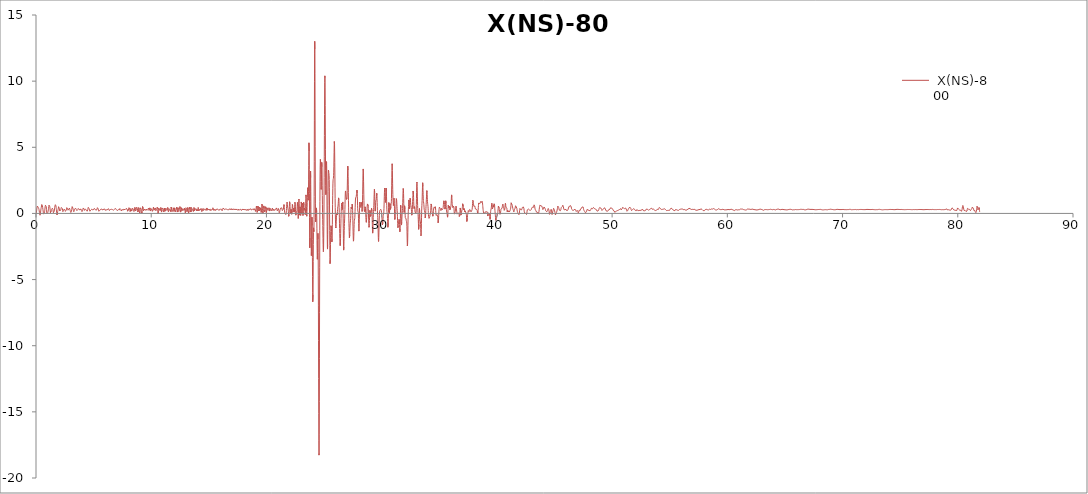
| Category |  X(NS)-800 |
|---|---|
| 0.0 | 0 |
| 0.01 | -0.018 |
| 0.02 | -0.003 |
| 0.03 | 0.041 |
| 0.04 | 0.106 |
| 0.05 | 0.182 |
| 0.06 | 0.262 |
| 0.07 | 0.337 |
| 0.08 | 0.404 |
| 0.09 | 0.46 |
| 0.1 | 0.504 |
| 0.11 | 0.535 |
| 0.12 | 0.554 |
| 0.13 | 0.56 |
| 0.14 | 0.555 |
| 0.15 | 0.54 |
| 0.16 | 0.519 |
| 0.17 | 0.494 |
| 0.18 | 0.468 |
| 0.19 | 0.446 |
| 0.2 | 0.429 |
| 0.21 | 0.415 |
| 0.22 | 0.403 |
| 0.23 | 0.389 |
| 0.24 | 0.369 |
| 0.25 | 0.339 |
| 0.26 | 0.299 |
| 0.27 | 0.248 |
| 0.28 | 0.19 |
| 0.29 | 0.128 |
| 0.3 | 0.064 |
| 0.31 | 0.005 |
| 0.32 | -0.049 |
| 0.33 | -0.092 |
| 0.34 | -0.123 |
| 0.35 | -0.136 |
| 0.36 | -0.129 |
| 0.37 | -0.1 |
| 0.38 | -0.048 |
| 0.39 | 0.022 |
| 0.4 | 0.104 |
| 0.41 | 0.187 |
| 0.42 | 0.265 |
| 0.43 | 0.33 |
| 0.44 | 0.383 |
| 0.45 | 0.427 |
| 0.46 | 0.468 |
| 0.47 | 0.513 |
| 0.48 | 0.564 |
| 0.49 | 0.619 |
| 0.5 | 0.673 |
| 0.51 | 0.714 |
| 0.52 | 0.734 |
| 0.53 | 0.728 |
| 0.54 | 0.695 |
| 0.55 | 0.641 |
| 0.56 | 0.575 |
| 0.57 | 0.506 |
| 0.58 | 0.44 |
| 0.59 | 0.377 |
| 0.6 | 0.315 |
| 0.61 | 0.25 |
| 0.62 | 0.183 |
| 0.63 | 0.113 |
| 0.64 | 0.046 |
| 0.65 | -0.011 |
| 0.66 | -0.052 |
| 0.67 | -0.074 |
| 0.68 | -0.079 |
| 0.69 | -0.07 |
| 0.7 | -0.051 |
| 0.71 | -0.027 |
| 0.72 | 0.004 |
| 0.73 | 0.043 |
| 0.74 | 0.094 |
| 0.75 | 0.159 |
| 0.76 | 0.236 |
| 0.77 | 0.318 |
| 0.78 | 0.4 |
| 0.79 | 0.474 |
| 0.8 | 0.534 |
| 0.81 | 0.582 |
| 0.82 | 0.617 |
| 0.83 | 0.645 |
| 0.84 | 0.664 |
| 0.85 | 0.674 |
| 0.86 | 0.668 |
| 0.87 | 0.641 |
| 0.88 | 0.587 |
| 0.89 | 0.508 |
| 0.9 | 0.408 |
| 0.91 | 0.299 |
| 0.92 | 0.191 |
| 0.93 | 0.097 |
| 0.94 | 0.024 |
| 0.95 | -0.025 |
| 0.96 | -0.052 |
| 0.97 | -0.061 |
| 0.98 | -0.056 |
| 0.99 | -0.041 |
| 1.0 | -0.019 |
| 1.01 | 0.01 |
| 1.02 | 0.045 |
| 1.03 | 0.084 |
| 1.04 | 0.127 |
| 1.05 | 0.172 |
| 1.06 | 0.22 |
| 1.07 | 0.271 |
| 1.08 | 0.326 |
| 1.09 | 0.386 |
| 1.1 | 0.45 |
| 1.11 | 0.514 |
| 1.12 | 0.575 |
| 1.13 | 0.628 |
| 1.14 | 0.666 |
| 1.15 | 0.687 |
| 1.16 | 0.689 |
| 1.17 | 0.671 |
| 1.18 | 0.633 |
| 1.19 | 0.578 |
| 1.2 | 0.505 |
| 1.21 | 0.419 |
| 1.22 | 0.322 |
| 1.23 | 0.222 |
| 1.24 | 0.129 |
| 1.25 | 0.052 |
| 1.26 | 0.001 |
| 1.27 | -0.018 |
| 1.28 | -0.003 |
| 1.29 | 0.042 |
| 1.3 | 0.106 |
| 1.31 | 0.178 |
| 1.32 | 0.243 |
| 1.33 | 0.293 |
| 1.34 | 0.323 |
| 1.35 | 0.334 |
| 1.36 | 0.331 |
| 1.37 | 0.323 |
| 1.38 | 0.319 |
| 1.39 | 0.324 |
| 1.4 | 0.341 |
| 1.41 | 0.365 |
| 1.42 | 0.392 |
| 1.43 | 0.412 |
| 1.44 | 0.417 |
| 1.45 | 0.402 |
| 1.46 | 0.367 |
| 1.47 | 0.313 |
| 1.48 | 0.246 |
| 1.49 | 0.176 |
| 1.5 | 0.109 |
| 1.51 | 0.053 |
| 1.52 | 0.013 |
| 1.53 | -0.009 |
| 1.54 | -0.013 |
| 1.55 | 0 |
| 1.56 | 0.029 |
| 1.57 | 0.072 |
| 1.58 | 0.126 |
| 1.59 | 0.188 |
| 1.6 | 0.257 |
| 1.61 | 0.329 |
| 1.62 | 0.4 |
| 1.63 | 0.467 |
| 1.64 | 0.527 |
| 1.65 | 0.577 |
| 1.66 | 0.616 |
| 1.67 | 0.644 |
| 1.68 | 0.66 |
| 1.69 | 0.665 |
| 1.7 | 0.659 |
| 1.71 | 0.642 |
| 1.72 | 0.614 |
| 1.73 | 0.574 |
| 1.74 | 0.522 |
| 1.75 | 0.456 |
| 1.76 | 0.378 |
| 1.77 | 0.288 |
| 1.78 | 0.19 |
| 1.79 | 0.092 |
| 1.8 | 0.003 |
| 1.81 | -0.068 |
| 1.82 | -0.113 |
| 1.83 | -0.125 |
| 1.84 | -0.106 |
| 1.85 | -0.061 |
| 1.86 | 0.002 |
| 1.87 | 0.07 |
| 1.88 | 0.134 |
| 1.89 | 0.188 |
| 1.9 | 0.232 |
| 1.91 | 0.27 |
| 1.92 | 0.308 |
| 1.93 | 0.352 |
| 1.94 | 0.403 |
| 1.95 | 0.458 |
| 1.96 | 0.51 |
| 1.97 | 0.548 |
| 1.98 | 0.564 |
| 1.99 | 0.553 |
| 2.0 | 0.515 |
| 2.01 | 0.456 |
| 2.02 | 0.388 |
| 2.03 | 0.32 |
| 2.04 | 0.261 |
| 2.05 | 0.215 |
| 2.06 | 0.18 |
| 2.07 | 0.155 |
| 2.08 | 0.136 |
| 2.09 | 0.122 |
| 2.1 | 0.114 |
| 2.11 | 0.116 |
| 2.12 | 0.132 |
| 2.13 | 0.163 |
| 2.14 | 0.209 |
| 2.15 | 0.264 |
| 2.16 | 0.322 |
| 2.17 | 0.374 |
| 2.18 | 0.414 |
| 2.19 | 0.439 |
| 2.2 | 0.45 |
| 2.21 | 0.452 |
| 2.22 | 0.45 |
| 2.23 | 0.448 |
| 2.24 | 0.448 |
| 2.25 | 0.447 |
| 2.26 | 0.442 |
| 2.27 | 0.428 |
| 2.28 | 0.399 |
| 2.29 | 0.356 |
| 2.3 | 0.301 |
| 2.31 | 0.24 |
| 2.32 | 0.181 |
| 2.33 | 0.134 |
| 2.34 | 0.104 |
| 2.35 | 0.094 |
| 2.36 | 0.105 |
| 2.37 | 0.131 |
| 2.38 | 0.165 |
| 2.39 | 0.202 |
| 2.4 | 0.235 |
| 2.41 | 0.262 |
| 2.42 | 0.285 |
| 2.43 | 0.304 |
| 2.44 | 0.322 |
| 2.45 | 0.339 |
| 2.46 | 0.355 |
| 2.47 | 0.364 |
| 2.48 | 0.363 |
| 2.49 | 0.348 |
| 2.5 | 0.318 |
| 2.51 | 0.278 |
| 2.52 | 0.235 |
| 2.53 | 0.195 |
| 2.54 | 0.167 |
| 2.55 | 0.154 |
| 2.56 | 0.156 |
| 2.57 | 0.169 |
| 2.58 | 0.187 |
| 2.59 | 0.206 |
| 2.6 | 0.223 |
| 2.61 | 0.238 |
| 2.62 | 0.254 |
| 2.63 | 0.275 |
| 2.64 | 0.305 |
| 2.65 | 0.345 |
| 2.66 | 0.391 |
| 2.67 | 0.438 |
| 2.68 | 0.478 |
| 2.69 | 0.504 |
| 2.7 | 0.511 |
| 2.71 | 0.497 |
| 2.72 | 0.465 |
| 2.73 | 0.421 |
| 2.74 | 0.371 |
| 2.75 | 0.324 |
| 2.76 | 0.285 |
| 2.77 | 0.258 |
| 2.78 | 0.243 |
| 2.79 | 0.239 |
| 2.8 | 0.242 |
| 2.81 | 0.25 |
| 2.82 | 0.26 |
| 2.83 | 0.272 |
| 2.84 | 0.287 |
| 2.85 | 0.306 |
| 2.86 | 0.329 |
| 2.87 | 0.355 |
| 2.88 | 0.381 |
| 2.89 | 0.4 |
| 2.9 | 0.408 |
| 2.91 | 0.402 |
| 2.92 | 0.382 |
| 2.93 | 0.35 |
| 2.94 | 0.312 |
| 2.95 | 0.272 |
| 2.96 | 0.236 |
| 2.97 | 0.204 |
| 2.98 | 0.176 |
| 2.99 | 0.149 |
| 3.0 | 0.122 |
| 3.01 | 0.096 |
| 3.02 | 0.073 |
| 3.03 | 0.057 |
| 3.04 | 0.052 |
| 3.05 | 0.061 |
| 3.06 | 0.086 |
| 3.07 | 0.124 |
| 3.08 | 0.173 |
| 3.09 | 0.23 |
| 3.1 | 0.291 |
| 3.11 | 0.354 |
| 3.12 | 0.415 |
| 3.13 | 0.471 |
| 3.14 | 0.516 |
| 3.15 | 0.544 |
| 3.16 | 0.552 |
| 3.17 | 0.537 |
| 3.18 | 0.503 |
| 3.19 | 0.457 |
| 3.2 | 0.407 |
| 3.21 | 0.361 |
| 3.22 | 0.321 |
| 3.23 | 0.289 |
| 3.24 | 0.26 |
| 3.25 | 0.229 |
| 3.26 | 0.196 |
| 3.27 | 0.16 |
| 3.28 | 0.129 |
| 3.29 | 0.111 |
| 3.3 | 0.112 |
| 3.31 | 0.135 |
| 3.32 | 0.177 |
| 3.33 | 0.228 |
| 3.34 | 0.278 |
| 3.35 | 0.316 |
| 3.36 | 0.338 |
| 3.37 | 0.345 |
| 3.38 | 0.343 |
| 3.39 | 0.341 |
| 3.4 | 0.345 |
| 3.41 | 0.358 |
| 3.42 | 0.378 |
| 3.43 | 0.398 |
| 3.44 | 0.411 |
| 3.45 | 0.413 |
| 3.46 | 0.402 |
| 3.47 | 0.38 |
| 3.48 | 0.352 |
| 3.49 | 0.324 |
| 3.5 | 0.299 |
| 3.51 | 0.277 |
| 3.52 | 0.259 |
| 3.53 | 0.242 |
| 3.54 | 0.226 |
| 3.55 | 0.211 |
| 3.56 | 0.199 |
| 3.57 | 0.191 |
| 3.58 | 0.191 |
| 3.59 | 0.199 |
| 3.6 | 0.215 |
| 3.61 | 0.236 |
| 3.62 | 0.262 |
| 3.63 | 0.289 |
| 3.64 | 0.316 |
| 3.65 | 0.342 |
| 3.66 | 0.362 |
| 3.67 | 0.375 |
| 3.68 | 0.379 |
| 3.69 | 0.374 |
| 3.7 | 0.36 |
| 3.71 | 0.342 |
| 3.72 | 0.323 |
| 3.73 | 0.307 |
| 3.74 | 0.297 |
| 3.75 | 0.293 |
| 3.76 | 0.291 |
| 3.77 | 0.288 |
| 3.78 | 0.283 |
| 3.79 | 0.273 |
| 3.8 | 0.262 |
| 3.81 | 0.252 |
| 3.82 | 0.25 |
| 3.83 | 0.258 |
| 3.84 | 0.274 |
| 3.85 | 0.298 |
| 3.86 | 0.323 |
| 3.87 | 0.345 |
| 3.88 | 0.358 |
| 3.89 | 0.363 |
| 3.9 | 0.359 |
| 3.91 | 0.35 |
| 3.92 | 0.337 |
| 3.93 | 0.321 |
| 3.94 | 0.302 |
| 3.95 | 0.278 |
| 3.96 | 0.247 |
| 3.97 | 0.211 |
| 3.98 | 0.173 |
| 3.99 | 0.138 |
| 4.0 | 0.112 |
| 4.01 | 0.099 |
| 4.02 | 0.103 |
| 4.03 | 0.122 |
| 4.04 | 0.154 |
| 4.05 | 0.196 |
| 4.06 | 0.241 |
| 4.07 | 0.288 |
| 4.08 | 0.333 |
| 4.09 | 0.375 |
| 4.1 | 0.412 |
| 4.11 | 0.443 |
| 4.12 | 0.464 |
| 4.13 | 0.475 |
| 4.14 | 0.472 |
| 4.15 | 0.456 |
| 4.16 | 0.43 |
| 4.17 | 0.396 |
| 4.18 | 0.359 |
| 4.19 | 0.321 |
| 4.2 | 0.285 |
| 4.21 | 0.254 |
| 4.22 | 0.229 |
| 4.23 | 0.212 |
| 4.24 | 0.204 |
| 4.25 | 0.207 |
| 4.26 | 0.222 |
| 4.27 | 0.245 |
| 4.28 | 0.273 |
| 4.29 | 0.302 |
| 4.3 | 0.325 |
| 4.31 | 0.339 |
| 4.32 | 0.341 |
| 4.33 | 0.334 |
| 4.34 | 0.32 |
| 4.35 | 0.304 |
| 4.36 | 0.289 |
| 4.37 | 0.275 |
| 4.38 | 0.263 |
| 4.39 | 0.251 |
| 4.4 | 0.235 |
| 4.41 | 0.217 |
| 4.42 | 0.196 |
| 4.43 | 0.178 |
| 4.44 | 0.167 |
| 4.45 | 0.166 |
| 4.46 | 0.178 |
| 4.47 | 0.205 |
| 4.48 | 0.242 |
| 4.49 | 0.285 |
| 4.5 | 0.331 |
| 4.51 | 0.374 |
| 4.52 | 0.411 |
| 4.53 | 0.439 |
| 4.54 | 0.459 |
| 4.55 | 0.468 |
| 4.56 | 0.468 |
| 4.57 | 0.459 |
| 4.58 | 0.442 |
| 4.59 | 0.418 |
| 4.6 | 0.389 |
| 4.61 | 0.356 |
| 4.62 | 0.32 |
| 4.63 | 0.285 |
| 4.64 | 0.252 |
| 4.65 | 0.222 |
| 4.66 | 0.197 |
| 4.67 | 0.178 |
| 4.68 | 0.166 |
| 4.69 | 0.161 |
| 4.7 | 0.165 |
| 4.71 | 0.175 |
| 4.72 | 0.191 |
| 4.73 | 0.21 |
| 4.74 | 0.23 |
| 4.75 | 0.248 |
| 4.76 | 0.265 |
| 4.77 | 0.279 |
| 4.78 | 0.291 |
| 4.79 | 0.3 |
| 4.8 | 0.307 |
| 4.81 | 0.312 |
| 4.82 | 0.316 |
| 4.83 | 0.319 |
| 4.84 | 0.32 |
| 4.85 | 0.319 |
| 4.86 | 0.318 |
| 4.87 | 0.315 |
| 4.88 | 0.312 |
| 4.89 | 0.308 |
| 4.9 | 0.302 |
| 4.91 | 0.294 |
| 4.92 | 0.282 |
| 4.93 | 0.268 |
| 4.94 | 0.253 |
| 4.95 | 0.237 |
| 4.96 | 0.224 |
| 4.97 | 0.217 |
| 4.98 | 0.218 |
| 4.99 | 0.227 |
| 5.0 | 0.246 |
| 5.01 | 0.271 |
| 5.02 | 0.3 |
| 5.03 | 0.33 |
| 5.04 | 0.356 |
| 5.05 | 0.376 |
| 5.06 | 0.389 |
| 5.07 | 0.396 |
| 5.08 | 0.395 |
| 5.09 | 0.388 |
| 5.1 | 0.377 |
| 5.11 | 0.362 |
| 5.12 | 0.344 |
| 5.13 | 0.324 |
| 5.14 | 0.304 |
| 5.15 | 0.284 |
| 5.16 | 0.267 |
| 5.17 | 0.254 |
| 5.18 | 0.245 |
| 5.19 | 0.24 |
| 5.2 | 0.238 |
| 5.21 | 0.238 |
| 5.22 | 0.238 |
| 5.23 | 0.237 |
| 5.24 | 0.237 |
| 5.25 | 0.239 |
| 5.26 | 0.246 |
| 5.27 | 0.258 |
| 5.28 | 0.279 |
| 5.29 | 0.307 |
| 5.3 | 0.341 |
| 5.31 | 0.376 |
| 5.32 | 0.409 |
| 5.33 | 0.435 |
| 5.34 | 0.45 |
| 5.35 | 0.453 |
| 5.36 | 0.442 |
| 5.37 | 0.421 |
| 5.38 | 0.391 |
| 5.39 | 0.356 |
| 5.4 | 0.319 |
| 5.41 | 0.284 |
| 5.42 | 0.251 |
| 5.43 | 0.223 |
| 5.44 | 0.198 |
| 5.45 | 0.179 |
| 5.46 | 0.164 |
| 5.47 | 0.154 |
| 5.48 | 0.15 |
| 5.49 | 0.153 |
| 5.5 | 0.163 |
| 5.51 | 0.178 |
| 5.52 | 0.198 |
| 5.53 | 0.22 |
| 5.54 | 0.242 |
| 5.55 | 0.26 |
| 5.56 | 0.274 |
| 5.57 | 0.284 |
| 5.58 | 0.29 |
| 5.59 | 0.293 |
| 5.6 | 0.296 |
| 5.61 | 0.3 |
| 5.62 | 0.306 |
| 5.63 | 0.313 |
| 5.64 | 0.321 |
| 5.65 | 0.327 |
| 5.66 | 0.332 |
| 5.67 | 0.333 |
| 5.68 | 0.331 |
| 5.69 | 0.328 |
| 5.7 | 0.325 |
| 5.71 | 0.324 |
| 5.72 | 0.325 |
| 5.73 | 0.329 |
| 5.74 | 0.333 |
| 5.75 | 0.335 |
| 5.76 | 0.333 |
| 5.77 | 0.324 |
| 5.78 | 0.309 |
| 5.79 | 0.29 |
| 5.8 | 0.27 |
| 5.81 | 0.253 |
| 5.82 | 0.244 |
| 5.83 | 0.244 |
| 5.84 | 0.252 |
| 5.85 | 0.269 |
| 5.86 | 0.29 |
| 5.87 | 0.311 |
| 5.88 | 0.332 |
| 5.89 | 0.35 |
| 5.9 | 0.364 |
| 5.91 | 0.376 |
| 5.92 | 0.383 |
| 5.93 | 0.385 |
| 5.94 | 0.382 |
| 5.95 | 0.372 |
| 5.96 | 0.353 |
| 5.97 | 0.328 |
| 5.98 | 0.299 |
| 5.99 | 0.268 |
| 6.0 | 0.241 |
| 6.01 | 0.221 |
| 6.02 | 0.21 |
| 6.03 | 0.207 |
| 6.04 | 0.213 |
| 6.05 | 0.223 |
| 6.06 | 0.236 |
| 6.07 | 0.248 |
| 6.08 | 0.258 |
| 6.09 | 0.267 |
| 6.1 | 0.273 |
| 6.11 | 0.278 |
| 6.12 | 0.282 |
| 6.13 | 0.284 |
| 6.14 | 0.285 |
| 6.15 | 0.283 |
| 6.16 | 0.279 |
| 6.17 | 0.274 |
| 6.18 | 0.269 |
| 6.19 | 0.266 |
| 6.2 | 0.268 |
| 6.21 | 0.276 |
| 6.22 | 0.289 |
| 6.23 | 0.308 |
| 6.24 | 0.329 |
| 6.25 | 0.351 |
| 6.26 | 0.37 |
| 6.27 | 0.385 |
| 6.28 | 0.394 |
| 6.29 | 0.397 |
| 6.3 | 0.393 |
| 6.31 | 0.383 |
| 6.32 | 0.367 |
| 6.33 | 0.344 |
| 6.34 | 0.317 |
| 6.35 | 0.285 |
| 6.36 | 0.251 |
| 6.37 | 0.218 |
| 6.38 | 0.191 |
| 6.39 | 0.172 |
| 6.4 | 0.165 |
| 6.41 | 0.17 |
| 6.42 | 0.187 |
| 6.43 | 0.213 |
| 6.44 | 0.243 |
| 6.45 | 0.273 |
| 6.46 | 0.298 |
| 6.47 | 0.316 |
| 6.48 | 0.325 |
| 6.49 | 0.327 |
| 6.5 | 0.322 |
| 6.51 | 0.316 |
| 6.52 | 0.309 |
| 6.53 | 0.306 |
| 6.54 | 0.307 |
| 6.55 | 0.311 |
| 6.56 | 0.318 |
| 6.57 | 0.325 |
| 6.58 | 0.33 |
| 6.59 | 0.332 |
| 6.6 | 0.33 |
| 6.61 | 0.323 |
| 6.62 | 0.314 |
| 6.63 | 0.302 |
| 6.64 | 0.29 |
| 6.65 | 0.278 |
| 6.66 | 0.267 |
| 6.67 | 0.258 |
| 6.68 | 0.252 |
| 6.69 | 0.248 |
| 6.7 | 0.246 |
| 6.71 | 0.246 |
| 6.72 | 0.247 |
| 6.73 | 0.249 |
| 6.74 | 0.251 |
| 6.75 | 0.252 |
| 6.76 | 0.254 |
| 6.77 | 0.257 |
| 6.78 | 0.263 |
| 6.79 | 0.272 |
| 6.8 | 0.287 |
| 6.81 | 0.304 |
| 6.82 | 0.324 |
| 6.83 | 0.342 |
| 6.84 | 0.358 |
| 6.85 | 0.369 |
| 6.86 | 0.375 |
| 6.87 | 0.378 |
| 6.88 | 0.377 |
| 6.89 | 0.376 |
| 6.9 | 0.374 |
| 6.91 | 0.371 |
| 6.92 | 0.365 |
| 6.93 | 0.356 |
| 6.94 | 0.343 |
| 6.95 | 0.327 |
| 6.96 | 0.31 |
| 6.97 | 0.294 |
| 6.98 | 0.281 |
| 6.99 | 0.272 |
| 7.0 | 0.265 |
| 7.01 | 0.258 |
| 7.02 | 0.25 |
| 7.03 | 0.239 |
| 7.04 | 0.225 |
| 7.05 | 0.213 |
| 7.06 | 0.204 |
| 7.07 | 0.202 |
| 7.08 | 0.209 |
| 7.09 | 0.224 |
| 7.1 | 0.243 |
| 7.11 | 0.263 |
| 7.12 | 0.278 |
| 7.13 | 0.288 |
| 7.14 | 0.291 |
| 7.15 | 0.288 |
| 7.16 | 0.282 |
| 7.17 | 0.276 |
| 7.18 | 0.271 |
| 7.19 | 0.268 |
| 7.2 | 0.265 |
| 7.21 | 0.264 |
| 7.22 | 0.264 |
| 7.23 | 0.266 |
| 7.24 | 0.274 |
| 7.25 | 0.289 |
| 7.26 | 0.311 |
| 7.27 | 0.34 |
| 7.28 | 0.371 |
| 7.29 | 0.4 |
| 7.3 | 0.422 |
| 7.31 | 0.433 |
| 7.32 | 0.432 |
| 7.33 | 0.418 |
| 7.34 | 0.394 |
| 7.35 | 0.363 |
| 7.36 | 0.327 |
| 7.37 | 0.29 |
| 7.38 | 0.252 |
| 7.39 | 0.216 |
| 7.4 | 0.185 |
| 7.41 | 0.161 |
| 7.42 | 0.147 |
| 7.43 | 0.146 |
| 7.44 | 0.159 |
| 7.45 | 0.183 |
| 7.46 | 0.216 |
| 7.47 | 0.254 |
| 7.48 | 0.29 |
| 7.49 | 0.321 |
| 7.5 | 0.342 |
| 7.51 | 0.351 |
| 7.52 | 0.348 |
| 7.53 | 0.335 |
| 7.54 | 0.314 |
| 7.55 | 0.289 |
| 7.56 | 0.266 |
| 7.57 | 0.248 |
| 7.58 | 0.239 |
| 7.59 | 0.241 |
| 7.6 | 0.254 |
| 7.61 | 0.275 |
| 7.62 | 0.302 |
| 7.63 | 0.329 |
| 7.64 | 0.352 |
| 7.65 | 0.369 |
| 7.66 | 0.378 |
| 7.67 | 0.378 |
| 7.68 | 0.371 |
| 7.69 | 0.356 |
| 7.7 | 0.334 |
| 7.71 | 0.305 |
| 7.72 | 0.273 |
| 7.73 | 0.241 |
| 7.74 | 0.215 |
| 7.75 | 0.199 |
| 7.76 | 0.2 |
| 7.77 | 0.217 |
| 7.78 | 0.25 |
| 7.79 | 0.292 |
| 7.8 | 0.333 |
| 7.81 | 0.367 |
| 7.82 | 0.388 |
| 7.83 | 0.394 |
| 7.84 | 0.388 |
| 7.85 | 0.376 |
| 7.86 | 0.364 |
| 7.87 | 0.357 |
| 7.88 | 0.353 |
| 7.89 | 0.351 |
| 7.9 | 0.344 |
| 7.91 | 0.328 |
| 7.92 | 0.299 |
| 7.93 | 0.258 |
| 7.94 | 0.21 |
| 7.95 | 0.163 |
| 7.96 | 0.125 |
| 7.97 | 0.101 |
| 7.98 | 0.097 |
| 7.99 | 0.112 |
| 8.0 | 0.145 |
| 8.01 | 0.189 |
| 8.02 | 0.239 |
| 8.03 | 0.291 |
| 8.04 | 0.339 |
| 8.05 | 0.381 |
| 8.06 | 0.414 |
| 8.07 | 0.437 |
| 8.08 | 0.45 |
| 8.09 | 0.451 |
| 8.1 | 0.44 |
| 8.11 | 0.417 |
| 8.12 | 0.381 |
| 8.13 | 0.334 |
| 8.14 | 0.28 |
| 8.15 | 0.225 |
| 8.16 | 0.178 |
| 8.17 | 0.147 |
| 8.18 | 0.139 |
| 8.19 | 0.158 |
| 8.2 | 0.202 |
| 8.21 | 0.261 |
| 8.22 | 0.326 |
| 8.23 | 0.381 |
| 8.24 | 0.415 |
| 8.25 | 0.421 |
| 8.26 | 0.398 |
| 8.27 | 0.351 |
| 8.28 | 0.29 |
| 8.29 | 0.228 |
| 8.3 | 0.178 |
| 8.31 | 0.146 |
| 8.32 | 0.139 |
| 8.33 | 0.156 |
| 8.34 | 0.193 |
| 8.35 | 0.242 |
| 8.36 | 0.297 |
| 8.37 | 0.349 |
| 8.38 | 0.393 |
| 8.39 | 0.424 |
| 8.4 | 0.44 |
| 8.41 | 0.439 |
| 8.42 | 0.423 |
| 8.43 | 0.394 |
| 8.44 | 0.356 |
| 8.45 | 0.312 |
| 8.46 | 0.266 |
| 8.47 | 0.223 |
| 8.48 | 0.186 |
| 8.49 | 0.158 |
| 8.5 | 0.143 |
| 8.51 | 0.144 |
| 8.52 | 0.162 |
| 8.53 | 0.198 |
| 8.54 | 0.249 |
| 8.55 | 0.309 |
| 8.56 | 0.37 |
| 8.57 | 0.421 |
| 8.58 | 0.454 |
| 8.59 | 0.46 |
| 8.6 | 0.437 |
| 8.61 | 0.389 |
| 8.62 | 0.322 |
| 8.63 | 0.248 |
| 8.64001 | 0.182 |
| 8.65 | 0.134 |
| 8.66 | 0.111 |
| 8.67 | 0.118 |
| 8.68001 | 0.151 |
| 8.69 | 0.204 |
| 8.7 | 0.267 |
| 8.71 | 0.332 |
| 8.72001 | 0.391 |
| 8.73 | 0.439 |
| 8.74 | 0.473 |
| 8.75 | 0.492 |
| 8.76 | 0.498 |
| 8.77 | 0.488 |
| 8.78 | 0.464 |
| 8.79 | 0.424 |
| 8.8 | 0.37 |
| 8.81001 | 0.304 |
| 8.82 | 0.233 |
| 8.83 | 0.164 |
| 8.84 | 0.11 |
| 8.85001 | 0.08 |
| 8.86 | 0.082 |
| 8.87 | 0.119 |
| 8.88 | 0.186 |
| 8.89001 | 0.272 |
| 8.9 | 0.362 |
| 8.91 | 0.439 |
| 8.92 | 0.488 |
| 8.93001 | 0.499 |
| 8.94 | 0.469 |
| 8.95 | 0.404 |
| 8.96 | 0.316 |
| 8.97001 | 0.221 |
| 8.98001 | 0.135 |
| 8.99 | 0.071 |
| 9.0 | 0.039 |
| 9.01 | 0.041 |
| 9.02001 | 0.075 |
| 9.03 | 0.134 |
| 9.04 | 0.209 |
| 9.05 | 0.288 |
| 9.06001 | 0.364 |
| 9.07 | 0.427 |
| 9.08 | 0.472 |
| 9.09 | 0.496 |
| 9.10001 | 0.496 |
| 9.11 | 0.474 |
| 9.12 | 0.431 |
| 9.13 | 0.37 |
| 9.14001 | 0.294 |
| 9.15001 | 0.213 |
| 9.16 | 0.133 |
| 9.17 | 0.067 |
| 9.18001 | 0.026 |
| 9.19001 | 0.017 |
| 9.2 | 0.047 |
| 9.21 | 0.115 |
| 9.22001 | 0.212 |
| 9.23001 | 0.324 |
| 9.24 | 0.433 |
| 9.25 | 0.52 |
| 9.26 | 0.57 |
| 9.27001 | 0.576 |
| 9.28 | 0.538 |
| 9.29 | 0.469 |
| 9.3 | 0.383 |
| 9.31001 | 0.299 |
| 9.32001 | 0.234 |
| 9.33 | 0.199 |
| 9.34 | 0.196 |
| 9.35001 | 0.219 |
| 9.36001 | 0.258 |
| 9.37 | 0.3 |
| 9.38 | 0.333 |
| 9.39001 | 0.35 |
| 9.40001 | 0.35 |
| 9.41 | 0.335 |
| 9.42 | 0.313 |
| 9.43001 | 0.293 |
| 9.44001 | 0.28 |
| 9.45001 | 0.277 |
| 9.46 | 0.282 |
| 9.47001 | 0.288 |
| 9.48001 | 0.29 |
| 9.49001 | 0.283 |
| 9.5 | 0.265 |
| 9.51 | 0.242 |
| 9.52001 | 0.222 |
| 9.53001 | 0.211 |
| 9.54 | 0.218 |
| 9.55 | 0.243 |
| 9.56001 | 0.282 |
| 9.57001 | 0.326 |
| 9.58 | 0.363 |
| 9.59 | 0.384 |
| 9.60001 | 0.383 |
| 9.61001 | 0.361 |
| 9.62001 | 0.324 |
| 9.63 | 0.28 |
| 9.64001 | 0.239 |
| 9.65001 | 0.208 |
| 9.66001 | 0.191 |
| 9.67 | 0.186 |
| 9.68001 | 0.191 |
| 9.69001 | 0.205 |
| 9.70001 | 0.225 |
| 9.71 | 0.253 |
| 9.72001 | 0.286 |
| 9.73001 | 0.324 |
| 9.74001 | 0.361 |
| 9.75 | 0.391 |
| 9.76 | 0.405 |
| 9.77001 | 0.399 |
| 9.78001 | 0.37 |
| 9.79001 | 0.324 |
| 9.8 | 0.271 |
| 9.81001 | 0.224 |
| 9.82001 | 0.196 |
| 9.83001 | 0.194 |
| 9.84 | 0.222 |
| 9.85001 | 0.271 |
| 9.86001 | 0.331 |
| 9.87001 | 0.385 |
| 9.88 | 0.42 |
| 9.89001 | 0.427 |
| 9.90001 | 0.404 |
| 9.91001 | 0.355 |
| 9.92001 | 0.293 |
| 9.93001 | 0.23 |
| 9.94001 | 0.18 |
| 9.95001 | 0.152 |
| 9.96001 | 0.15 |
| 9.97001 | 0.172 |
| 9.98001 | 0.213 |
| 9.99001 | 0.264 |
| 10.00001 | 0.315 |
| 10.01 | 0.36 |
| 10.02001 | 0.393 |
| 10.03001 | 0.41 |
| 10.04001 | 0.409 |
| 10.05 | 0.392 |
| 10.06001 | 0.358 |
| 10.07001 | 0.312 |
| 10.08001 | 0.258 |
| 10.09001 | 0.204 |
| 10.10001 | 0.157 |
| 10.11001 | 0.127 |
| 10.12001 | 0.12 |
| 10.13001 | 0.139 |
| 10.14001 | 0.184 |
| 10.15001 | 0.247 |
| 10.16001 | 0.318 |
| 10.17001 | 0.384 |
| 10.18001 | 0.435 |
| 10.19001 | 0.462 |
| 10.20001 | 0.464 |
| 10.21001 | 0.44 |
| 10.22001 | 0.399 |
| 10.23001 | 0.347 |
| 10.24001 | 0.292 |
| 10.25001 | 0.243 |
| 10.26001 | 0.206 |
| 10.27001 | 0.183 |
| 10.28001 | 0.179 |
| 10.29001 | 0.195 |
| 10.30001 | 0.229 |
| 10.31001 | 0.277 |
| 10.32001 | 0.331 |
| 10.33001 | 0.38 |
| 10.34001 | 0.414 |
| 10.35001 | 0.423 |
| 10.36001 | 0.404 |
| 10.37001 | 0.361 |
| 10.38001 | 0.303 |
| 10.39001 | 0.245 |
| 10.40001 | 0.2 |
| 10.41001 | 0.177 |
| 10.42001 | 0.178 |
| 10.43001 | 0.2 |
| 10.44001 | 0.233 |
| 10.45001 | 0.266 |
| 10.46001 | 0.294 |
| 10.47001 | 0.317 |
| 10.48001 | 0.339 |
| 10.49001 | 0.366 |
| 10.50001 | 0.403 |
| 10.51001 | 0.444 |
| 10.52001 | 0.48 |
| 10.53001 | 0.493 |
| 10.54001 | 0.469 |
| 10.55001 | 0.401 |
| 10.56001 | 0.294 |
| 10.57001 | 0.167 |
| 10.58001 | 0.049 |
| 10.59001 | -0.03 |
| 10.60001 | -0.049 |
| 10.61001 | -0.005 |
| 10.62001 | 0.092 |
| 10.63001 | 0.214 |
| 10.64001 | 0.33 |
| 10.65001 | 0.414 |
| 10.66001 | 0.451 |
| 10.67001 | 0.445 |
| 10.68001 | 0.41 |
| 10.69001 | 0.37 |
| 10.70001 | 0.341 |
| 10.71001 | 0.332 |
| 10.72001 | 0.339 |
| 10.73001 | 0.347 |
| 10.74001 | 0.341 |
| 10.75001 | 0.311 |
| 10.76001 | 0.259 |
| 10.77001 | 0.2 |
| 10.78001 | 0.154 |
| 10.79001 | 0.143 |
| 10.80001 | 0.178 |
| 10.81001 | 0.255 |
| 10.82001 | 0.354 |
| 10.83001 | 0.446 |
| 10.84001 | 0.501 |
| 10.85001 | 0.499 |
| 10.86001 | 0.438 |
| 10.87001 | 0.332 |
| 10.88001 | 0.209 |
| 10.89001 | 0.102 |
| 10.90001 | 0.039 |
| 10.91001 | 0.032 |
| 10.92001 | 0.078 |
| 10.93001 | 0.159 |
| 10.94001 | 0.25 |
| 10.95001 | 0.33 |
| 10.96001 | 0.385 |
| 10.97001 | 0.413 |
| 10.98001 | 0.423 |
| 10.99001 | 0.428 |
| 11.00001 | 0.438 |
| 11.01001 | 0.455 |
| 11.02001 | 0.471 |
| 11.03001 | 0.474 |
| 11.04001 | 0.45 |
| 11.05001 | 0.392 |
| 11.06001 | 0.306 |
| 11.07001 | 0.208 |
| 11.08001 | 0.124 |
| 11.09001 | 0.077 |
| 11.10001 | 0.082 |
| 11.11001 | 0.138 |
| 11.12001 | 0.23 |
| 11.13001 | 0.33 |
| 11.14001 | 0.407 |
| 11.15001 | 0.439 |
| 11.16001 | 0.416 |
| 11.17001 | 0.346 |
| 11.18001 | 0.252 |
| 11.19001 | 0.161 |
| 11.20001 | 0.102 |
| 11.21001 | 0.09 |
| 11.22001 | 0.126 |
| 11.23001 | 0.197 |
| 11.24001 | 0.281 |
| 11.25001 | 0.355 |
| 11.26001 | 0.403 |
| 11.27001 | 0.42 |
| 11.28001 | 0.41 |
| 11.29001 | 0.388 |
| 11.30001 | 0.364 |
| 11.31001 | 0.349 |
| 11.32001 | 0.342 |
| 11.33001 | 0.336 |
| 11.34001 | 0.324 |
| 11.35001 | 0.298 |
| 11.36001 | 0.26 |
| 11.37001 | 0.218 |
| 11.38001 | 0.189 |
| 11.39001 | 0.187 |
| 11.40001 | 0.221 |
| 11.41001 | 0.286 |
| 11.42001 | 0.369 |
| 11.43001 | 0.445 |
| 11.44001 | 0.49 |
| 11.45001 | 0.487 |
| 11.46001 | 0.432 |
| 11.47001 | 0.337 |
| 11.48001 | 0.227 |
| 11.49001 | 0.13 |
| 11.50001 | 0.069 |
| 11.51001 | 0.058 |
| 11.52001 | 0.093 |
| 11.53001 | 0.159 |
| 11.54001 | 0.234 |
| 11.55001 | 0.299 |
| 11.56001 | 0.343 |
| 11.57001 | 0.363 |
| 11.58001 | 0.367 |
| 11.59001 | 0.367 |
| 11.60001 | 0.368 |
| 11.61001 | 0.373 |
| 11.62001 | 0.374 |
| 11.63001 | 0.361 |
| 11.64001 | 0.327 |
| 11.65001 | 0.271 |
| 11.66001 | 0.204 |
| 11.67001 | 0.147 |
| 11.68001 | 0.118 |
| 11.69001 | 0.135 |
| 11.70001 | 0.198 |
| 11.71001 | 0.295 |
| 11.72001 | 0.4 |
| 11.73001 | 0.483 |
| 11.74001 | 0.519 |
| 11.75001 | 0.498 |
| 11.76001 | 0.428 |
| 11.77001 | 0.331 |
| 11.78001 | 0.235 |
| 11.79001 | 0.166 |
| 11.80001 | 0.139 |
| 11.81001 | 0.151 |
| 11.82001 | 0.188 |
| 11.83001 | 0.229 |
| 11.84001 | 0.258 |
| 11.85001 | 0.267 |
| 11.86001 | 0.263 |
| 11.87001 | 0.26 |
| 11.88001 | 0.273 |
| 11.89001 | 0.31 |
| 11.90001 | 0.366 |
| 11.91001 | 0.426 |
| 11.92001 | 0.465 |
| 11.93001 | 0.464 |
| 11.94001 | 0.417 |
| 11.95001 | 0.332 |
| 11.96001 | 0.234 |
| 11.97001 | 0.154 |
| 11.98001 | 0.121 |
| 11.99001 | 0.146 |
| 12.00001 | 0.223 |
| 12.01001 | 0.326 |
| 12.02001 | 0.422 |
| 12.03001 | 0.479 |
| 12.04001 | 0.48 |
| 12.05001 | 0.426 |
| 12.06001 | 0.336 |
| 12.07001 | 0.239 |
| 12.08001 | 0.164 |
| 12.09001 | 0.13 |
| 12.10001 | 0.137 |
| 12.11001 | 0.174 |
| 12.12001 | 0.221 |
| 12.13001 | 0.26 |
| 12.14001 | 0.28 |
| 12.15001 | 0.286 |
| 12.16001 | 0.289 |
| 12.17001 | 0.304 |
| 12.18001 | 0.338 |
| 12.19001 | 0.388 |
| 12.20001 | 0.438 |
| 12.21001 | 0.467 |
| 12.22001 | 0.458 |
| 12.23001 | 0.401 |
| 12.24001 | 0.306 |
| 12.25001 | 0.197 |
| 12.26001 | 0.105 |
| 12.27001 | 0.057 |
| 12.28001 | 0.069 |
| 12.29001 | 0.138 |
| 12.30001 | 0.242 |
| 12.31001 | 0.351 |
| 12.32001 | 0.433 |
| 12.33001 | 0.467 |
| 12.34001 | 0.446 |
| 12.35001 | 0.383 |
| 12.36001 | 0.299 |
| 12.37001 | 0.218 |
| 12.38001 | 0.16 |
| 12.39001 | 0.133 |
| 12.40001 | 0.135 |
| 12.41001 | 0.157 |
| 12.42001 | 0.188 |
| 12.43001 | 0.224 |
| 12.44001 | 0.262 |
| 12.45001 | 0.306 |
| 12.46001 | 0.359 |
| 12.47001 | 0.418 |
| 12.48001 | 0.475 |
| 12.49001 | 0.515 |
| 12.50001 | 0.521 |
| 12.51001 | 0.485 |
| 12.52001 | 0.406 |
| 12.53001 | 0.298 |
| 12.54001 | 0.188 |
| 12.55001 | 0.1 |
| 12.56001 | 0.059 |
| 12.57001 | 0.075 |
| 12.58001 | 0.14 |
| 12.59001 | 0.234 |
| 12.60001 | 0.331 |
| 12.61001 | 0.401 |
| 12.62001 | 0.429 |
| 12.63001 | 0.411 |
| 12.64001 | 0.358 |
| 12.65001 | 0.29 |
| 12.66001 | 0.227 |
| 12.67001 | 0.188 |
| 12.68001 | 0.179 |
| 12.69001 | 0.197 |
| 12.70001 | 0.232 |
| 12.71001 | 0.272 |
| 12.72001 | 0.308 |
| 12.73001 | 0.338 |
| 12.74001 | 0.361 |
| 12.75001 | 0.38 |
| 12.76001 | 0.397 |
| 12.77001 | 0.409 |
| 12.78001 | 0.408 |
| 12.79001 | 0.39 |
| 12.80001 | 0.35 |
| 12.81001 | 0.293 |
| 12.82001 | 0.231 |
| 12.83001 | 0.181 |
| 12.84001 | 0.161 |
| 12.85001 | 0.18 |
| 12.86001 | 0.236 |
| 12.87001 | 0.316 |
| 12.88001 | 0.397 |
| 12.89001 | 0.452 |
| 12.90001 | 0.462 |
| 12.91001 | 0.421 |
| 12.92001 | 0.337 |
| 12.93001 | 0.232 |
| 12.94001 | 0.133 |
| 12.95001 | 0.067 |
| 12.96001 | 0.049 |
| 12.97001 | 0.082 |
| 12.98001 | 0.156 |
| 12.99001 | 0.252 |
| 13.00001 | 0.35 |
| 13.01001 | 0.431 |
| 13.02001 | 0.484 |
| 13.03001 | 0.506 |
| 13.04001 | 0.499 |
| 13.05001 | 0.466 |
| 13.06001 | 0.413 |
| 13.07001 | 0.345 |
| 13.08001 | 0.269 |
| 13.09001 | 0.194 |
| 13.10001 | 0.134 |
| 13.11001 | 0.102 |
| 13.12001 | 0.109 |
| 13.13001 | 0.16 |
| 13.14001 | 0.245 |
| 13.15001 | 0.348 |
| 13.16001 | 0.44 |
| 13.17001 | 0.497 |
| 13.18001 | 0.5 |
| 13.19001 | 0.446 |
| 13.20001 | 0.346 |
| 13.21001 | 0.227 |
| 13.22001 | 0.118 |
| 13.23001 | 0.047 |
| 13.24001 | 0.028 |
| 13.25001 | 0.061 |
| 13.26001 | 0.133 |
| 13.27001 | 0.226 |
| 13.28001 | 0.319 |
| 13.29001 | 0.396 |
| 13.30001 | 0.448 |
| 13.31001 | 0.474 |
| 13.32001 | 0.474 |
| 13.33001 | 0.45 |
| 13.34001 | 0.404 |
| 13.35001 | 0.338 |
| 13.36001 | 0.26 |
| 13.37001 | 0.184 |
| 13.38001 | 0.127 |
| 13.39001 | 0.106 |
| 13.40001 | 0.132 |
| 13.41001 | 0.202 |
| 13.42001 | 0.298 |
| 13.43001 | 0.394 |
| 13.44001 | 0.46 |
| 13.45001 | 0.472 |
| 13.46001 | 0.428 |
| 13.47001 | 0.339 |
| 13.48001 | 0.234 |
| 13.49001 | 0.145 |
| 13.50001 | 0.098 |
| 13.51001 | 0.103 |
| 13.52001 | 0.152 |
| 13.53001 | 0.224 |
| 13.54001 | 0.294 |
| 13.55001 | 0.346 |
| 13.56001 | 0.373 |
| 13.57001 | 0.382 |
| 13.58001 | 0.383 |
| 13.59001 | 0.388 |
| 13.60001 | 0.396 |
| 13.61001 | 0.401 |
| 13.62001 | 0.387 |
| 13.63001 | 0.347 |
| 13.64001 | 0.283 |
| 13.65001 | 0.21 |
| 13.66001 | 0.153 |
| 13.67001 | 0.137 |
| 13.68001 | 0.174 |
| 13.69001 | 0.256 |
| 13.70001 | 0.358 |
| 13.71001 | 0.443 |
| 13.72001 | 0.481 |
| 13.73001 | 0.458 |
| 13.74001 | 0.383 |
| 13.75001 | 0.286 |
| 13.76001 | 0.203 |
| 13.77001 | 0.163 |
| 13.78001 | 0.176 |
| 13.79001 | 0.23 |
| 13.80001 | 0.295 |
| 13.81001 | 0.342 |
| 13.82001 | 0.351 |
| 13.83001 | 0.322 |
| 13.84001 | 0.274 |
| 13.85001 | 0.235 |
| 13.86001 | 0.227 |
| 13.87001 | 0.256 |
| 13.88001 | 0.312 |
| 13.89001 | 0.367 |
| 13.90001 | 0.395 |
| 13.91001 | 0.383 |
| 13.92001 | 0.333 |
| 13.93001 | 0.267 |
| 13.94001 | 0.213 |
| 13.95001 | 0.191 |
| 13.96001 | 0.209 |
| 13.97001 | 0.251 |
| 13.98001 | 0.295 |
| 13.99001 | 0.316 |
| 14.00001 | 0.304 |
| 14.01001 | 0.265 |
| 14.02001 | 0.222 |
| 14.03001 | 0.2 |
| 14.04001 | 0.217 |
| 14.05001 | 0.273 |
| 14.06001 | 0.348 |
| 14.07001 | 0.413 |
| 14.08001 | 0.442 |
| 14.09001 | 0.423 |
| 14.10001 | 0.362 |
| 14.11001 | 0.285 |
| 14.12001 | 0.22 |
| 14.13001 | 0.189 |
| 14.14001 | 0.2 |
| 14.15001 | 0.242 |
| 14.16001 | 0.293 |
| 14.17001 | 0.332 |
| 14.18001 | 0.346 |
| 14.19001 | 0.334 |
| 14.20001 | 0.308 |
| 14.21001 | 0.281 |
| 14.22001 | 0.264 |
| 14.23001 | 0.259 |
| 14.24001 | 0.259 |
| 14.25001 | 0.257 |
| 14.26001 | 0.248 |
| 14.27001 | 0.236 |
| 14.28001 | 0.23 |
| 14.29001 | 0.241 |
| 14.30001 | 0.274 |
| 14.31001 | 0.324 |
| 14.32001 | 0.376 |
| 14.33001 | 0.409 |
| 14.34001 | 0.408 |
| 14.35001 | 0.368 |
| 14.36001 | 0.3 |
| 14.37001 | 0.226 |
| 14.38001 | 0.169 |
| 14.39001 | 0.149 |
| 14.40001 | 0.171 |
| 14.41001 | 0.227 |
| 14.42001 | 0.297 |
| 14.43001 | 0.36 |
| 14.44001 | 0.399 |
| 14.45001 | 0.404 |
| 14.46001 | 0.378 |
| 14.47001 | 0.331 |
| 14.48001 | 0.277 |
| 14.49001 | 0.229 |
| 14.50001 | 0.197 |
| 14.51001 | 0.187 |
| 14.52001 | 0.199 |
| 14.53001 | 0.229 |
| 14.54001 | 0.273 |
| 14.55001 | 0.322 |
| 14.56001 | 0.367 |
| 14.57001 | 0.399 |
| 14.58001 | 0.413 |
| 14.59001 | 0.407 |
| 14.60001 | 0.386 |
| 14.61001 | 0.355 |
| 14.62001 | 0.324 |
| 14.63001 | 0.298 |
| 14.64001 | 0.281 |
| 14.65001 | 0.272 |
| 14.66001 | 0.27 |
| 14.67001 | 0.274 |
| 14.68001 | 0.282 |
| 14.69001 | 0.293 |
| 14.70001 | 0.308 |
| 14.71001 | 0.321 |
| 14.72001 | 0.327 |
| 14.73001 | 0.32 |
| 14.74001 | 0.297 |
| 14.75001 | 0.26 |
| 14.76001 | 0.219 |
| 14.77001 | 0.188 |
| 14.78001 | 0.182 |
| 14.79001 | 0.206 |
| 14.80001 | 0.258 |
| 14.81001 | 0.323 |
| 14.82001 | 0.38 |
| 14.83001 | 0.412 |
| 14.84001 | 0.408 |
| 14.85001 | 0.373 |
| 14.86001 | 0.32 |
| 14.87001 | 0.271 |
| 14.88001 | 0.242 |
| 14.89001 | 0.242 |
| 14.90001 | 0.265 |
| 14.91001 | 0.3 |
| 14.92001 | 0.33 |
| 14.93001 | 0.345 |
| 14.94001 | 0.34 |
| 14.95001 | 0.322 |
| 14.96001 | 0.3 |
| 14.97001 | 0.284 |
| 14.98001 | 0.277 |
| 14.99001 | 0.277 |
| 15.00001 | 0.278 |
| 15.01001 | 0.276 |
| 15.02001 | 0.269 |
| 15.03001 | 0.262 |
| 15.04001 | 0.261 |
| 15.05001 | 0.271 |
| 15.06001 | 0.292 |
| 15.07001 | 0.314 |
| 15.08001 | 0.328 |
| 15.09001 | 0.324 |
| 15.10001 | 0.297 |
| 15.11001 | 0.255 |
| 15.12001 | 0.211 |
| 15.13001 | 0.183 |
| 15.14001 | 0.181 |
| 15.15001 | 0.21 |
| 15.16001 | 0.26 |
| 15.17001 | 0.318 |
| 15.18001 | 0.364 |
| 15.19001 | 0.387 |
| 15.20001 | 0.383 |
| 15.21001 | 0.358 |
| 15.22001 | 0.322 |
| 15.23001 | 0.288 |
| 15.24001 | 0.262 |
| 15.25001 | 0.248 |
| 15.26001 | 0.241 |
| 15.27001 | 0.237 |
| 15.28001 | 0.234 |
| 15.29001 | 0.234 |
| 15.30001 | 0.241 |
| 15.31001 | 0.262 |
| 15.32001 | 0.298 |
| 15.33001 | 0.345 |
| 15.34001 | 0.392 |
| 15.35001 | 0.427 |
| 15.36001 | 0.44 |
| 15.37001 | 0.425 |
| 15.38001 | 0.386 |
| 15.39001 | 0.334 |
| 15.40001 | 0.282 |
| 15.41001 | 0.24 |
| 15.42001 | 0.214 |
| 15.43001 | 0.205 |
| 15.44001 | 0.205 |
| 15.45001 | 0.208 |
| 15.46001 | 0.209 |
| 15.47001 | 0.209 |
| 15.48001 | 0.211 |
| 15.49001 | 0.223 |
| 15.50001 | 0.248 |
| 15.51001 | 0.285 |
| 15.52001 | 0.327 |
| 15.53001 | 0.362 |
| 15.54001 | 0.38 |
| 15.55001 | 0.373 |
| 15.56001 | 0.343 |
| 15.57001 | 0.298 |
| 15.58001 | 0.252 |
| 15.59001 | 0.22 |
| 15.60001 | 0.21 |
| 15.61001 | 0.224 |
| 15.62001 | 0.256 |
| 15.63001 | 0.295 |
| 15.64001 | 0.33 |
| 15.65001 | 0.351 |
| 15.66001 | 0.356 |
| 15.67001 | 0.348 |
| 15.68001 | 0.336 |
| 15.69001 | 0.326 |
| 15.70001 | 0.323 |
| 15.71001 | 0.326 |
| 15.72001 | 0.331 |
| 15.73001 | 0.332 |
| 15.74001 | 0.326 |
| 15.75001 | 0.313 |
| 15.76001 | 0.296 |
| 15.77001 | 0.28 |
| 15.78001 | 0.272 |
| 15.79001 | 0.275 |
| 15.80001 | 0.288 |
| 15.81001 | 0.304 |
| 15.82001 | 0.318 |
| 15.83001 | 0.32 |
| 15.84001 | 0.31 |
| 15.85001 | 0.288 |
| 15.86001 | 0.261 |
| 15.87001 | 0.238 |
| 15.88001 | 0.224 |
| 15.89001 | 0.226 |
| 15.90001 | 0.242 |
| 15.91001 | 0.265 |
| 15.92001 | 0.289 |
| 15.93001 | 0.304 |
| 15.94001 | 0.308 |
| 15.95001 | 0.3 |
| 15.96001 | 0.288 |
| 15.97001 | 0.277 |
| 15.98001 | 0.274 |
| 15.99001 | 0.281 |
| 16.00001 | 0.296 |
| 16.01001 | 0.311 |
| 16.02001 | 0.318 |
| 16.03001 | 0.313 |
| 16.04001 | 0.296 |
| 16.05001 | 0.272 |
| 16.06001 | 0.251 |
| 16.07001 | 0.243 |
| 16.08001 | 0.25 |
| 16.09001 | 0.27 |
| 16.10001 | 0.294 |
| 16.11001 | 0.31 |
| 16.12001 | 0.307 |
| 16.13001 | 0.282 |
| 16.14001 | 0.243 |
| 16.15001 | 0.202 |
| 16.16001 | 0.175 |
| 16.17001 | 0.173 |
| 16.18001 | 0.2 |
| 16.19001 | 0.249 |
| 16.20001 | 0.306 |
| 16.21001 | 0.354 |
| 16.22001 | 0.382 |
| 16.23001 | 0.386 |
| 16.24001 | 0.371 |
| 16.25001 | 0.348 |
| 16.26001 | 0.329 |
| 16.27001 | 0.322 |
| 16.28001 | 0.329 |
| 16.29001 | 0.344 |
| 16.30001 | 0.359 |
| 16.31001 | 0.366 |
| 16.32001 | 0.361 |
| 16.33001 | 0.345 |
| 16.34001 | 0.323 |
| 16.35001 | 0.302 |
| 16.36001 | 0.287 |
| 16.37001 | 0.279 |
| 16.38001 | 0.278 |
| 16.39001 | 0.28 |
| 16.40001 | 0.284 |
| 16.41001 | 0.288 |
| 16.42001 | 0.295 |
| 16.43001 | 0.304 |
| 16.44001 | 0.316 |
| 16.45001 | 0.33 |
| 16.46001 | 0.341 |
| 16.47001 | 0.346 |
| 16.48001 | 0.343 |
| 16.49001 | 0.333 |
| 16.50001 | 0.32 |
| 16.51001 | 0.309 |
| 16.52001 | 0.305 |
| 16.53001 | 0.309 |
| 16.54001 | 0.319 |
| 16.55001 | 0.33 |
| 16.56001 | 0.338 |
| 16.57001 | 0.336 |
| 16.58001 | 0.325 |
| 16.59001 | 0.308 |
| 16.60001 | 0.29 |
| 16.61001 | 0.278 |
| 16.62001 | 0.275 |
| 16.63001 | 0.282 |
| 16.64001 | 0.297 |
| 16.65001 | 0.314 |
| 16.66001 | 0.327 |
| 16.67001 | 0.332 |
| 16.68001 | 0.327 |
| 16.69001 | 0.315 |
| 16.70001 | 0.298 |
| 16.71001 | 0.282 |
| 16.72001 | 0.271 |
| 16.73001 | 0.268 |
| 16.74001 | 0.273 |
| 16.75001 | 0.286 |
| 16.76001 | 0.304 |
| 16.77001 | 0.324 |
| 16.78001 | 0.342 |
| 16.79001 | 0.355 |
| 16.80001 | 0.362 |
| 16.81001 | 0.359 |
| 16.82001 | 0.346 |
| 16.83001 | 0.326 |
| 16.84001 | 0.3 |
| 16.85001 | 0.271 |
| 16.86001 | 0.245 |
| 16.87001 | 0.227 |
| 16.88001 | 0.219 |
| 16.89001 | 0.225 |
| 16.90001 | 0.242 |
| 16.91001 | 0.27 |
| 16.92001 | 0.303 |
| 16.93001 | 0.337 |
| 16.94001 | 0.366 |
| 16.95001 | 0.386 |
| 16.96001 | 0.394 |
| 16.97001 | 0.387 |
| 16.98001 | 0.366 |
| 16.99001 | 0.334 |
| 17.00001 | 0.296 |
| 17.01001 | 0.257 |
| 17.02001 | 0.226 |
| 17.03001 | 0.208 |
| 17.04001 | 0.208 |
| 17.05001 | 0.225 |
| 17.06001 | 0.255 |
| 17.07001 | 0.29 |
| 17.08001 | 0.323 |
| 17.09001 | 0.346 |
| 17.10001 | 0.355 |
| 17.11001 | 0.352 |
| 17.12001 | 0.339 |
| 17.13001 | 0.323 |
| 17.14001 | 0.308 |
| 17.15001 | 0.298 |
| 17.16001 | 0.293 |
| 17.17001 | 0.291 |
| 17.18001 | 0.289 |
| 17.19001 | 0.286 |
| 17.20001 | 0.283 |
| 17.21001 | 0.28 |
| 17.22001 | 0.28 |
| 17.23001 | 0.284 |
| 17.24001 | 0.291 |
| 17.25001 | 0.301 |
| 17.26001 | 0.311 |
| 17.27001 | 0.319 |
| 17.28001 | 0.324 |
| 17.29001 | 0.326 |
| 17.30001 | 0.327 |
| 17.31001 | 0.326 |
| 17.32001 | 0.324 |
| 17.33001 | 0.32 |
| 17.34001 | 0.312 |
| 17.35001 | 0.301 |
| 17.36001 | 0.289 |
| 17.37001 | 0.276 |
| 17.38001 | 0.266 |
| 17.39001 | 0.26 |
| 17.40001 | 0.261 |
| 17.41001 | 0.266 |
| 17.42001 | 0.276 |
| 17.43001 | 0.289 |
| 17.44001 | 0.302 |
| 17.45001 | 0.316 |
| 17.46001 | 0.329 |
| 17.47001 | 0.34 |
| 17.48001 | 0.344 |
| 17.49001 | 0.341 |
| 17.50001 | 0.326 |
| 17.51001 | 0.3 |
| 17.52001 | 0.266 |
| 17.53001 | 0.232 |
| 17.54001 | 0.206 |
| 17.55001 | 0.197 |
| 17.56001 | 0.21 |
| 17.57001 | 0.241 |
| 17.58001 | 0.285 |
| 17.59001 | 0.329 |
| 17.60001 | 0.363 |
| 17.61001 | 0.377 |
| 17.62001 | 0.37 |
| 17.63001 | 0.345 |
| 17.64001 | 0.313 |
| 17.65001 | 0.282 |
| 17.66001 | 0.261 |
| 17.67001 | 0.252 |
| 17.68001 | 0.254 |
| 17.69001 | 0.262 |
| 17.70001 | 0.269 |
| 17.71001 | 0.273 |
| 17.72001 | 0.275 |
| 17.73001 | 0.277 |
| 17.74001 | 0.284 |
| 17.75001 | 0.298 |
| 17.76001 | 0.318 |
| 17.77001 | 0.337 |
| 17.78001 | 0.349 |
| 17.79001 | 0.346 |
| 17.80001 | 0.325 |
| 17.81001 | 0.292 |
| 17.82001 | 0.254 |
| 17.83001 | 0.223 |
| 17.84001 | 0.21 |
| 17.85001 | 0.217 |
| 17.86001 | 0.242 |
| 17.87001 | 0.277 |
| 17.88001 | 0.308 |
| 17.89001 | 0.326 |
| 17.90001 | 0.326 |
| 17.91001 | 0.31 |
| 17.92001 | 0.287 |
| 17.93001 | 0.268 |
| 17.94001 | 0.259 |
| 17.95001 | 0.264 |
| 17.96001 | 0.279 |
| 17.97001 | 0.296 |
| 17.98001 | 0.308 |
| 17.99001 | 0.309 |
| 18.00001 | 0.3 |
| 18.01001 | 0.287 |
| 18.02001 | 0.276 |
| 18.03001 | 0.273 |
| 18.04001 | 0.278 |
| 18.05001 | 0.29 |
| 18.06001 | 0.3 |
| 18.07001 | 0.302 |
| 18.08001 | 0.294 |
| 18.09001 | 0.276 |
| 18.10001 | 0.254 |
| 18.11001 | 0.236 |
| 18.12001 | 0.228 |
| 18.13001 | 0.234 |
| 18.14001 | 0.251 |
| 18.15001 | 0.275 |
| 18.16001 | 0.3 |
| 18.17001 | 0.319 |
| 18.18001 | 0.33 |
| 18.19001 | 0.333 |
| 18.20001 | 0.33 |
| 18.21001 | 0.323 |
| 18.22001 | 0.315 |
| 18.23001 | 0.307 |
| 18.24001 | 0.297 |
| 18.25001 | 0.285 |
| 18.26001 | 0.271 |
| 18.27001 | 0.253 |
| 18.28001 | 0.236 |
| 18.29001 | 0.223 |
| 18.30001 | 0.218 |
| 18.31001 | 0.224 |
| 18.32001 | 0.244 |
| 18.33001 | 0.276 |
| 18.34001 | 0.313 |
| 18.35001 | 0.347 |
| 18.36001 | 0.37 |
| 18.37001 | 0.374 |
| 18.38001 | 0.358 |
| 18.39001 | 0.325 |
| 18.40001 | 0.284 |
| 18.41001 | 0.246 |
| 18.42001 | 0.223 |
| 18.43001 | 0.22 |
| 18.44001 | 0.236 |
| 18.45001 | 0.265 |
| 18.46001 | 0.297 |
| 18.47001 | 0.322 |
| 18.48001 | 0.333 |
| 18.49001 | 0.33 |
| 18.50001 | 0.319 |
| 18.51001 | 0.306 |
| 18.52001 | 0.296 |
| 18.53001 | 0.294 |
| 18.54001 | 0.296 |
| 18.55001 | 0.298 |
| 18.56001 | 0.295 |
| 18.57001 | 0.286 |
| 18.58001 | 0.272 |
| 18.59001 | 0.26 |
| 18.60001 | 0.256 |
| 18.61001 | 0.265 |
| 18.62001 | 0.285 |
| 18.63001 | 0.313 |
| 18.64001 | 0.338 |
| 18.65001 | 0.352 |
| 18.66001 | 0.351 |
| 18.67001 | 0.334 |
| 18.68001 | 0.307 |
| 18.69001 | 0.277 |
| 18.70001 | 0.255 |
| 18.71001 | 0.245 |
| 18.72001 | 0.251 |
| 18.73001 | 0.268 |
| 18.74001 | 0.291 |
| 18.75001 | 0.312 |
| 18.76001 | 0.325 |
| 18.77001 | 0.327 |
| 18.78001 | 0.32 |
| 18.79001 | 0.309 |
| 18.80001 | 0.3 |
| 18.81001 | 0.296 |
| 18.82001 | 0.301 |
| 18.83001 | 0.315 |
| 18.84001 | 0.332 |
| 18.85001 | 0.348 |
| 18.86001 | 0.356 |
| 18.87001 | 0.353 |
| 18.88001 | 0.338 |
| 18.89001 | 0.315 |
| 18.90001 | 0.288 |
| 18.91001 | 0.264 |
| 18.92001 | 0.25 |
| 18.93001 | 0.248 |
| 18.94001 | 0.26 |
| 18.95001 | 0.286 |
| 18.96001 | 0.32 |
| 18.97001 | 0.355 |
| 18.98001 | 0.384 |
| 18.99001 | 0.398 |
| 19.00001 | 0.393 |
| 19.01001 | 0.366 |
| 19.02001 | 0.319 |
| 19.03001 | 0.261 |
| 19.04001 | 0.204 |
| 19.05001 | 0.16 |
| 19.06001 | 0.141 |
| 19.07001 | 0.154 |
| 19.08001 | 0.2 |
| 19.09001 | 0.272 |
| 19.10001 | 0.358 |
| 19.11001 | 0.444 |
| 19.12001 | 0.514 |
| 19.13001 | 0.554 |
| 19.14001 | 0.554 |
| 19.15001 | 0.509 |
| 19.16001 | 0.424 |
| 19.17001 | 0.31 |
| 19.18001 | 0.186 |
| 19.19001 | 0.079 |
| 19.20001 | 0.014 |
| 19.21001 | 0.011 |
| 19.22001 | 0.075 |
| 19.23001 | 0.195 |
| 19.24001 | 0.341 |
| 19.25001 | 0.475 |
| 19.26001 | 0.561 |
| 19.27001 | 0.575 |
| 19.28001 | 0.518 |
| 19.29001 | 0.412 |
| 19.30001 | 0.294 |
| 19.31001 | 0.206 |
| 19.32001 | 0.175 |
| 19.33001 | 0.208 |
| 19.34001 | 0.288 |
| 19.35001 | 0.383 |
| 19.36001 | 0.455 |
| 19.37001 | 0.48 |
| 19.38001 | 0.448 |
| 19.39001 | 0.374 |
| 19.40001 | 0.282 |
| 19.41001 | 0.2 |
| 19.42001 | 0.152 |
| 19.43001 | 0.147 |
| 19.44001 | 0.181 |
| 19.45001 | 0.242 |
| 19.46001 | 0.312 |
| 19.47001 | 0.376 |
| 19.48001 | 0.423 |
| 19.49001 | 0.44 |
| 19.50001 | 0.422 |
| 19.51001 | 0.366 |
| 19.52001 | 0.278 |
| 19.53001 | 0.173 |
| 19.54001 | 0.076 |
| 19.55001 | 0.015 |
| 19.56001 | 0.017 |
| 19.57001 | 0.093 |
| 19.58001 | 0.234 |
| 19.59001 | 0.412 |
| 19.60001 | 0.582 |
| 19.61001 | 0.702 |
| 19.62001 | 0.74 |
| 19.63001 | 0.689 |
| 19.64001 | 0.564 |
| 19.65001 | 0.399 |
| 19.66001 | 0.233 |
| 19.67001 | 0.097 |
| 19.68001 | 0.009 |
| 19.69001 | -0.026 |
| 19.70001 | -0.018 |
| 19.71001 | 0.024 |
| 19.72001 | 0.091 |
| 19.73001 | 0.178 |
| 19.74001 | 0.28 |
| 19.75001 | 0.389 |
| 19.76001 | 0.492 |
| 19.77001 | 0.569 |
| 19.78001 | 0.604 |
| 19.79001 | 0.585 |
| 19.80001 | 0.516 |
| 19.81001 | 0.411 |
| 19.82001 | 0.293 |
| 19.83001 | 0.187 |
| 19.84001 | 0.11 |
| 19.85001 | 0.072 |
| 19.86001 | 0.071 |
| 19.87001 | 0.1 |
| 19.88001 | 0.152 |
| 19.89001 | 0.22 |
| 19.90001 | 0.299 |
| 19.91001 | 0.382 |
| 19.92001 | 0.456 |
| 19.93001 | 0.505 |
| 19.94001 | 0.513 |
| 19.95001 | 0.468 |
| 19.96001 | 0.376 |
| 19.97001 | 0.257 |
| 19.98001 | 0.141 |
| 19.99001 | 0.063 |
| 20.00001 | 0.047 |
| 20.01001 | 0.099 |
| 20.02001 | 0.201 |
| 20.03001 | 0.323 |
| 20.04001 | 0.427 |
| 20.05001 | 0.485 |
| 20.06001 | 0.487 |
| 20.07001 | 0.442 |
| 20.08001 | 0.372 |
| 20.09001 | 0.303 |
| 20.10001 | 0.254 |
| 20.11001 | 0.232 |
| 20.12001 | 0.23 |
| 20.13001 | 0.235 |
| 20.14001 | 0.233 |
| 20.15001 | 0.222 |
| 20.16001 | 0.208 |
| 20.17001 | 0.203 |
| 20.18001 | 0.218 |
| 20.19001 | 0.258 |
| 20.20001 | 0.317 |
| 20.21001 | 0.378 |
| 20.22001 | 0.423 |
| 20.23001 | 0.436 |
| 20.24001 | 0.412 |
| 20.25001 | 0.356 |
| 20.26001 | 0.286 |
| 20.27001 | 0.222 |
| 20.28001 | 0.18 |
| 20.29001 | 0.17 |
| 20.30001 | 0.191 |
| 20.31001 | 0.233 |
| 20.32001 | 0.283 |
| 20.33001 | 0.327 |
| 20.34001 | 0.357 |
| 20.35001 | 0.369 |
| 20.36001 | 0.366 |
| 20.37001 | 0.352 |
| 20.38001 | 0.334 |
| 20.39001 | 0.313 |
| 20.40001 | 0.293 |
| 20.41001 | 0.271 |
| 20.42001 | 0.249 |
| 20.43001 | 0.226 |
| 20.44001 | 0.207 |
| 20.45001 | 0.196 |
| 20.46001 | 0.199 |
| 20.47001 | 0.22 |
| 20.48001 | 0.259 |
| 20.49001 | 0.31 |
| 20.50001 | 0.363 |
| 20.51001 | 0.407 |
| 20.52001 | 0.429 |
| 20.53001 | 0.422 |
| 20.54001 | 0.387 |
| 20.55001 | 0.33 |
| 20.56001 | 0.264 |
| 20.57001 | 0.206 |
| 20.58001 | 0.167 |
| 20.59001 | 0.157 |
| 20.60001 | 0.175 |
| 20.61001 | 0.216 |
| 20.62001 | 0.268 |
| 20.63001 | 0.32 |
| 20.64001 | 0.359 |
| 20.65001 | 0.38 |
| 20.66001 | 0.38 |
| 20.67001 | 0.361 |
| 20.68001 | 0.329 |
| 20.69001 | 0.29 |
| 20.70001 | 0.252 |
| 20.71001 | 0.224 |
| 20.72001 | 0.211 |
| 20.73001 | 0.217 |
| 20.74001 | 0.241 |
| 20.75001 | 0.278 |
| 20.76001 | 0.32 |
| 20.77001 | 0.354 |
| 20.78001 | 0.372 |
| 20.79001 | 0.371 |
| 20.80001 | 0.352 |
| 20.81001 | 0.325 |
| 20.82001 | 0.301 |
| 20.83001 | 0.292 |
| 20.84001 | 0.304 |
| 20.85001 | 0.336 |
| 20.86001 | 0.378 |
| 20.87001 | 0.415 |
| 20.88001 | 0.435 |
| 20.89001 | 0.428 |
| 20.90001 | 0.395 |
| 20.91001 | 0.342 |
| 20.92001 | 0.283 |
| 20.93001 | 0.232 |
| 20.94001 | 0.198 |
| 20.95001 | 0.185 |
| 20.96001 | 0.192 |
| 20.97001 | 0.213 |
| 20.98001 | 0.241 |
| 20.99001 | 0.27 |
| 21.00001 | 0.3 |
| 21.01001 | 0.328 |
| 21.02001 | 0.356 |
| 21.03001 | 0.378 |
| 21.04001 | 0.391 |
| 21.05001 | 0.386 |
| 21.06001 | 0.358 |
| 21.07001 | 0.306 |
| 21.08001 | 0.236 |
| 21.09001 | 0.16 |
| 21.10001 | 0.093 |
| 21.11001 | 0.048 |
| 21.12001 | 0.032 |
| 21.13001 | 0.046 |
| 21.14001 | 0.083 |
| 21.15001 | 0.133 |
| 21.16001 | 0.184 |
| 21.17001 | 0.228 |
| 21.18001 | 0.262 |
| 21.19001 | 0.29 |
| 21.20001 | 0.314 |
| 21.21001 | 0.338 |
| 21.22001 | 0.363 |
| 21.23001 | 0.386 |
| 21.24001 | 0.404 |
| 21.25001 | 0.413 |
| 21.26001 | 0.414 |
| 21.27001 | 0.412 |
| 21.28001 | 0.41 |
| 21.29001 | 0.413 |
| 21.30001 | 0.422 |
| 21.31001 | 0.43 |
| 21.32001 | 0.433 |
| 21.33001 | 0.421 |
| 21.34001 | 0.391 |
| 21.35001 | 0.347 |
| 21.36001 | 0.295 |
| 21.37001 | 0.248 |
| 21.38001 | 0.214 |
| 21.39001 | 0.199 |
| 21.40001 | 0.201 |
| 21.41001 | 0.213 |
| 21.42001 | 0.226 |
| 21.43001 | 0.235 |
| 21.44001 | 0.242 |
| 21.45001 | 0.253 |
| 21.46001 | 0.279 |
| 21.47001 | 0.327 |
| 21.48001 | 0.4 |
| 21.49001 | 0.489 |
| 21.50001 | 0.576 |
| 21.51001 | 0.642 |
| 21.52001 | 0.666 |
| 21.53001 | 0.638 |
| 21.54001 | 0.559 |
| 21.55001 | 0.444 |
| 21.56001 | 0.313 |
| 21.57001 | 0.189 |
| 21.58001 | 0.091 |
| 21.59001 | 0.028 |
| 21.60001 | 0 |
| 21.61001 | -0.003 |
| 21.62001 | 0.005 |
| 21.63001 | 0.012 |
| 21.64001 | 0.007 |
| 21.65001 | -0.011 |
| 21.66001 | -0.04 |
| 21.67001 | -0.069 |
| 21.68001 | -0.088 |
| 21.69001 | -0.085 |
| 21.70001 | -0.053 |
| 21.71001 | 0.011 |
| 21.72001 | 0.108 |
| 21.73001 | 0.231 |
| 21.74001 | 0.371 |
| 21.75001 | 0.515 |
| 21.76001 | 0.649 |
| 21.77001 | 0.756 |
| 21.78001 | 0.825 |
| 21.79001 | 0.848 |
| 21.80001 | 0.822 |
| 21.81001 | 0.756 |
| 21.82001 | 0.664 |
| 21.83001 | 0.566 |
| 21.84001 | 0.478 |
| 21.85001 | 0.41 |
| 21.86001 | 0.366 |
| 21.87001 | 0.332 |
| 21.88001 | 0.294 |
| 21.89001 | 0.234 |
| 21.90001 | 0.141 |
| 21.91001 | 0.021 |
| 21.92001 | -0.109 |
| 21.93001 | -0.218 |
| 21.94001 | -0.274 |
| 21.95001 | -0.251 |
| 21.96001 | -0.139 |
| 21.97001 | 0.051 |
| 21.98001 | 0.291 |
| 21.99001 | 0.537 |
| 22.00001 | 0.747 |
| 22.01001 | 0.882 |
| 22.02001 | 0.92 |
| 22.03001 | 0.86 |
| 22.04001 | 0.715 |
| 22.05001 | 0.519 |
| 22.06001 | 0.309 |
| 22.07001 | 0.126 |
| 22.08001 | 0.003 |
| 22.09001 | -0.041 |
| 22.10001 | -0.005 |
| 22.11001 | 0.09 |
| 22.12001 | 0.212 |
| 22.13001 | 0.32 |
| 22.14001 | 0.378 |
| 22.15001 | 0.365 |
| 22.16001 | 0.282 |
| 22.17001 | 0.155 |
| 22.18001 | 0.024 |
| 22.19001 | -0.065 |
| 22.20001 | -0.078 |
| 22.21001 | 0 |
| 22.22001 | 0.156 |
| 22.23001 | 0.353 |
| 22.24001 | 0.543 |
| 22.25001 | 0.677 |
| 22.26001 | 0.724 |
| 22.27001 | 0.675 |
| 22.28001 | 0.55 |
| 22.29001 | 0.387 |
| 22.30001 | 0.231 |
| 22.31001 | 0.125 |
| 22.32001 | 0.091 |
| 22.33001 | 0.129 |
| 22.34001 | 0.218 |
| 22.35001 | 0.321 |
| 22.36001 | 0.398 |
| 22.37001 | 0.421 |
| 22.38001 | 0.379 |
| 22.39001 | 0.288 |
| 22.40001 | 0.18 |
| 22.41001 | 0.098 |
| 22.42001 | 0.08 |
| 22.43001 | 0.147 |
| 22.44001 | 0.293 |
| 22.45001 | 0.49 |
| 22.46001 | 0.69 |
| 22.47001 | 0.845 |
| 22.48001 | 0.914 |
| 22.49001 | 0.879 |
| 22.50001 | 0.748 |
| 22.51001 | 0.549 |
| 22.52001 | 0.325 |
| 22.53001 | 0.117 |
| 22.54001 | -0.041 |
| 22.55001 | -0.131 |
| 22.56001 | -0.155 |
| 22.57001 | -0.126 |
| 22.58001 | -0.067 |
| 22.59001 | -0.003 |
| 22.60001 | 0.047 |
| 22.61001 | 0.075 |
| 22.62001 | 0.087 |
| 22.63001 | 0.099 |
| 22.64001 | 0.135 |
| 22.65001 | 0.215 |
| 22.66001 | 0.347 |
| 22.67001 | 0.518 |
| 22.68001 | 0.696 |
| 22.69001 | 0.832 |
| 22.70001 | 0.876 |
| 22.71001 | 0.793 |
| 22.72001 | 0.584 |
| 22.73001 | 0.285 |
| 22.74001 | -0.031 |
| 22.75001 | -0.277 |
| 22.76001 | -0.378 |
| 22.77001 | -0.293 |
| 22.78001 | -0.035 |
| 22.79001 | 0.33 |
| 22.80001 | 0.704 |
| 22.81001 | 0.982 |
| 22.82001 | 1.087 |
| 22.83001 | 0.994 |
| 22.84001 | 0.736 |
| 22.85001 | 0.396 |
| 22.86001 | 0.078 |
| 22.87001 | -0.127 |
| 22.88001 | -0.169 |
| 22.89001 | -0.057 |
| 22.90001 | 0.151 |
| 22.91001 | 0.364 |
| 22.92001 | 0.496 |
| 22.93001 | 0.494 |
| 22.94001 | 0.361 |
| 22.95001 | 0.15 |
| 22.96001 | -0.051 |
| 22.97001 | -0.153 |
| 22.98001 | -0.102 |
| 22.99001 | 0.1 |
| 23.00001 | 0.394 |
| 23.01001 | 0.682 |
| 23.02001 | 0.867 |
| 23.03001 | 0.884 |
| 23.04001 | 0.73 |
| 23.05001 | 0.464 |
| 23.06001 | 0.185 |
| 23.07001 | -0.003 |
| 23.08001 | -0.032 |
| 23.09001 | 0.104 |
| 23.10001 | 0.348 |
| 23.11001 | 0.604 |
| 23.12001 | 0.768 |
| 23.13001 | 0.774 |
| 23.14001 | 0.615 |
| 23.15001 | 0.343 |
| 23.16001 | 0.052 |
| 23.17001 | -0.159 |
| 23.18001 | -0.219 |
| 23.19001 | -0.111 |
| 23.20001 | 0.128 |
| 23.21001 | 0.422 |
| 23.22001 | 0.685 |
| 23.23001 | 0.846 |
| 23.24001 | 0.873 |
| 23.25001 | 0.779 |
| 23.26001 | 0.612 |
| 23.27001 | 0.434 |
| 23.28001 | 0.304 |
| 23.29001 | 0.253 |
| 23.30001 | 0.279 |
| 23.31001 | 0.349 |
| 23.32001 | 0.411 |
| 23.33001 | 0.416 |
| 23.34001 | 0.34 |
| 23.35001 | 0.193 |
| 23.36001 | 0.025 |
| 23.37001 | -0.093 |
| 23.38001 | -0.091 |
| 23.39001 | 0.071 |
| 23.40001 | 0.381 |
| 23.41001 | 0.775 |
| 23.42001 | 1.15 |
| 23.43001 | 1.399 |
| 23.44001 | 1.446 |
| 23.45001 | 1.275 |
| 23.46001 | 0.93 |
| 23.47001 | 0.509 |
| 23.48001 | 0.124 |
| 23.49001 | -0.133 |
| 23.50001 | -0.211 |
| 23.51001 | -0.109 |
| 23.52001 | 0.134 |
| 23.53001 | 0.467 |
| 23.54001 | 0.838 |
| 23.55001 | 1.207 |
| 23.56001 | 1.54 |
| 23.57001 | 1.8 |
| 23.58001 | 1.943 |
| 23.59001 | 1.934 |
| 23.60001 | 1.762 |
| 23.61001 | 1.47 |
| 23.62001 | 1.166 |
| 23.63001 | 1.002 |
| 23.64001 | 1.132 |
| 23.65001 | 1.649 |
| 23.66001 | 2.534 |
| 23.67001 | 3.63 |
| 23.68001 | 4.669 |
| 23.69001 | 5.339 |
| 23.70001 | 5.384 |
| 23.71001 | 4.683 |
| 23.72001 | 3.31 |
| 23.73001 | 1.52 |
| 23.74001 | -0.311 |
| 23.75001 | -1.788 |
| 23.76001 | -2.601 |
| 23.77001 | -2.605 |
| 23.78001 | -1.853 |
| 23.79001 | -0.573 |
| 23.80001 | 0.898 |
| 23.81001 | 2.198 |
| 23.82001 | 3.025 |
| 23.83001 | 3.204 |
| 23.84001 | 2.708 |
| 23.85001 | 1.663 |
| 23.86001 | 0.299 |
| 23.87001 | -1.101 |
| 23.88001 | -2.265 |
| 23.89001 | -2.994 |
| 23.90001 | -3.192 |
| 23.91001 | -2.889 |
| 23.92001 | -2.223 |
| 23.93001 | -1.408 |
| 23.94001 | -0.687 |
| 23.95001 | -0.279 |
| 23.96001 | -0.34 |
| 23.97001 | -0.926 |
| 23.98001 | -1.981 |
| 23.99001 | -3.342 |
| 24.00001 | -4.763 |
| 24.01001 | -5.962 |
| 24.02001 | -6.681 |
| 24.03001 | -6.752 |
| 24.04001 | -6.15 |
| 24.05001 | -5.019 |
| 24.06001 | -3.638 |
| 24.07001 | -2.352 |
| 24.08001 | -1.457 |
| 24.09001 | -1.092 |
| 24.10001 | -1.167 |
| 24.11001 | -1.376 |
| 24.12001 | -1.282 |
| 24.13001 | -0.472 |
| 24.14001 | 1.281 |
| 24.15001 | 3.902 |
| 24.16001 | 6.998 |
| 24.17001 | 9.956 |
| 24.18001 | 12.12 |
| 24.19001 | 13.01 |
| 24.20001 | 12.42 |
| 24.21001 | 10.56 |
| 24.22001 | 7.897 |
| 24.23001 | 5.033 |
| 24.24001 | 2.524 |
| 24.25001 | 0.718 |
| 24.26001 | -0.294 |
| 24.27001 | -0.645 |
| 24.28001 | -0.583 |
| 24.29001 | -0.354 |
| 24.30001 | -0.119 |
| 24.31001 | 0.065 |
| 24.32001 | 0.211 |
| 24.33001 | 0.336 |
| 24.34001 | 0.417 |
| 24.35001 | 0.376 |
| 24.36001 | 0.12 |
| 24.37001 | -0.404 |
| 24.38001 | -1.163 |
| 24.39001 | -2.03 |
| 24.40001 | -2.814 |
| 24.41001 | -3.33 |
| 24.42001 | -3.463 |
| 24.43001 | -3.207 |
| 24.44001 | -2.677 |
| 24.45001 | -2.067 |
| 24.46001 | -1.606 |
| 24.47001 | -1.506 |
| 24.48001 | -1.929 |
| 24.49001 | -2.973 |
| 24.50001 | -4.661 |
| 24.51001 | -6.929 |
| 24.52001 | -9.621 |
| 24.53001 | -12.47 |
| 24.54001 | -15.13 |
| 24.55001 | -17.18 |
| 24.56001 | -18.27 |
| 24.57001 | -18.14 |
| 24.58001 | -16.74 |
| 24.59001 | -14.23 |
| 24.60001 | -10.99 |
| 24.61001 | -7.466 |
| 24.62001 | -4.115 |
| 24.63001 | -1.273 |
| 24.64001 | 0.895 |
| 24.65001 | 2.39 |
| 24.66001 | 3.325 |
| 24.67001 | 3.849 |
| 24.68001 | 4.083 |
| 24.69001 | 4.089 |
| 24.70001 | 3.887 |
| 24.71001 | 3.496 |
| 24.72001 | 2.971 |
| 24.73001 | 2.421 |
| 24.74001 | 1.993 |
| 24.75001 | 1.817 |
| 24.76001 | 1.961 |
| 24.77001 | 2.389 |
| 24.78001 | 2.973 |
| 24.79001 | 3.524 |
| 24.80001 | 3.861 |
| 24.81001 | 3.868 |
| 24.82001 | 3.524 |
| 24.83001 | 2.902 |
| 24.84001 | 2.134 |
| 24.85001 | 1.354 |
| 24.86001 | 0.654 |
| 24.87001 | 0.065 |
| 24.88001 | -0.44 |
| 24.89001 | -0.913 |
| 24.90001 | -1.396 |
| 24.91001 | -1.891 |
| 24.92001 | -2.356 |
| 24.93001 | -2.715 |
| 24.94001 | -2.887 |
| 24.95001 | -2.811 |
| 24.96001 | -2.461 |
| 24.97001 | -1.845 |
| 24.98001 | -0.99 |
| 24.99001 | 0.071 |
| 25.00001 | 1.317 |
| 25.01001 | 2.729 |
| 25.02001 | 4.277 |
| 25.03001 | 5.897 |
| 25.04001 | 7.482 |
| 25.05001 | 8.877 |
| 25.06001 | 9.903 |
| 25.07001 | 10.4 |
| 25.08001 | 10.26 |
| 25.09001 | 9.486 |
| 25.10001 | 8.175 |
| 25.11001 | 6.529 |
| 25.12001 | 4.808 |
| 25.13001 | 3.272 |
| 25.14001 | 2.133 |
| 25.15001 | 1.511 |
| 25.16001 | 1.416 |
| 25.17001 | 1.756 |
| 25.18001 | 2.37 |
| 25.19001 | 3.056 |
| 25.20001 | 3.624 |
| 25.21001 | 3.917 |
| 25.22001 | 3.839 |
| 25.23001 | 3.361 |
| 25.24001 | 2.522 |
| 25.25001 | 1.417 |
| 25.26001 | 0.191 |
| 25.27001 | -0.99 |
| 25.28001 | -1.953 |
| 25.29001 | -2.553 |
| 25.30001 | -2.695 |
| 25.31001 | -2.358 |
| 25.32001 | -1.603 |
| 25.33001 | -0.563 |
| 25.34001 | 0.583 |
| 25.35001 | 1.651 |
| 25.36001 | 2.494 |
| 25.37001 | 3.033 |
| 25.38001 | 3.274 |
| 25.39001 | 3.292 |
| 25.40001 | 3.197 |
| 25.41001 | 3.091 |
| 25.42001 | 3.024 |
| 25.43001 | 2.974 |
| 25.44001 | 2.857 |
| 25.45001 | 2.557 |
| 25.46001 | 1.978 |
| 25.47001 | 1.09 |
| 25.48001 | -0.047 |
| 25.49001 | -1.288 |
| 25.50001 | -2.441 |
| 25.51001 | -3.319 |
| 25.52001 | -3.798 |
| 25.53001 | -3.846 |
| 25.54001 | -3.53 |
| 25.55001 | -2.983 |
| 25.56001 | -2.361 |
| 25.57001 | -1.795 |
| 25.58001 | -1.363 |
| 25.59001 | -1.082 |
| 25.60001 | -0.931 |
| 25.61001 | -0.874 |
| 25.62001 | -0.889 |
| 25.63001 | -0.974 |
| 25.64001 | -1.138 |
| 25.65001 | -1.382 |
| 25.66001 | -1.678 |
| 25.67001 | -1.964 |
| 25.68001 | -2.154 |
| 25.69001 | -2.163 |
| 25.70001 | -1.939 |
| 25.71001 | -1.476 |
| 25.72001 | -0.825 |
| 25.73001 | -0.074 |
| 25.74001 | 0.677 |
| 25.75001 | 1.341 |
| 25.76001 | 1.865 |
| 25.77001 | 2.232 |
| 25.78001 | 2.455 |
| 25.79001 | 2.568 |
| 25.80001 | 2.616 |
| 25.81001 | 2.645 |
| 25.82001 | 2.707 |
| 25.83001 | 2.852 |
| 25.84001 | 3.118 |
| 25.85001 | 3.521 |
| 25.86001 | 4.037 |
| 25.87001 | 4.6 |
| 25.88001 | 5.105 |
| 25.89001 | 5.437 |
| 25.90001 | 5.494 |
| 25.91001 | 5.227 |
| 25.92001 | 4.649 |
| 25.93001 | 3.836 |
| 25.94001 | 2.903 |
| 25.95001 | 1.971 |
| 25.96001 | 1.135 |
| 25.97001 | 0.447 |
| 25.98001 | -0.087 |
| 25.99001 | -0.488 |
| 26.00001 | -0.783 |
| 26.01001 | -0.987 |
| 26.02001 | -1.101 |
| 26.03001 | -1.113 |
| 26.04001 | -1.017 |
| 26.05001 | -0.829 |
| 26.06001 | -0.586 |
| 26.07001 | -0.34 |
| 26.08001 | -0.146 |
| 26.09001 | -0.036 |
| 26.10001 | -0.013 |
| 26.11001 | -0.05 |
| 26.12001 | -0.101 |
| 26.13001 | -0.122 |
| 26.14001 | -0.084 |
| 26.15001 | 0.012 |
| 26.16001 | 0.144 |
| 26.17001 | 0.28 |
| 26.18001 | 0.391 |
| 26.19001 | 0.466 |
| 26.20001 | 0.514 |
| 26.21001 | 0.56 |
| 26.22001 | 0.631 |
| 26.23001 | 0.742 |
| 26.24001 | 0.889 |
| 26.25001 | 1.046 |
| 26.26001 | 1.174 |
| 26.27001 | 1.232 |
| 26.28001 | 1.19 |
| 26.29001 | 1.037 |
| 26.30001 | 0.783 |
| 26.31001 | 0.45 |
| 26.32001 | 0.069 |
| 26.33001 | -0.335 |
| 26.34001 | -0.743 |
| 26.35001 | -1.143 |
| 26.36001 | -1.524 |
| 26.37001 | -1.871 |
| 26.38001 | -2.158 |
| 26.39001 | -2.356 |
| 26.40001 | -2.436 |
| 26.41002 | -2.378 |
| 26.42001 | -2.184 |
| 26.43001 | -1.88 |
| 26.44001 | -1.505 |
| 26.45001 | -1.11 |
| 26.46001 | -0.733 |
| 26.47001 | -0.4 |
| 26.48001 | -0.113 |
| 26.49002 | 0.134 |
| 26.50001 | 0.353 |
| 26.51001 | 0.543 |
| 26.52001 | 0.689 |
| 26.53001 | 0.768 |
| 26.54001 | 0.761 |
| 26.55001 | 0.669 |
| 26.56001 | 0.521 |
| 26.57001 | 0.374 |
| 26.58002 | 0.292 |
| 26.59001 | 0.321 |
| 26.60001 | 0.465 |
| 26.61001 | 0.678 |
| 26.62001 | 0.867 |
| 26.63001 | 0.92 |
| 26.64001 | 0.745 |
| 26.65001 | 0.307 |
| 26.66002 | -0.355 |
| 26.67001 | -1.136 |
| 26.68001 | -1.888 |
| 26.69001 | -2.467 |
| 26.70001 | -2.774 |
| 26.71001 | -2.783 |
| 26.72001 | -2.54 |
| 26.73001 | -2.141 |
| 26.74002 | -1.699 |
| 26.75002 | -1.304 |
| 26.76001 | -0.998 |
| 26.77001 | -0.77 |
| 26.78001 | -0.573 |
| 26.79001 | -0.35 |
| 26.80001 | -0.063 |
| 26.81001 | 0.295 |
| 26.82001 | 0.693 |
| 26.83002 | 1.079 |
| 26.84001 | 1.396 |
| 26.85001 | 1.606 |
| 26.86001 | 1.698 |
| 26.87001 | 1.686 |
| 26.88001 | 1.607 |
| 26.89001 | 1.497 |
| 26.90001 | 1.39 |
| 26.91002 | 1.299 |
| 26.92002 | 1.228 |
| 26.93001 | 1.169 |
| 26.94001 | 1.114 |
| 26.95001 | 1.061 |
| 26.96001 | 1.018 |
| 26.97001 | 1.004 |
| 26.98001 | 1.045 |
| 26.99002 | 1.168 |
| 27.00002 | 1.394 |
| 27.01001 | 1.725 |
| 27.02001 | 2.145 |
| 27.03001 | 2.61 |
| 27.04001 | 3.054 |
| 27.05001 | 3.401 |
| 27.06001 | 3.578 |
| 27.07001 | 3.538 |
| 27.08002 | 3.27 |
| 27.09002 | 2.807 |
| 27.10001 | 2.213 |
| 27.11001 | 1.571 |
| 27.12001 | 0.957 |
| 27.13001 | 0.418 |
| 27.14001 | -0.032 |
| 27.15001 | -0.411 |
| 27.16002 | -0.75 |
| 27.17002 | -1.073 |
| 27.18001 | -1.381 |
| 27.19001 | -1.649 |
| 27.20001 | -1.833 |
| 27.21001 | -1.897 |
| 27.22001 | -1.823 |
| 27.23001 | -1.631 |
| 27.24002 | -1.37 |
| 27.25002 | -1.102 |
| 27.26002 | -0.883 |
| 27.27001 | -0.737 |
| 27.28001 | -0.655 |
| 27.29001 | -0.596 |
| 27.30001 | -0.512 |
| 27.31001 | -0.368 |
| 27.32001 | -0.162 |
| 27.33002 | 0.079 |
| 27.34002 | 0.304 |
| 27.35001 | 0.462 |
| 27.36001 | 0.526 |
| 27.37001 | 0.501 |
| 27.38001 | 0.422 |
| 27.39001 | 0.344 |
| 27.40001 | 0.315 |
| 27.41002 | 0.357 |
| 27.42002 | 0.464 |
| 27.43002 | 0.598 |
| 27.44001 | 0.707 |
| 27.45001 | 0.743 |
| 27.46001 | 0.672 |
| 27.47001 | 0.487 |
| 27.48001 | 0.202 |
| 27.49002 | -0.157 |
| 27.50002 | -0.556 |
| 27.51002 | -0.964 |
| 27.52002 | -1.351 |
| 27.53001 | -1.689 |
| 27.54001 | -1.947 |
| 27.55001 | -2.096 |
| 27.56001 | -2.114 |
| 27.57001 | -1.997 |
| 27.58002 | -1.763 |
| 27.59002 | -1.453 |
| 27.60002 | -1.124 |
| 27.61001 | -0.834 |
| 27.62001 | -0.625 |
| 27.63001 | -0.508 |
| 27.64001 | -0.465 |
| 27.65001 | -0.45 |
| 27.66002 | -0.411 |
| 27.67002 | -0.305 |
| 27.68002 | -0.116 |
| 27.69002 | 0.144 |
| 27.70001 | 0.437 |
| 27.71001 | 0.715 |
| 27.72001 | 0.94 |
| 27.73001 | 1.09 |
| 27.74002 | 1.168 |
| 27.75002 | 1.195 |
| 27.76002 | 1.198 |
| 27.77002 | 1.202 |
| 27.78001 | 1.224 |
| 27.79001 | 1.268 |
| 27.80001 | 1.331 |
| 27.81001 | 1.41 |
| 27.82001 | 1.501 |
| 27.83002 | 1.599 |
| 27.84002 | 1.691 |
| 27.85002 | 1.757 |
| 27.86002 | 1.768 |
| 27.87001 | 1.696 |
| 27.88001 | 1.523 |
| 27.89001 | 1.259 |
| 27.90001 | 0.938 |
| 27.91002 | 0.616 |
| 27.92002 | 0.352 |
| 27.93002 | 0.187 |
| 27.94002 | 0.124 |
| 27.95001 | 0.127 |
| 27.96001 | 0.131 |
| 27.97001 | 0.067 |
| 27.98001 | -0.112 |
| 27.99002 | -0.406 |
| 28.00002 | -0.766 |
| 28.01002 | -1.107 |
| 28.02002 | -1.336 |
| 28.03002 | -1.383 |
| 28.04001 | -1.223 |
| 28.05001 | -0.884 |
| 28.06001 | -0.438 |
| 28.07001 | 0.025 |
| 28.08002 | 0.425 |
| 28.09002 | 0.709 |
| 28.10002 | 0.86 |
| 28.11002 | 0.893 |
| 28.12001 | 0.842 |
| 28.13001 | 0.746 |
| 28.14001 | 0.635 |
| 28.15001 | 0.533 |
| 28.16002 | 0.455 |
| 28.17002 | 0.411 |
| 28.18002 | 0.409 |
| 28.19002 | 0.451 |
| 28.20002 | 0.534 |
| 28.21001 | 0.643 |
| 28.22001 | 0.753 |
| 28.23001 | 0.834 |
| 28.24002 | 0.862 |
| 28.25002 | 0.821 |
| 28.26002 | 0.713 |
| 28.27002 | 0.558 |
| 28.28002 | 0.386 |
| 28.29001 | 0.236 |
| 28.30001 | 0.148 |
| 28.31001 | 0.157 |
| 28.32001 | 0.288 |
| 28.33002 | 0.554 |
| 28.34002 | 0.95 |
| 28.35002 | 1.449 |
| 28.36002 | 2.001 |
| 28.37002 | 2.54 |
| 28.38001 | 2.989 |
| 28.39001 | 3.279 |
| 28.40001 | 3.362 |
| 28.41002 | 3.228 |
| 28.42002 | 2.901 |
| 28.43002 | 2.439 |
| 28.44002 | 1.917 |
| 28.45002 | 1.406 |
| 28.46001 | 0.963 |
| 28.47001 | 0.619 |
| 28.48001 | 0.379 |
| 28.49002 | 0.233 |
| 28.50002 | 0.162 |
| 28.51002 | 0.148 |
| 28.52002 | 0.177 |
| 28.53002 | 0.238 |
| 28.54002 | 0.318 |
| 28.55001 | 0.4 |
| 28.56001 | 0.467 |
| 28.57001 | 0.497 |
| 28.58002 | 0.474 |
| 28.59002 | 0.394 |
| 28.60002 | 0.259 |
| 28.61002 | 0.086 |
| 28.62002 | -0.107 |
| 28.63001 | -0.298 |
| 28.64001 | -0.465 |
| 28.65001 | -0.592 |
| 28.66002 | -0.664 |
| 28.67002 | -0.671 |
| 28.68002 | -0.608 |
| 28.69002 | -0.478 |
| 28.70002 | -0.294 |
| 28.71002 | -0.08 |
| 28.72001 | 0.14 |
| 28.73001 | 0.337 |
| 28.74002 | 0.494 |
| 28.75002 | 0.604 |
| 28.76002 | 0.674 |
| 28.77002 | 0.717 |
| 28.78002 | 0.747 |
| 28.79002 | 0.77 |
| 28.80001 | 0.78 |
| 28.81001 | 0.762 |
| 28.82001 | 0.696 |
| 28.83002 | 0.565 |
| 28.84002 | 0.364 |
| 28.85002 | 0.103 |
| 28.86002 | -0.193 |
| 28.87002 | -0.49 |
| 28.88002 | -0.752 |
| 28.89001 | -0.945 |
| 28.90001 | -1.047 |
| 28.91002 | -1.048 |
| 28.92002 | -0.95 |
| 28.93002 | -0.77 |
| 28.94002 | -0.534 |
| 28.95002 | -0.278 |
| 28.96002 | -0.042 |
| 28.97002 | 0.138 |
| 28.98001 | 0.235 |
| 28.99002 | 0.241 |
| 29.00002 | 0.165 |
| 29.01002 | 0.036 |
| 29.02002 | -0.107 |
| 29.03002 | -0.227 |
| 29.04002 | -0.296 |
| 29.05002 | -0.3 |
| 29.06001 | -0.246 |
| 29.07001 | -0.149 |
| 29.08002 | -0.029 |
| 29.09002 | 0.096 |
| 29.10002 | 0.215 |
| 29.11002 | 0.319 |
| 29.12002 | 0.402 |
| 29.13002 | 0.448 |
| 29.14002 | 0.436 |
| 29.15001 | 0.345 |
| 29.16002 | 0.159 |
| 29.17002 | -0.121 |
| 29.18002 | -0.47 |
| 29.19002 | -0.84 |
| 29.20002 | -1.171 |
| 29.21002 | -1.402 |
| 29.22002 | -1.49 |
| 29.23001 | -1.422 |
| 29.24002 | -1.218 |
| 29.25002 | -0.924 |
| 29.26002 | -0.6 |
| 29.27002 | -0.299 |
| 29.28002 | -0.053 |
| 29.29002 | 0.134 |
| 29.30002 | 0.283 |
| 29.31002 | 0.434 |
| 29.32001 | 0.622 |
| 29.33002 | 0.865 |
| 29.34002 | 1.154 |
| 29.35002 | 1.45 |
| 29.36002 | 1.694 |
| 29.37002 | 1.823 |
| 29.38002 | 1.796 |
| 29.39002 | 1.604 |
| 29.40001 | 1.28 |
| 29.41002 | 0.894 |
| 29.42002 | 0.532 |
| 29.43002 | 0.275 |
| 29.44002 | 0.171 |
| 29.45002 | 0.225 |
| 29.46002 | 0.397 |
| 29.47002 | 0.62 |
| 29.48002 | 0.824 |
| 29.49002 | 0.959 |
| 29.50002 | 1.014 |
| 29.51002 | 1.012 |
| 29.52002 | 1.003 |
| 29.53002 | 1.035 |
| 29.54002 | 1.13 |
| 29.55002 | 1.277 |
| 29.56002 | 1.431 |
| 29.57001 | 1.53 |
| 29.58002 | 1.522 |
| 29.59002 | 1.386 |
| 29.60002 | 1.138 |
| 29.61002 | 0.826 |
| 29.62002 | 0.509 |
| 29.63002 | 0.238 |
| 29.64002 | 0.029 |
| 29.65002 | -0.134 |
| 29.66002 | -0.295 |
| 29.67002 | -0.499 |
| 29.68002 | -0.774 |
| 29.69002 | -1.115 |
| 29.70002 | -1.482 |
| 29.71002 | -1.811 |
| 29.72002 | -2.039 |
| 29.73002 | -2.117 |
| 29.74002 | -2.031 |
| 29.75002 | -1.801 |
| 29.76002 | -1.472 |
| 29.77002 | -1.1 |
| 29.78002 | -0.739 |
| 29.79002 | -0.424 |
| 29.80002 | -0.176 |
| 29.81002 | 0.003 |
| 29.82002 | 0.121 |
| 29.83002 | 0.19 |
| 29.84002 | 0.222 |
| 29.85002 | 0.228 |
| 29.86002 | 0.221 |
| 29.87002 | 0.211 |
| 29.88002 | 0.208 |
| 29.89002 | 0.218 |
| 29.90002 | 0.242 |
| 29.91002 | 0.276 |
| 29.92002 | 0.312 |
| 29.93002 | 0.337 |
| 29.94002 | 0.343 |
| 29.95002 | 0.326 |
| 29.96002 | 0.284 |
| 29.97002 | 0.223 |
| 29.98002 | 0.148 |
| 29.99002 | 0.061 |
| 30.00002 | -0.038 |
| 30.01002 | -0.152 |
| 30.02002 | -0.285 |
| 30.03002 | -0.436 |
| 30.04002 | -0.597 |
| 30.05002 | -0.751 |
| 30.06002 | -0.876 |
| 30.07002 | -0.948 |
| 30.08002 | -0.95 |
| 30.09002 | -0.878 |
| 30.10002 | -0.744 |
| 30.11002 | -0.572 |
| 30.12002 | -0.396 |
| 30.13002 | -0.246 |
| 30.14002 | -0.141 |
| 30.15002 | -0.083 |
| 30.16002 | -0.053 |
| 30.17002 | -0.023 |
| 30.18002 | 0.043 |
| 30.19002 | 0.171 |
| 30.20002 | 0.374 |
| 30.21002 | 0.644 |
| 30.22002 | 0.957 |
| 30.23002 | 1.28 |
| 30.24002 | 1.571 |
| 30.25002 | 1.793 |
| 30.26002 | 1.918 |
| 30.27002 | 1.93 |
| 30.28002 | 1.829 |
| 30.29002 | 1.634 |
| 30.30002 | 1.384 |
| 30.31002 | 1.129 |
| 30.32002 | 0.93 |
| 30.33002 | 0.835 |
| 30.34002 | 0.875 |
| 30.35002 | 1.045 |
| 30.36002 | 1.306 |
| 30.37002 | 1.589 |
| 30.38002 | 1.816 |
| 30.39002 | 1.918 |
| 30.40002 | 1.857 |
| 30.41002 | 1.638 |
| 30.42002 | 1.306 |
| 30.43002 | 0.93 |
| 30.44002 | 0.583 |
| 30.45002 | 0.318 |
| 30.46002 | 0.151 |
| 30.47002 | 0.064 |
| 30.48002 | 0.012 |
| 30.49002 | -0.058 |
| 30.50002 | -0.185 |
| 30.51002 | -0.381 |
| 30.52002 | -0.625 |
| 30.53002 | -0.868 |
| 30.54002 | -1.046 |
| 30.55002 | -1.102 |
| 30.56002 | -0.999 |
| 30.57002 | -0.739 |
| 30.58002 | -0.361 |
| 30.59002 | 0.065 |
| 30.60002 | 0.452 |
| 30.61002 | 0.722 |
| 30.62002 | 0.824 |
| 30.63002 | 0.753 |
| 30.64002 | 0.553 |
| 30.65002 | 0.302 |
| 30.66002 | 0.089 |
| 30.67002 | -0.011 |
| 30.68002 | 0.033 |
| 30.69002 | 0.201 |
| 30.70002 | 0.429 |
| 30.71002 | 0.634 |
| 30.72002 | 0.747 |
| 30.73002 | 0.735 |
| 30.74002 | 0.615 |
| 30.75002 | 0.446 |
| 30.76002 | 0.297 |
| 30.77002 | 0.226 |
| 30.78002 | 0.251 |
| 30.79002 | 0.35 |
| 30.80002 | 0.477 |
| 30.81002 | 0.588 |
| 30.82002 | 0.669 |
| 30.83002 | 0.746 |
| 30.84002 | 0.88 |
| 30.85002 | 1.135 |
| 30.86002 | 1.545 |
| 30.87002 | 2.092 |
| 30.88002 | 2.7 |
| 30.89002 | 3.251 |
| 30.90002 | 3.629 |
| 30.91002 | 3.754 |
| 30.92002 | 3.608 |
| 30.93002 | 3.243 |
| 30.94002 | 2.751 |
| 30.95002 | 2.24 |
| 30.96002 | 1.788 |
| 30.97002 | 1.434 |
| 30.98002 | 1.173 |
| 30.99002 | 0.976 |
| 31.00002 | 0.816 |
| 31.01002 | 0.684 |
| 31.02002 | 0.599 |
| 31.03002 | 0.587 |
| 31.04002 | 0.666 |
| 31.05002 | 0.822 |
| 31.06002 | 1.007 |
| 31.07002 | 1.149 |
| 31.08002 | 1.176 |
| 31.09002 | 1.049 |
| 31.10002 | 0.773 |
| 31.11002 | 0.403 |
| 31.12002 | 0.024 |
| 31.13002 | -0.282 |
| 31.14002 | -0.457 |
| 31.15002 | -0.493 |
| 31.16002 | -0.421 |
| 31.17002 | -0.297 |
| 31.18002 | -0.177 |
| 31.19002 | -0.089 |
| 31.20002 | -0.031 |
| 31.21002 | 0.027 |
| 31.22002 | 0.122 |
| 31.23002 | 0.281 |
| 31.24002 | 0.499 |
| 31.25002 | 0.744 |
| 31.26002 | 0.967 |
| 31.27002 | 1.119 |
| 31.28002 | 1.174 |
| 31.29002 | 1.131 |
| 31.30002 | 1.013 |
| 31.31002 | 0.857 |
| 31.32002 | 0.693 |
| 31.33002 | 0.535 |
| 31.34002 | 0.377 |
| 31.35002 | 0.201 |
| 31.36002 | -0.009 |
| 31.37002 | -0.256 |
| 31.38002 | -0.522 |
| 31.39002 | -0.771 |
| 31.40002 | -0.966 |
| 31.41002 | -1.078 |
| 31.42002 | -1.099 |
| 31.43002 | -1.042 |
| 31.44002 | -0.939 |
| 31.45002 | -0.823 |
| 31.46002 | -0.719 |
| 31.47002 | -0.639 |
| 31.48002 | -0.578 |
| 31.49002 | -0.527 |
| 31.50002 | -0.482 |
| 31.51002 | -0.449 |
| 31.52002 | -0.449 |
| 31.53002 | -0.507 |
| 31.54002 | -0.637 |
| 31.55002 | -0.834 |
| 31.56002 | -1.065 |
| 31.57002 | -1.272 |
| 31.58002 | -1.39 |
| 31.59002 | -1.364 |
| 31.60002 | -1.168 |
| 31.61002 | -0.82 |
| 31.62002 | -0.38 |
| 31.63002 | 0.066 |
| 31.64002 | 0.424 |
| 31.65002 | 0.62 |
| 31.66002 | 0.617 |
| 31.67002 | 0.428 |
| 31.68002 | 0.109 |
| 31.69002 | -0.256 |
| 31.70002 | -0.582 |
| 31.71002 | -0.801 |
| 31.72002 | -0.879 |
| 31.73002 | -0.822 |
| 31.74002 | -0.667 |
| 31.75002 | -0.467 |
| 31.76002 | -0.27 |
| 31.77002 | -0.11 |
| 31.78002 | 0.01 |
| 31.79002 | 0.106 |
| 31.80002 | 0.211 |
| 31.81002 | 0.359 |
| 31.82002 | 0.57 |
| 31.83002 | 0.844 |
| 31.84002 | 1.158 |
| 31.85002 | 1.47 |
| 31.86002 | 1.729 |
| 31.87002 | 1.884 |
| 31.88002 | 1.902 |
| 31.89002 | 1.77 |
| 31.90002 | 1.503 |
| 31.91002 | 1.145 |
| 31.92002 | 0.759 |
| 31.93002 | 0.415 |
| 31.94002 | 0.175 |
| 31.95002 | 0.074 |
| 31.96002 | 0.114 |
| 31.97002 | 0.257 |
| 31.98002 | 0.437 |
| 31.99002 | 0.579 |
| 32.00002 | 0.623 |
| 32.01002 | 0.542 |
| 32.02002 | 0.35 |
| 32.03002 | 0.1 |
| 32.04002 | -0.14 |
| 32.05002 | -0.312 |
| 32.06002 | -0.385 |
| 32.07002 | -0.371 |
| 32.08002 | -0.31 |
| 32.09002 | -0.258 |
| 32.10002 | -0.256 |
| 32.11002 | -0.317 |
| 32.12002 | -0.419 |
| 32.13002 | -0.521 |
| 32.14002 | -0.586 |
| 32.15002 | -0.6 |
| 32.16002 | -0.591 |
| 32.17002 | -0.612 |
| 32.18002 | -0.726 |
| 32.19002 | -0.972 |
| 32.20002 | -1.345 |
| 32.21002 | -1.782 |
| 32.22002 | -2.186 |
| 32.23002 | -2.45 |
| 32.24002 | -2.498 |
| 32.25002 | -2.31 |
| 32.26002 | -1.926 |
| 32.27002 | -1.431 |
| 32.28002 | -0.923 |
| 32.29002 | -0.478 |
| 32.30002 | -0.133 |
| 32.31002 | 0.122 |
| 32.32002 | 0.324 |
| 32.33002 | 0.513 |
| 32.34002 | 0.705 |
| 32.35002 | 0.886 |
| 32.36002 | 1.018 |
| 32.37002 | 1.058 |
| 32.38002 | 0.988 |
| 32.39002 | 0.823 |
| 32.40002 | 0.616 |
| 32.41002 | 0.439 |
| 32.42002 | 0.357 |
| 32.43002 | 0.403 |
| 32.44002 | 0.565 |
| 32.45002 | 0.79 |
| 32.46002 | 1.008 |
| 32.47002 | 1.152 |
| 32.48002 | 1.187 |
| 32.49002 | 1.117 |
| 32.50002 | 0.978 |
| 32.51002 | 0.823 |
| 32.52002 | 0.697 |
| 32.53002 | 0.622 |
| 32.54002 | 0.59 |
| 32.55002 | 0.572 |
| 32.56002 | 0.532 |
| 32.57002 | 0.446 |
| 32.58002 | 0.309 |
| 32.59002 | 0.144 |
| 32.60002 | -0.016 |
| 32.61002 | -0.131 |
| 32.62002 | -0.176 |
| 32.63002 | -0.144 |
| 32.64002 | -0.043 |
| 32.65002 | 0.108 |
| 32.66002 | 0.289 |
| 32.67002 | 0.486 |
| 32.68002 | 0.696 |
| 32.69002 | 0.917 |
| 32.70002 | 1.147 |
| 32.71002 | 1.372 |
| 32.72002 | 1.567 |
| 32.73002 | 1.696 |
| 32.74002 | 1.729 |
| 32.75002 | 1.647 |
| 32.76002 | 1.457 |
| 32.77002 | 1.189 |
| 32.78002 | 0.896 |
| 32.79002 | 0.636 |
| 32.80002 | 0.453 |
| 32.81002 | 0.371 |
| 32.82002 | 0.378 |
| 32.83002 | 0.44 |
| 32.84002 | 0.508 |
| 32.85002 | 0.538 |
| 32.86002 | 0.507 |
| 32.87002 | 0.417 |
| 32.88002 | 0.296 |
| 32.89002 | 0.181 |
| 32.90002 | 0.104 |
| 32.91002 | 0.079 |
| 32.92002 | 0.095 |
| 32.93002 | 0.125 |
| 32.94002 | 0.137 |
| 32.95002 | 0.113 |
| 32.96002 | 0.059 |
| 32.97002 | 0.006 |
| 32.98002 | 0.005 |
| 32.99002 | 0.103 |
| 33.00002 | 0.33 |
| 33.01002 | 0.684 |
| 33.02002 | 1.126 |
| 33.03002 | 1.587 |
| 33.04002 | 1.991 |
| 33.05002 | 2.266 |
| 33.06002 | 2.369 |
| 33.07002 | 2.289 |
| 33.08002 | 2.05 |
| 33.09002 | 1.702 |
| 33.10002 | 1.309 |
| 33.11002 | 0.93 |
| 33.12002 | 0.61 |
| 33.13002 | 0.367 |
| 33.14002 | 0.194 |
| 33.15002 | 0.061 |
| 33.16002 | -0.076 |
| 33.17002 | -0.251 |
| 33.18002 | -0.482 |
| 33.19002 | -0.752 |
| 33.20002 | -1.014 |
| 33.21002 | -1.204 |
| 33.22002 | -1.258 |
| 33.23002 | -1.139 |
| 33.24002 | -0.856 |
| 33.25002 | -0.47 |
| 33.26002 | -0.072 |
| 33.27002 | 0.234 |
| 33.28002 | 0.377 |
| 33.29002 | 0.334 |
| 33.30002 | 0.141 |
| 33.31002 | -0.119 |
| 33.32002 | -0.356 |
| 33.33002 | -0.504 |
| 33.34002 | -0.55 |
| 33.35002 | -0.535 |
| 33.36002 | -0.534 |
| 33.37002 | -0.621 |
| 33.38002 | -0.829 |
| 33.39002 | -1.134 |
| 33.40002 | -1.456 |
| 33.41002 | -1.691 |
| 33.42002 | -1.747 |
| 33.43002 | -1.585 |
| 33.44002 | -1.229 |
| 33.45002 | -0.762 |
| 33.46002 | -0.284 |
| 33.47002 | 0.118 |
| 33.48002 | 0.408 |
| 33.49002 | 0.607 |
| 33.50002 | 0.775 |
| 33.51002 | 0.978 |
| 33.52002 | 1.255 |
| 33.53002 | 1.593 |
| 33.54002 | 1.935 |
| 33.55002 | 2.201 |
| 33.56002 | 2.319 |
| 33.57002 | 2.26 |
| 33.58002 | 2.044 |
| 33.59002 | 1.736 |
| 33.60002 | 1.417 |
| 33.61002 | 1.155 |
| 33.62002 | 0.982 |
| 33.63002 | 0.887 |
| 33.64002 | 0.833 |
| 33.65002 | 0.775 |
| 33.66002 | 0.684 |
| 33.67002 | 0.559 |
| 33.68002 | 0.424 |
| 33.69002 | 0.311 |
| 33.70002 | 0.245 |
| 33.71002 | 0.226 |
| 33.72002 | 0.231 |
| 33.73002 | 0.223 |
| 33.74002 | 0.171 |
| 33.75002 | 0.062 |
| 33.76002 | -0.087 |
| 33.77002 | -0.238 |
| 33.78002 | -0.345 |
| 33.79002 | -0.374 |
| 33.80002 | -0.312 |
| 33.81002 | -0.173 |
| 33.82002 | 0.01 |
| 33.83002 | 0.202 |
| 33.84002 | 0.379 |
| 33.85002 | 0.536 |
| 33.86002 | 0.686 |
| 33.87002 | 0.85 |
| 33.88002 | 1.041 |
| 33.89002 | 1.253 |
| 33.90002 | 1.463 |
| 33.91002 | 1.632 |
| 33.92002 | 1.724 |
| 33.93002 | 1.716 |
| 33.94002 | 1.612 |
| 33.95002 | 1.436 |
| 33.96002 | 1.232 |
| 33.97002 | 1.039 |
| 33.98002 | 0.885 |
| 33.99002 | 0.775 |
| 34.00002 | 0.696 |
| 34.01002 | 0.621 |
| 34.02002 | 0.524 |
| 34.03002 | 0.394 |
| 34.04002 | 0.234 |
| 34.05002 | 0.063 |
| 34.06002 | -0.094 |
| 34.07002 | -0.218 |
| 34.08002 | -0.3 |
| 34.09002 | -0.345 |
| 34.10002 | -0.366 |
| 34.11002 | -0.377 |
| 34.12002 | -0.387 |
| 34.13002 | -0.395 |
| 34.14002 | -0.392 |
| 34.15002 | -0.37 |
| 34.16002 | -0.323 |
| 34.17002 | -0.256 |
| 34.18002 | -0.182 |
| 34.19002 | -0.118 |
| 34.20002 | -0.077 |
| 34.21002 | -0.059 |
| 34.22002 | -0.053 |
| 34.23002 | -0.038 |
| 34.24002 | 0.009 |
| 34.25002 | 0.104 |
| 34.26002 | 0.245 |
| 34.27002 | 0.414 |
| 34.28002 | 0.583 |
| 34.29002 | 0.716 |
| 34.30002 | 0.787 |
| 34.31002 | 0.784 |
| 34.32002 | 0.712 |
| 34.33002 | 0.593 |
| 34.34002 | 0.455 |
| 34.35002 | 0.325 |
| 34.36002 | 0.221 |
| 34.37002 | 0.146 |
| 34.38002 | 0.095 |
| 34.39002 | 0.053 |
| 34.40002 | 0.007 |
| 34.41002 | -0.05 |
| 34.42002 | -0.113 |
| 34.43002 | -0.171 |
| 34.44002 | -0.208 |
| 34.45002 | -0.209 |
| 34.46002 | -0.168 |
| 34.47002 | -0.089 |
| 34.48002 | 0.017 |
| 34.49002 | 0.134 |
| 34.50002 | 0.244 |
| 34.51002 | 0.337 |
| 34.52002 | 0.408 |
| 34.53002 | 0.457 |
| 34.54002 | 0.488 |
| 34.55002 | 0.503 |
| 34.56002 | 0.505 |
| 34.57002 | 0.494 |
| 34.58002 | 0.471 |
| 34.59002 | 0.443 |
| 34.60002 | 0.418 |
| 34.61002 | 0.407 |
| 34.62002 | 0.416 |
| 34.63002 | 0.444 |
| 34.64002 | 0.48 |
| 34.65002 | 0.506 |
| 34.66002 | 0.5 |
| 34.67002 | 0.449 |
| 34.68002 | 0.348 |
| 34.69002 | 0.212 |
| 34.70002 | 0.065 |
| 34.71002 | -0.065 |
| 34.72002 | -0.156 |
| 34.73002 | -0.198 |
| 34.74002 | -0.197 |
| 34.75002 | -0.171 |
| 34.76002 | -0.14 |
| 34.77002 | -0.118 |
| 34.78002 | -0.11 |
| 34.79002 | -0.108 |
| 34.80002 | -0.102 |
| 34.81002 | -0.084 |
| 34.82002 | -0.056 |
| 34.83002 | -0.033 |
| 34.84002 | -0.035 |
| 34.85002 | -0.081 |
| 34.86002 | -0.18 |
| 34.87002 | -0.322 |
| 34.88002 | -0.481 |
| 34.89002 | -0.622 |
| 34.90002 | -0.712 |
| 34.91002 | -0.726 |
| 34.92002 | -0.66 |
| 34.93002 | -0.526 |
| 34.94002 | -0.349 |
| 34.95002 | -0.157 |
| 34.96002 | 0.023 |
| 34.97002 | 0.176 |
| 34.98002 | 0.295 |
| 34.99002 | 0.381 |
| 35.00002 | 0.438 |
| 35.01002 | 0.472 |
| 35.02002 | 0.487 |
| 35.03002 | 0.486 |
| 35.04002 | 0.473 |
| 35.05002 | 0.452 |
| 35.06002 | 0.428 |
| 35.07002 | 0.404 |
| 35.08002 | 0.379 |
| 35.09002 | 0.353 |
| 35.10002 | 0.324 |
| 35.11002 | 0.291 |
| 35.12002 | 0.256 |
| 35.13002 | 0.228 |
| 35.14002 | 0.213 |
| 35.15002 | 0.22 |
| 35.16002 | 0.25 |
| 35.17002 | 0.296 |
| 35.18002 | 0.346 |
| 35.19002 | 0.387 |
| 35.20002 | 0.404 |
| 35.21002 | 0.395 |
| 35.22002 | 0.361 |
| 35.23002 | 0.314 |
| 35.24002 | 0.268 |
| 35.25002 | 0.235 |
| 35.26002 | 0.219 |
| 35.27002 | 0.22 |
| 35.28002 | 0.23 |
| 35.29002 | 0.245 |
| 35.30002 | 0.262 |
| 35.31002 | 0.285 |
| 35.32002 | 0.322 |
| 35.33002 | 0.381 |
| 35.34002 | 0.464 |
| 35.35002 | 0.569 |
| 35.36002 | 0.683 |
| 35.37002 | 0.79 |
| 35.38002 | 0.876 |
| 35.39002 | 0.931 |
| 35.40002 | 0.953 |
| 35.41002 | 0.949 |
| 35.42002 | 0.925 |
| 35.43002 | 0.886 |
| 35.44002 | 0.831 |
| 35.45002 | 0.756 |
| 35.46002 | 0.66 |
| 35.47002 | 0.546 |
| 35.48002 | 0.427 |
| 35.49002 | 0.327 |
| 35.50002 | 0.273 |
| 35.51002 | 0.285 |
| 35.52002 | 0.37 |
| 35.53002 | 0.515 |
| 35.54002 | 0.688 |
| 35.55002 | 0.849 |
| 35.56002 | 0.956 |
| 35.57002 | 0.982 |
| 35.58002 | 0.92 |
| 35.59002 | 0.787 |
| 35.60002 | 0.613 |
| 35.61002 | 0.436 |
| 35.62002 | 0.289 |
| 35.63002 | 0.188 |
| 35.64002 | 0.133 |
| 35.65002 | 0.107 |
| 35.66002 | 0.086 |
| 35.67002 | 0.049 |
| 35.68002 | -0.017 |
| 35.69002 | -0.107 |
| 35.70002 | -0.2 |
| 35.71002 | -0.269 |
| 35.72002 | -0.283 |
| 35.73002 | -0.223 |
| 35.74002 | -0.088 |
| 35.75002 | 0.102 |
| 35.76002 | 0.311 |
| 35.77002 | 0.495 |
| 35.78002 | 0.616 |
| 35.79002 | 0.654 |
| 35.80002 | 0.614 |
| 35.81002 | 0.525 |
| 35.82002 | 0.427 |
| 35.83002 | 0.362 |
| 35.84002 | 0.353 |
| 35.85002 | 0.402 |
| 35.86002 | 0.483 |
| 35.87002 | 0.559 |
| 35.88002 | 0.594 |
| 35.89002 | 0.567 |
| 35.90002 | 0.484 |
| 35.91002 | 0.372 |
| 35.92002 | 0.269 |
| 35.93002 | 0.21 |
| 35.94002 | 0.21 |
| 35.95002 | 0.262 |
| 35.96002 | 0.341 |
| 35.97002 | 0.415 |
| 35.98002 | 0.462 |
| 35.99002 | 0.482 |
| 36.00002 | 0.494 |
| 36.01002 | 0.53 |
| 36.02002 | 0.618 |
| 36.03002 | 0.768 |
| 36.04002 | 0.963 |
| 36.05002 | 1.165 |
| 36.06002 | 1.324 |
| 36.07002 | 1.401 |
| 36.08002 | 1.378 |
| 36.09002 | 1.266 |
| 36.10002 | 1.099 |
| 36.11002 | 0.92 |
| 36.12002 | 0.766 |
| 36.13002 | 0.657 |
| 36.14002 | 0.591 |
| 36.15002 | 0.551 |
| 36.16002 | 0.518 |
| 36.17002 | 0.478 |
| 36.18002 | 0.433 |
| 36.19002 | 0.397 |
| 36.20002 | 0.389 |
| 36.21002 | 0.418 |
| 36.22002 | 0.481 |
| 36.23002 | 0.557 |
| 36.24002 | 0.617 |
| 36.25002 | 0.631 |
| 36.26002 | 0.582 |
| 36.27002 | 0.473 |
| 36.28002 | 0.325 |
| 36.29002 | 0.171 |
| 36.30002 | 0.045 |
| 36.31002 | -0.03 |
| 36.32002 | -0.05 |
| 36.33002 | -0.024 |
| 36.34002 | 0.025 |
| 36.35002 | 0.073 |
| 36.36002 | 0.108 |
| 36.37002 | 0.125 |
| 36.38002 | 0.134 |
| 36.39002 | 0.152 |
| 36.40002 | 0.19 |
| 36.41002 | 0.254 |
| 36.42002 | 0.338 |
| 36.43002 | 0.426 |
| 36.44002 | 0.5 |
| 36.45002 | 0.542 |
| 36.46002 | 0.544 |
| 36.47002 | 0.506 |
| 36.48002 | 0.438 |
| 36.49002 | 0.353 |
| 36.50002 | 0.264 |
| 36.51002 | 0.181 |
| 36.52002 | 0.108 |
| 36.53002 | 0.044 |
| 36.54002 | -0.01 |
| 36.55002 | -0.053 |
| 36.56002 | -0.081 |
| 36.57002 | -0.091 |
| 36.58002 | -0.079 |
| 36.59002 | -0.049 |
| 36.60002 | -0.007 |
| 36.61002 | 0.036 |
| 36.62002 | 0.07 |
| 36.63002 | 0.087 |
| 36.64002 | 0.086 |
| 36.65002 | 0.073 |
| 36.66002 | 0.054 |
| 36.67002 | 0.039 |
| 36.68002 | 0.029 |
| 36.69002 | 0.021 |
| 36.70002 | 0.006 |
| 36.71002 | -0.027 |
| 36.72002 | -0.082 |
| 36.73002 | -0.156 |
| 36.74002 | -0.232 |
| 36.75002 | -0.288 |
| 36.76002 | -0.3 |
| 36.77002 | -0.252 |
| 36.78002 | -0.143 |
| 36.79002 | 0.011 |
| 36.80002 | 0.179 |
| 36.81002 | 0.323 |
| 36.82002 | 0.412 |
| 36.83002 | 0.425 |
| 36.84002 | 0.363 |
| 36.85002 | 0.243 |
| 36.86002 | 0.099 |
| 36.87002 | -0.033 |
| 36.88002 | -0.125 |
| 36.89002 | -0.16 |
| 36.90002 | -0.14 |
| 36.91002 | -0.079 |
| 36.92002 | 0.001 |
| 36.93002 | 0.079 |
| 36.94002 | 0.142 |
| 36.95002 | 0.184 |
| 36.96002 | 0.212 |
| 36.97002 | 0.24 |
| 36.98002 | 0.28 |
| 36.99002 | 0.342 |
| 37.00002 | 0.428 |
| 37.01002 | 0.532 |
| 37.02002 | 0.638 |
| 37.03002 | 0.729 |
| 37.04002 | 0.787 |
| 37.05002 | 0.798 |
| 37.06002 | 0.759 |
| 37.07002 | 0.676 |
| 37.08002 | 0.564 |
| 37.09002 | 0.448 |
| 37.10002 | 0.349 |
| 37.11002 | 0.288 |
| 37.12002 | 0.271 |
| 37.13002 | 0.292 |
| 37.14002 | 0.332 |
| 37.15002 | 0.368 |
| 37.16002 | 0.378 |
| 37.17002 | 0.352 |
| 37.18002 | 0.293 |
| 37.19002 | 0.218 |
| 37.20002 | 0.152 |
| 37.21002 | 0.114 |
| 37.22002 | 0.116 |
| 37.23002 | 0.15 |
| 37.24002 | 0.198 |
| 37.25002 | 0.237 |
| 37.26002 | 0.246 |
| 37.27002 | 0.221 |
| 37.28002 | 0.168 |
| 37.29002 | 0.107 |
| 37.30002 | 0.059 |
| 37.31002 | 0.034 |
| 37.32002 | 0.029 |
| 37.33002 | 0.026 |
| 37.34002 | -0.001 |
| 37.35002 | -0.07 |
| 37.36002 | -0.187 |
| 37.37002 | -0.338 |
| 37.38002 | -0.491 |
| 37.39002 | -0.61 |
| 37.40002 | -0.666 |
| 37.41002 | -0.646 |
| 37.42002 | -0.559 |
| 37.43002 | -0.432 |
| 37.44002 | -0.295 |
| 37.45002 | -0.178 |
| 37.46002 | -0.092 |
| 37.47002 | -0.035 |
| 37.48002 | 0.006 |
| 37.49002 | 0.048 |
| 37.50002 | 0.101 |
| 37.51002 | 0.162 |
| 37.52002 | 0.22 |
| 37.53002 | 0.26 |
| 37.54002 | 0.269 |
| 37.55002 | 0.247 |
| 37.56002 | 0.204 |
| 37.57002 | 0.16 |
| 37.58002 | 0.131 |
| 37.59002 | 0.132 |
| 37.60002 | 0.162 |
| 37.61002 | 0.212 |
| 37.62002 | 0.263 |
| 37.63002 | 0.3 |
| 37.64002 | 0.314 |
| 37.65002 | 0.306 |
| 37.66002 | 0.285 |
| 37.67002 | 0.263 |
| 37.68002 | 0.25 |
| 37.69002 | 0.247 |
| 37.70002 | 0.25 |
| 37.71002 | 0.249 |
| 37.72002 | 0.235 |
| 37.73002 | 0.205 |
| 37.74002 | 0.163 |
| 37.75002 | 0.119 |
| 37.76002 | 0.088 |
| 37.77002 | 0.077 |
| 37.78002 | 0.091 |
| 37.79002 | 0.124 |
| 37.80002 | 0.163 |
| 37.81002 | 0.199 |
| 37.82002 | 0.225 |
| 37.83002 | 0.243 |
| 37.84002 | 0.265 |
| 37.85002 | 0.304 |
| 37.86002 | 0.374 |
| 37.87002 | 0.479 |
| 37.88002 | 0.613 |
| 37.89002 | 0.758 |
| 37.90002 | 0.89 |
| 37.91002 | 0.989 |
| 37.92002 | 1.038 |
| 37.93002 | 1.034 |
| 37.94002 | 0.985 |
| 37.95002 | 0.906 |
| 37.96002 | 0.815 |
| 37.97002 | 0.726 |
| 37.98002 | 0.649 |
| 37.99002 | 0.586 |
| 38.00002 | 0.54 |
| 38.01002 | 0.507 |
| 38.02002 | 0.489 |
| 38.03002 | 0.486 |
| 38.04002 | 0.498 |
| 38.05002 | 0.521 |
| 38.06002 | 0.548 |
| 38.07002 | 0.568 |
| 38.08002 | 0.57 |
| 38.09002 | 0.548 |
| 38.10002 | 0.504 |
| 38.11002 | 0.446 |
| 38.12002 | 0.388 |
| 38.13002 | 0.344 |
| 38.14002 | 0.323 |
| 38.15002 | 0.327 |
| 38.16002 | 0.348 |
| 38.17002 | 0.372 |
| 38.18002 | 0.388 |
| 38.19002 | 0.387 |
| 38.20002 | 0.369 |
| 38.21002 | 0.342 |
| 38.22002 | 0.316 |
| 38.23002 | 0.3 |
| 38.24002 | 0.298 |
| 38.25002 | 0.305 |
| 38.26002 | 0.313 |
| 38.27002 | 0.308 |
| 38.28002 | 0.284 |
| 38.29002 | 0.237 |
| 38.30002 | 0.174 |
| 38.31002 | 0.106 |
| 38.32002 | 0.048 |
| 38.33002 | 0.013 |
| 38.34002 | 0.012 |
| 38.35002 | 0.046 |
| 38.36002 | 0.116 |
| 38.37002 | 0.215 |
| 38.38002 | 0.334 |
| 38.39002 | 0.463 |
| 38.40002 | 0.59 |
| 38.41002 | 0.704 |
| 38.42002 | 0.792 |
| 38.43002 | 0.848 |
| 38.44002 | 0.866 |
| 38.45002 | 0.851 |
| 38.46002 | 0.811 |
| 38.47002 | 0.759 |
| 38.48002 | 0.708 |
| 38.49002 | 0.672 |
| 38.50002 | 0.656 |
| 38.51002 | 0.661 |
| 38.52002 | 0.683 |
| 38.53002 | 0.715 |
| 38.54002 | 0.751 |
| 38.55002 | 0.789 |
| 38.56002 | 0.825 |
| 38.57002 | 0.861 |
| 38.58002 | 0.896 |
| 38.59002 | 0.927 |
| 38.60002 | 0.949 |
| 38.61002 | 0.958 |
| 38.62002 | 0.95 |
| 38.63002 | 0.928 |
| 38.64002 | 0.896 |
| 38.65002 | 0.864 |
| 38.66002 | 0.841 |
| 38.67002 | 0.834 |
| 38.68002 | 0.846 |
| 38.69002 | 0.872 |
| 38.70002 | 0.903 |
| 38.71002 | 0.927 |
| 38.72002 | 0.933 |
| 38.73002 | 0.914 |
| 38.74002 | 0.867 |
| 38.75002 | 0.795 |
| 38.76002 | 0.705 |
| 38.77002 | 0.606 |
| 38.78002 | 0.505 |
| 38.79002 | 0.407 |
| 38.80002 | 0.316 |
| 38.81002 | 0.236 |
| 38.82002 | 0.166 |
| 38.83002 | 0.109 |
| 38.84002 | 0.065 |
| 38.85002 | 0.035 |
| 38.86002 | 0.018 |
| 38.87002 | 0.011 |
| 38.88002 | 0.011 |
| 38.89002 | 0.011 |
| 38.90002 | 0.008 |
| 38.91002 | 0.001 |
| 38.92002 | -0.008 |
| 38.93002 | -0.014 |
| 38.94002 | -0.013 |
| 38.95002 | 0.001 |
| 38.96002 | 0.029 |
| 38.97002 | 0.067 |
| 38.98002 | 0.108 |
| 38.99002 | 0.145 |
| 39.00002 | 0.169 |
| 39.01002 | 0.177 |
| 39.02002 | 0.171 |
| 39.03002 | 0.155 |
| 39.04002 | 0.138 |
| 39.05002 | 0.126 |
| 39.06002 | 0.122 |
| 39.07002 | 0.126 |
| 39.08002 | 0.136 |
| 39.09002 | 0.148 |
| 39.10002 | 0.158 |
| 39.11002 | 0.167 |
| 39.12002 | 0.173 |
| 39.13002 | 0.176 |
| 39.14002 | 0.172 |
| 39.15002 | 0.156 |
| 39.16002 | 0.122 |
| 39.17002 | 0.068 |
| 39.18002 | -0.003 |
| 39.19002 | -0.082 |
| 39.20002 | -0.151 |
| 39.21002 | -0.197 |
| 39.22002 | -0.206 |
| 39.23002 | -0.18 |
| 39.24002 | -0.125 |
| 39.25002 | -0.06 |
| 39.26002 | -0.002 |
| 39.27002 | 0.036 |
| 39.28002 | 0.052 |
| 39.29002 | 0.052 |
| 39.30002 | 0.048 |
| 39.31002 | 0.053 |
| 39.32002 | 0.069 |
| 39.33002 | 0.087 |
| 39.34002 | 0.091 |
| 39.35002 | 0.062 |
| 39.36002 | -0.01 |
| 39.37002 | -0.12 |
| 39.38002 | -0.249 |
| 39.39002 | -0.367 |
| 39.40002 | -0.44 |
| 39.41002 | -0.448 |
| 39.42002 | -0.384 |
| 39.43002 | -0.262 |
| 39.44002 | -0.11 |
| 39.45002 | 0.04 |
| 39.46002 | 0.161 |
| 39.47002 | 0.241 |
| 39.48002 | 0.285 |
| 39.49002 | 0.309 |
| 39.50002 | 0.337 |
| 39.51002 | 0.386 |
| 39.52002 | 0.463 |
| 39.53002 | 0.56 |
| 39.54002 | 0.659 |
| 39.55002 | 0.734 |
| 39.56002 | 0.765 |
| 39.57002 | 0.739 |
| 39.58002 | 0.662 |
| 39.59002 | 0.551 |
| 39.60002 | 0.434 |
| 39.61002 | 0.34 |
| 39.62002 | 0.291 |
| 39.63002 | 0.298 |
| 39.64002 | 0.353 |
| 39.65002 | 0.436 |
| 39.66002 | 0.52 |
| 39.67002 | 0.579 |
| 39.68002 | 0.598 |
| 39.69002 | 0.579 |
| 39.70002 | 0.536 |
| 39.71002 | 0.495 |
| 39.72002 | 0.479 |
| 39.73002 | 0.503 |
| 39.74002 | 0.565 |
| 39.75002 | 0.649 |
| 39.76002 | 0.727 |
| 39.77002 | 0.773 |
| 39.78002 | 0.767 |
| 39.79002 | 0.707 |
| 39.80002 | 0.603 |
| 39.81002 | 0.477 |
| 39.82002 | 0.348 |
| 39.83002 | 0.231 |
| 39.84002 | 0.127 |
| 39.85002 | 0.03 |
| 39.86002 | -0.072 |
| 39.87002 | -0.186 |
| 39.88002 | -0.308 |
| 39.89002 | -0.426 |
| 39.90002 | -0.52 |
| 39.91002 | -0.571 |
| 39.92002 | -0.569 |
| 39.93002 | -0.518 |
| 39.94002 | -0.434 |
| 39.95002 | -0.34 |
| 39.96002 | -0.261 |
| 39.97002 | -0.209 |
| 39.98002 | -0.19 |
| 39.99002 | -0.195 |
| 40.00002 | -0.209 |
| 40.01002 | -0.22 |
| 40.02002 | -0.216 |
| 40.03002 | -0.195 |
| 40.04002 | -0.16 |
| 40.05002 | -0.115 |
| 40.06002 | -0.062 |
| 40.07002 | 0 |
| 40.08002 | 0.072 |
| 40.09002 | 0.16 |
| 40.10002 | 0.261 |
| 40.11002 | 0.369 |
| 40.12002 | 0.472 |
| 40.13002 | 0.558 |
| 40.14002 | 0.612 |
| 40.15002 | 0.63 |
| 40.16002 | 0.611 |
| 40.17002 | 0.564 |
| 40.18002 | 0.5 |
| 40.19002 | 0.43 |
| 40.20002 | 0.361 |
| 40.21002 | 0.295 |
| 40.22002 | 0.231 |
| 40.23002 | 0.167 |
| 40.24002 | 0.101 |
| 40.25002 | 0.037 |
| 40.26002 | -0.019 |
| 40.27002 | -0.06 |
| 40.28002 | -0.078 |
| 40.29002 | -0.071 |
| 40.30002 | -0.039 |
| 40.31002 | 0.014 |
| 40.32002 | 0.079 |
| 40.33002 | 0.148 |
| 40.34002 | 0.215 |
| 40.35002 | 0.274 |
| 40.36002 | 0.323 |
| 40.37002 | 0.359 |
| 40.38002 | 0.382 |
| 40.39002 | 0.393 |
| 40.40002 | 0.393 |
| 40.41002 | 0.386 |
| 40.42002 | 0.376 |
| 40.43002 | 0.372 |
| 40.44002 | 0.381 |
| 40.45002 | 0.405 |
| 40.46002 | 0.447 |
| 40.47002 | 0.503 |
| 40.48002 | 0.566 |
| 40.49002 | 0.625 |
| 40.50002 | 0.672 |
| 40.51002 | 0.7 |
| 40.52002 | 0.705 |
| 40.53002 | 0.688 |
| 40.54002 | 0.654 |
| 40.55002 | 0.61 |
| 40.56002 | 0.564 |
| 40.57002 | 0.521 |
| 40.58002 | 0.483 |
| 40.59002 | 0.45 |
| 40.60002 | 0.417 |
| 40.61002 | 0.38 |
| 40.62002 | 0.336 |
| 40.63002 | 0.284 |
| 40.64002 | 0.23 |
| 40.65002 | 0.185 |
| 40.66002 | 0.163 |
| 40.67002 | 0.176 |
| 40.68002 | 0.23 |
| 40.69002 | 0.323 |
| 40.70002 | 0.443 |
| 40.71002 | 0.568 |
| 40.72002 | 0.675 |
| 40.73002 | 0.742 |
| 40.74002 | 0.759 |
| 40.75002 | 0.726 |
| 40.76002 | 0.66 |
| 40.77002 | 0.582 |
| 40.78002 | 0.515 |
| 40.79002 | 0.476 |
| 40.80002 | 0.47 |
| 40.81002 | 0.49 |
| 40.82002 | 0.518 |
| 40.83002 | 0.534 |
| 40.84002 | 0.522 |
| 40.85002 | 0.475 |
| 40.86002 | 0.398 |
| 40.87002 | 0.306 |
| 40.88002 | 0.219 |
| 40.89002 | 0.155 |
| 40.90002 | 0.126 |
| 40.91002 | 0.132 |
| 40.92002 | 0.163 |
| 40.93002 | 0.201 |
| 40.94002 | 0.23 |
| 40.95002 | 0.235 |
| 40.96002 | 0.212 |
| 40.97002 | 0.167 |
| 40.98002 | 0.113 |
| 40.99002 | 0.068 |
| 41.00002 | 0.045 |
| 41.01002 | 0.051 |
| 41.02002 | 0.082 |
| 41.03002 | 0.127 |
| 41.04002 | 0.168 |
| 41.05002 | 0.19 |
| 41.06002 | 0.184 |
| 41.07002 | 0.152 |
| 41.08002 | 0.107 |
| 41.09002 | 0.067 |
| 41.10002 | 0.047 |
| 41.11002 | 0.058 |
| 41.12002 | 0.097 |
| 41.13002 | 0.154 |
| 41.14002 | 0.213 |
| 41.15002 | 0.259 |
| 41.16002 | 0.285 |
| 41.17002 | 0.298 |
| 41.18002 | 0.31 |
| 41.19002 | 0.339 |
| 41.20002 | 0.398 |
| 41.21002 | 0.487 |
| 41.22002 | 0.598 |
| 41.23002 | 0.711 |
| 41.24002 | 0.804 |
| 41.25002 | 0.858 |
| 41.26002 | 0.868 |
| 41.27002 | 0.839 |
| 41.28002 | 0.787 |
| 41.29002 | 0.728 |
| 41.30002 | 0.679 |
| 41.31002 | 0.644 |
| 41.32002 | 0.623 |
| 41.33002 | 0.605 |
| 41.34002 | 0.58 |
| 41.35002 | 0.543 |
| 41.36002 | 0.494 |
| 41.37002 | 0.438 |
| 41.38002 | 0.386 |
| 41.39002 | 0.343 |
| 41.40002 | 0.313 |
| 41.41002 | 0.292 |
| 41.42002 | 0.272 |
| 41.43002 | 0.246 |
| 41.44002 | 0.213 |
| 41.45002 | 0.174 |
| 41.46002 | 0.139 |
| 41.47002 | 0.117 |
| 41.48002 | 0.116 |
| 41.49002 | 0.139 |
| 41.50002 | 0.18 |
| 41.51002 | 0.23 |
| 41.52002 | 0.277 |
| 41.53002 | 0.313 |
| 41.54002 | 0.334 |
| 41.55002 | 0.344 |
| 41.56002 | 0.352 |
| 41.57002 | 0.368 |
| 41.58002 | 0.397 |
| 41.59002 | 0.441 |
| 41.60002 | 0.493 |
| 41.61002 | 0.543 |
| 41.62002 | 0.581 |
| 41.63002 | 0.6 |
| 41.64002 | 0.598 |
| 41.65002 | 0.578 |
| 41.66002 | 0.55 |
| 41.67002 | 0.522 |
| 41.68002 | 0.499 |
| 41.69002 | 0.482 |
| 41.70002 | 0.469 |
| 41.71002 | 0.452 |
| 41.72002 | 0.425 |
| 41.73002 | 0.386 |
| 41.74002 | 0.335 |
| 41.75002 | 0.278 |
| 41.76002 | 0.22 |
| 41.77002 | 0.169 |
| 41.78002 | 0.128 |
| 41.79002 | 0.096 |
| 41.80002 | 0.074 |
| 41.81002 | 0.057 |
| 41.82002 | 0.043 |
| 41.83002 | 0.031 |
| 41.84002 | 0.019 |
| 41.85002 | 0.007 |
| 41.86002 | -0.005 |
| 41.87002 | -0.019 |
| 41.88002 | -0.037 |
| 41.89002 | -0.058 |
| 41.90002 | -0.08 |
| 41.91002 | -0.096 |
| 41.92002 | -0.099 |
| 41.93002 | -0.082 |
| 41.94002 | -0.04 |
| 41.95002 | 0.027 |
| 41.96002 | 0.11 |
| 41.97002 | 0.199 |
| 41.98002 | 0.279 |
| 41.99002 | 0.341 |
| 42.00002 | 0.376 |
| 42.01002 | 0.385 |
| 42.02002 | 0.373 |
| 42.03002 | 0.348 |
| 42.04002 | 0.32 |
| 42.05002 | 0.296 |
| 42.06002 | 0.28 |
| 42.07002 | 0.271 |
| 42.08002 | 0.266 |
| 42.09002 | 0.264 |
| 42.10002 | 0.262 |
| 42.11002 | 0.26 |
| 42.12002 | 0.259 |
| 42.13002 | 0.261 |
| 42.14002 | 0.269 |
| 42.15002 | 0.282 |
| 42.16002 | 0.303 |
| 42.17002 | 0.328 |
| 42.18002 | 0.358 |
| 42.19002 | 0.39 |
| 42.20002 | 0.422 |
| 42.21002 | 0.452 |
| 42.22002 | 0.476 |
| 42.23002 | 0.494 |
| 42.24002 | 0.504 |
| 42.25002 | 0.507 |
| 42.26002 | 0.505 |
| 42.27002 | 0.5 |
| 42.28002 | 0.496 |
| 42.29002 | 0.492 |
| 42.30002 | 0.489 |
| 42.31002 | 0.482 |
| 42.32002 | 0.466 |
| 42.33002 | 0.435 |
| 42.34002 | 0.388 |
| 42.35002 | 0.326 |
| 42.36002 | 0.254 |
| 42.37002 | 0.182 |
| 42.38002 | 0.12 |
| 42.39002 | 0.074 |
| 42.40002 | 0.049 |
| 42.41002 | 0.04 |
| 42.42002 | 0.042 |
| 42.43002 | 0.047 |
| 42.44002 | 0.047 |
| 42.45002 | 0.04 |
| 42.46002 | 0.026 |
| 42.47002 | 0.011 |
| 42.48002 | 0 |
| 42.49002 | -0.005 |
| 42.50002 | -0.003 |
| 42.51002 | 0.001 |
| 42.52002 | 0.002 |
| 42.53002 | -0.007 |
| 42.54002 | -0.025 |
| 42.55002 | -0.05 |
| 42.56002 | -0.072 |
| 42.57002 | -0.081 |
| 42.58002 | -0.067 |
| 42.59002 | -0.029 |
| 42.60002 | 0.031 |
| 42.61002 | 0.102 |
| 42.62002 | 0.173 |
| 42.63002 | 0.23 |
| 42.64002 | 0.267 |
| 42.65002 | 0.283 |
| 42.66002 | 0.285 |
| 42.67002 | 0.282 |
| 42.68002 | 0.281 |
| 42.69002 | 0.288 |
| 42.70002 | 0.302 |
| 42.71002 | 0.318 |
| 42.72002 | 0.329 |
| 42.73002 | 0.33 |
| 42.74002 | 0.321 |
| 42.75002 | 0.304 |
| 42.76002 | 0.285 |
| 42.77002 | 0.27 |
| 42.78002 | 0.263 |
| 42.79002 | 0.263 |
| 42.80002 | 0.266 |
| 42.81002 | 0.267 |
| 42.82002 | 0.262 |
| 42.83002 | 0.25 |
| 42.84002 | 0.233 |
| 42.85002 | 0.218 |
| 42.86002 | 0.209 |
| 42.87002 | 0.209 |
| 42.88002 | 0.216 |
| 42.89002 | 0.226 |
| 42.90002 | 0.232 |
| 42.91002 | 0.227 |
| 42.92002 | 0.212 |
| 42.93002 | 0.19 |
| 42.94002 | 0.168 |
| 42.95002 | 0.155 |
| 42.96002 | 0.158 |
| 42.97002 | 0.181 |
| 42.98002 | 0.219 |
| 42.99002 | 0.268 |
| 43.00002 | 0.317 |
| 43.01002 | 0.361 |
| 43.02002 | 0.394 |
| 43.03002 | 0.417 |
| 43.04002 | 0.431 |
| 43.05002 | 0.441 |
| 43.06002 | 0.45 |
| 43.07002 | 0.459 |
| 43.08002 | 0.469 |
| 43.09002 | 0.478 |
| 43.10002 | 0.484 |
| 43.11002 | 0.486 |
| 43.12002 | 0.484 |
| 43.13002 | 0.477 |
| 43.14002 | 0.467 |
| 43.15002 | 0.458 |
| 43.16002 | 0.452 |
| 43.17002 | 0.452 |
| 43.18002 | 0.463 |
| 43.19002 | 0.486 |
| 43.20002 | 0.52 |
| 43.21002 | 0.564 |
| 43.22002 | 0.61 |
| 43.23002 | 0.65 |
| 43.24002 | 0.675 |
| 43.25002 | 0.676 |
| 43.26003 | 0.652 |
| 43.27002 | 0.604 |
| 43.28002 | 0.54 |
| 43.29002 | 0.468 |
| 43.30002 | 0.402 |
| 43.31002 | 0.349 |
| 43.32002 | 0.312 |
| 43.33002 | 0.291 |
| 43.34002 | 0.279 |
| 43.35002 | 0.268 |
| 43.36002 | 0.253 |
| 43.37002 | 0.23 |
| 43.38002 | 0.201 |
| 43.39002 | 0.17 |
| 43.40002 | 0.143 |
| 43.41002 | 0.127 |
| 43.42002 | 0.125 |
| 43.43002 | 0.134 |
| 43.44002 | 0.15 |
| 43.45002 | 0.166 |
| 43.46002 | 0.172 |
| 43.47002 | 0.164 |
| 43.48002 | 0.142 |
| 43.49002 | 0.11 |
| 43.50002 | 0.075 |
| 43.51003 | 0.045 |
| 43.52002 | 0.028 |
| 43.53002 | 0.025 |
| 43.54002 | 0.034 |
| 43.55002 | 0.049 |
| 43.56002 | 0.06 |
| 43.57002 | 0.062 |
| 43.58002 | 0.05 |
| 43.59002 | 0.029 |
| 43.60003 | 0.006 |
| 43.61002 | -0.009 |
| 43.62002 | -0.007 |
| 43.63002 | 0.018 |
| 43.64002 | 0.066 |
| 43.65002 | 0.131 |
| 43.66002 | 0.206 |
| 43.67002 | 0.284 |
| 43.68002 | 0.356 |
| 43.69003 | 0.422 |
| 43.70002 | 0.481 |
| 43.71002 | 0.534 |
| 43.72002 | 0.581 |
| 43.73002 | 0.622 |
| 43.74002 | 0.653 |
| 43.75002 | 0.672 |
| 43.76003 | 0.676 |
| 43.77002 | 0.666 |
| 43.78002 | 0.645 |
| 43.79002 | 0.62 |
| 43.80002 | 0.596 |
| 43.81002 | 0.58 |
| 43.82002 | 0.572 |
| 43.83002 | 0.574 |
| 43.84002 | 0.58 |
| 43.85003 | 0.588 |
| 43.86002 | 0.593 |
| 43.87002 | 0.593 |
| 43.88002 | 0.587 |
| 43.89002 | 0.577 |
| 43.90002 | 0.562 |
| 43.91002 | 0.542 |
| 43.92002 | 0.517 |
| 43.93002 | 0.485 |
| 43.94003 | 0.448 |
| 43.95002 | 0.407 |
| 43.96002 | 0.367 |
| 43.97002 | 0.332 |
| 43.98002 | 0.306 |
| 43.99002 | 0.291 |
| 44.00002 | 0.287 |
| 44.01003 | 0.292 |
| 44.02002 | 0.304 |
| 44.03003 | 0.32 |
| 44.04002 | 0.34 |
| 44.05002 | 0.364 |
| 44.06002 | 0.392 |
| 44.07002 | 0.425 |
| 44.08002 | 0.458 |
| 44.09002 | 0.488 |
| 44.10003 | 0.509 |
| 44.11002 | 0.517 |
| 44.12002 | 0.51 |
| 44.13002 | 0.49 |
| 44.14002 | 0.462 |
| 44.15002 | 0.431 |
| 44.16002 | 0.403 |
| 44.17002 | 0.381 |
| 44.18002 | 0.364 |
| 44.19003 | 0.349 |
| 44.20002 | 0.33 |
| 44.21002 | 0.304 |
| 44.22002 | 0.272 |
| 44.23002 | 0.235 |
| 44.24002 | 0.199 |
| 44.25002 | 0.169 |
| 44.26003 | 0.15 |
| 44.27002 | 0.142 |
| 44.28003 | 0.142 |
| 44.29002 | 0.145 |
| 44.30002 | 0.147 |
| 44.31002 | 0.143 |
| 44.32002 | 0.133 |
| 44.33002 | 0.122 |
| 44.34002 | 0.112 |
| 44.35003 | 0.111 |
| 44.36002 | 0.121 |
| 44.37003 | 0.144 |
| 44.38002 | 0.178 |
| 44.39002 | 0.219 |
| 44.40002 | 0.26 |
| 44.41002 | 0.298 |
| 44.42002 | 0.329 |
| 44.43002 | 0.351 |
| 44.44003 | 0.365 |
| 44.45002 | 0.372 |
| 44.46002 | 0.374 |
| 44.47002 | 0.37 |
| 44.48002 | 0.36 |
| 44.49002 | 0.341 |
| 44.50002 | 0.311 |
| 44.51003 | 0.268 |
| 44.52002 | 0.213 |
| 44.53003 | 0.148 |
| 44.54002 | 0.079 |
| 44.55002 | 0.015 |
| 44.56002 | -0.035 |
| 44.57002 | -0.064 |
| 44.58002 | -0.067 |
| 44.59002 | -0.044 |
| 44.60003 | -0.001 |
| 44.61002 | 0.054 |
| 44.62003 | 0.109 |
| 44.63002 | 0.156 |
| 44.64002 | 0.19 |
| 44.65002 | 0.211 |
| 44.66002 | 0.223 |
| 44.67002 | 0.234 |
| 44.68002 | 0.248 |
| 44.69003 | 0.269 |
| 44.70002 | 0.293 |
| 44.71003 | 0.313 |
| 44.72002 | 0.319 |
| 44.73002 | 0.302 |
| 44.74002 | 0.257 |
| 44.75002 | 0.188 |
| 44.76003 | 0.106 |
| 44.77002 | 0.024 |
| 44.78003 | -0.04 |
| 44.79002 | -0.075 |
| 44.80003 | -0.075 |
| 44.81002 | -0.044 |
| 44.82002 | 0.008 |
| 44.83002 | 0.066 |
| 44.84002 | 0.119 |
| 44.85003 | 0.159 |
| 44.86002 | 0.187 |
| 44.87003 | 0.207 |
| 44.88002 | 0.228 |
| 44.89002 | 0.257 |
| 44.90002 | 0.297 |
| 44.91002 | 0.342 |
| 44.92002 | 0.385 |
| 44.93002 | 0.414 |
| 44.94003 | 0.423 |
| 44.95002 | 0.408 |
| 44.96003 | 0.375 |
| 44.97002 | 0.332 |
| 44.98002 | 0.288 |
| 44.99002 | 0.25 |
| 45.00002 | 0.22 |
| 45.01003 | 0.194 |
| 45.02002 | 0.165 |
| 45.03003 | 0.128 |
| 45.04002 | 0.079 |
| 45.05003 | 0.022 |
| 45.06002 | -0.037 |
| 45.07002 | -0.086 |
| 45.08002 | -0.117 |
| 45.09002 | -0.126 |
| 45.10003 | -0.113 |
| 45.11002 | -0.084 |
| 45.12003 | -0.049 |
| 45.13002 | -0.014 |
| 45.14003 | 0.014 |
| 45.15002 | 0.035 |
| 45.16002 | 0.052 |
| 45.17002 | 0.068 |
| 45.18002 | 0.087 |
| 45.19003 | 0.111 |
| 45.20002 | 0.142 |
| 45.21003 | 0.177 |
| 45.22002 | 0.217 |
| 45.23002 | 0.26 |
| 45.24002 | 0.307 |
| 45.25002 | 0.358 |
| 45.26003 | 0.412 |
| 45.27002 | 0.466 |
| 45.28003 | 0.515 |
| 45.29002 | 0.554 |
| 45.30003 | 0.578 |
| 45.31002 | 0.586 |
| 45.32002 | 0.576 |
| 45.33002 | 0.553 |
| 45.34002 | 0.521 |
| 45.35003 | 0.486 |
| 45.36002 | 0.45 |
| 45.37003 | 0.415 |
| 45.38002 | 0.382 |
| 45.39003 | 0.347 |
| 45.40002 | 0.312 |
| 45.41002 | 0.278 |
| 45.42002 | 0.245 |
| 45.43002 | 0.217 |
| 45.44003 | 0.197 |
| 45.45002 | 0.186 |
| 45.46003 | 0.182 |
| 45.47002 | 0.185 |
| 45.48003 | 0.19 |
| 45.49002 | 0.196 |
| 45.50002 | 0.2 |
| 45.51003 | 0.205 |
| 45.52002 | 0.213 |
| 45.53003 | 0.228 |
| 45.54002 | 0.252 |
| 45.55003 | 0.284 |
| 45.56002 | 0.325 |
| 45.57002 | 0.368 |
| 45.58002 | 0.41 |
| 45.59002 | 0.445 |
| 45.60003 | 0.471 |
| 45.61002 | 0.486 |
| 45.62003 | 0.493 |
| 45.63002 | 0.494 |
| 45.64003 | 0.492 |
| 45.65002 | 0.491 |
| 45.66002 | 0.495 |
| 45.67002 | 0.506 |
| 45.68002 | 0.523 |
| 45.69003 | 0.546 |
| 45.70002 | 0.572 |
| 45.71003 | 0.597 |
| 45.72002 | 0.618 |
| 45.73003 | 0.628 |
| 45.74002 | 0.625 |
| 45.75002 | 0.605 |
| 45.76003 | 0.569 |
| 45.77002 | 0.52 |
| 45.78003 | 0.462 |
| 45.79002 | 0.404 |
| 45.80003 | 0.35 |
| 45.81002 | 0.305 |
| 45.82003 | 0.271 |
| 45.83002 | 0.25 |
| 45.84002 | 0.238 |
| 45.85003 | 0.234 |
| 45.86002 | 0.235 |
| 45.87003 | 0.24 |
| 45.88002 | 0.248 |
| 45.89003 | 0.258 |
| 45.90002 | 0.272 |
| 45.91002 | 0.287 |
| 45.92002 | 0.303 |
| 45.93002 | 0.319 |
| 45.94003 | 0.332 |
| 45.95002 | 0.34 |
| 45.96003 | 0.342 |
| 45.97002 | 0.339 |
| 45.98003 | 0.329 |
| 45.99002 | 0.315 |
| 46.00002 | 0.296 |
| 46.01003 | 0.274 |
| 46.02002 | 0.252 |
| 46.03003 | 0.231 |
| 46.04002 | 0.212 |
| 46.05003 | 0.198 |
| 46.06002 | 0.19 |
| 46.07003 | 0.189 |
| 46.08002 | 0.192 |
| 46.09002 | 0.199 |
| 46.10003 | 0.207 |
| 46.11002 | 0.213 |
| 46.12003 | 0.216 |
| 46.13002 | 0.216 |
| 46.14003 | 0.216 |
| 46.15002 | 0.218 |
| 46.16003 | 0.228 |
| 46.17002 | 0.248 |
| 46.18002 | 0.28 |
| 46.19003 | 0.323 |
| 46.20002 | 0.372 |
| 46.21003 | 0.421 |
| 46.22002 | 0.466 |
| 46.23003 | 0.499 |
| 46.24002 | 0.52 |
| 46.25003 | 0.529 |
| 46.26003 | 0.528 |
| 46.27002 | 0.522 |
| 46.28003 | 0.513 |
| 46.29002 | 0.506 |
| 46.30003 | 0.503 |
| 46.31002 | 0.503 |
| 46.32003 | 0.507 |
| 46.33002 | 0.515 |
| 46.34002 | 0.529 |
| 46.35003 | 0.548 |
| 46.36002 | 0.574 |
| 46.37003 | 0.604 |
| 46.38002 | 0.634 |
| 46.39003 | 0.659 |
| 46.40002 | 0.672 |
| 46.41003 | 0.668 |
| 46.42002 | 0.646 |
| 46.43002 | 0.607 |
| 46.44003 | 0.555 |
| 46.45002 | 0.497 |
| 46.46003 | 0.441 |
| 46.47002 | 0.392 |
| 46.48003 | 0.353 |
| 46.49002 | 0.325 |
| 46.50003 | 0.305 |
| 46.51003 | 0.291 |
| 46.52002 | 0.28 |
| 46.53003 | 0.271 |
| 46.54002 | 0.262 |
| 46.55003 | 0.254 |
| 46.56002 | 0.247 |
| 46.57003 | 0.241 |
| 46.58002 | 0.236 |
| 46.59003 | 0.232 |
| 46.60003 | 0.229 |
| 46.61002 | 0.227 |
| 46.62003 | 0.227 |
| 46.63002 | 0.229 |
| 46.64003 | 0.233 |
| 46.65002 | 0.239 |
| 46.66003 | 0.244 |
| 46.67002 | 0.247 |
| 46.68002 | 0.248 |
| 46.69003 | 0.247 |
| 46.70002 | 0.245 |
| 46.71003 | 0.245 |
| 46.72002 | 0.249 |
| 46.73003 | 0.258 |
| 46.74002 | 0.274 |
| 46.75003 | 0.293 |
| 46.76003 | 0.312 |
| 46.77002 | 0.327 |
| 46.78003 | 0.335 |
| 46.79002 | 0.333 |
| 46.80003 | 0.321 |
| 46.81002 | 0.301 |
| 46.82003 | 0.277 |
| 46.83002 | 0.252 |
| 46.84003 | 0.228 |
| 46.85003 | 0.207 |
| 46.86002 | 0.19 |
| 46.87003 | 0.174 |
| 46.88002 | 0.159 |
| 46.89003 | 0.146 |
| 46.90002 | 0.135 |
| 46.91003 | 0.128 |
| 46.92002 | 0.128 |
| 46.93003 | 0.136 |
| 46.94003 | 0.154 |
| 46.95002 | 0.179 |
| 46.96003 | 0.207 |
| 46.97002 | 0.232 |
| 46.98003 | 0.248 |
| 46.99002 | 0.252 |
| 47.00003 | 0.242 |
| 47.01003 | 0.217 |
| 47.02002 | 0.183 |
| 47.03003 | 0.143 |
| 47.04002 | 0.103 |
| 47.05003 | 0.069 |
| 47.06002 | 0.045 |
| 47.07003 | 0.032 |
| 47.08002 | 0.033 |
| 47.09003 | 0.048 |
| 47.10003 | 0.075 |
| 47.11002 | 0.112 |
| 47.12003 | 0.155 |
| 47.13002 | 0.2 |
| 47.14003 | 0.24 |
| 47.15002 | 0.271 |
| 47.16003 | 0.289 |
| 47.17002 | 0.292 |
| 47.18003 | 0.282 |
| 47.19003 | 0.263 |
| 47.20002 | 0.243 |
| 47.21003 | 0.227 |
| 47.22002 | 0.221 |
| 47.23003 | 0.228 |
| 47.24002 | 0.246 |
| 47.25003 | 0.272 |
| 47.26003 | 0.3 |
| 47.27003 | 0.326 |
| 47.28003 | 0.345 |
| 47.29002 | 0.356 |
| 47.30003 | 0.362 |
| 47.31002 | 0.365 |
| 47.32003 | 0.369 |
| 47.33002 | 0.378 |
| 47.34003 | 0.393 |
| 47.35003 | 0.413 |
| 47.36002 | 0.436 |
| 47.37003 | 0.457 |
| 47.38002 | 0.473 |
| 47.39003 | 0.484 |
| 47.40002 | 0.49 |
| 47.41003 | 0.493 |
| 47.42002 | 0.496 |
| 47.43003 | 0.501 |
| 47.44003 | 0.509 |
| 47.45002 | 0.518 |
| 47.46003 | 0.524 |
| 47.47002 | 0.521 |
| 47.48003 | 0.506 |
| 47.49002 | 0.478 |
| 47.50003 | 0.437 |
| 47.51003 | 0.389 |
| 47.52003 | 0.339 |
| 47.53003 | 0.294 |
| 47.54002 | 0.259 |
| 47.55003 | 0.235 |
| 47.56002 | 0.221 |
| 47.57003 | 0.212 |
| 47.58002 | 0.204 |
| 47.59003 | 0.194 |
| 47.60003 | 0.181 |
| 47.61003 | 0.164 |
| 47.62003 | 0.148 |
| 47.63002 | 0.132 |
| 47.64003 | 0.119 |
| 47.65002 | 0.108 |
| 47.66003 | 0.096 |
| 47.67002 | 0.083 |
| 47.68003 | 0.068 |
| 47.69003 | 0.05 |
| 47.70003 | 0.033 |
| 47.71003 | 0.02 |
| 47.72002 | 0.014 |
| 47.73003 | 0.019 |
| 47.74002 | 0.034 |
| 47.75003 | 0.059 |
| 47.76003 | 0.091 |
| 47.77003 | 0.128 |
| 47.78003 | 0.166 |
| 47.79002 | 0.204 |
| 47.80003 | 0.24 |
| 47.81002 | 0.272 |
| 47.82003 | 0.298 |
| 47.83002 | 0.316 |
| 47.84003 | 0.327 |
| 47.85003 | 0.33 |
| 47.86003 | 0.324 |
| 47.87003 | 0.314 |
| 47.88002 | 0.301 |
| 47.89003 | 0.287 |
| 47.90002 | 0.274 |
| 47.91003 | 0.264 |
| 47.92002 | 0.256 |
| 47.93003 | 0.25 |
| 47.94003 | 0.245 |
| 47.95003 | 0.241 |
| 47.96003 | 0.238 |
| 47.97002 | 0.234 |
| 47.98003 | 0.231 |
| 47.99002 | 0.227 |
| 48.00003 | 0.224 |
| 48.01003 | 0.22 |
| 48.02003 | 0.216 |
| 48.03003 | 0.213 |
| 48.04003 | 0.21 |
| 48.05003 | 0.208 |
| 48.06002 | 0.207 |
| 48.07003 | 0.206 |
| 48.08002 | 0.204 |
| 48.09003 | 0.202 |
| 48.10003 | 0.201 |
| 48.11003 | 0.203 |
| 48.12003 | 0.209 |
| 48.13002 | 0.224 |
| 48.14003 | 0.246 |
| 48.15002 | 0.275 |
| 48.16003 | 0.308 |
| 48.17002 | 0.34 |
| 48.18003 | 0.366 |
| 48.19003 | 0.382 |
| 48.20003 | 0.388 |
| 48.21003 | 0.385 |
| 48.22002 | 0.375 |
| 48.23003 | 0.364 |
| 48.24002 | 0.353 |
| 48.25003 | 0.347 |
| 48.26003 | 0.345 |
| 48.27003 | 0.347 |
| 48.28003 | 0.349 |
| 48.29003 | 0.351 |
| 48.30003 | 0.351 |
| 48.31002 | 0.35 |
| 48.32003 | 0.35 |
| 48.33002 | 0.353 |
| 48.34003 | 0.362 |
| 48.35003 | 0.378 |
| 48.36003 | 0.401 |
| 48.37003 | 0.426 |
| 48.38003 | 0.451 |
| 48.39003 | 0.471 |
| 48.40002 | 0.481 |
| 48.41003 | 0.48 |
| 48.42002 | 0.469 |
| 48.43003 | 0.448 |
| 48.44003 | 0.421 |
| 48.45003 | 0.393 |
| 48.46003 | 0.368 |
| 48.47002 | 0.348 |
| 48.48003 | 0.334 |
| 48.49002 | 0.327 |
| 48.50003 | 0.324 |
| 48.51003 | 0.324 |
| 48.52003 | 0.325 |
| 48.53003 | 0.325 |
| 48.54003 | 0.325 |
| 48.55003 | 0.325 |
| 48.56002 | 0.325 |
| 48.57003 | 0.326 |
| 48.58002 | 0.329 |
| 48.59003 | 0.331 |
| 48.60003 | 0.331 |
| 48.61003 | 0.328 |
| 48.62003 | 0.319 |
| 48.63003 | 0.304 |
| 48.64003 | 0.282 |
| 48.65002 | 0.256 |
| 48.66003 | 0.227 |
| 48.67002 | 0.2 |
| 48.68003 | 0.177 |
| 48.69003 | 0.161 |
| 48.70003 | 0.153 |
| 48.71003 | 0.152 |
| 48.72003 | 0.157 |
| 48.73003 | 0.164 |
| 48.74002 | 0.169 |
| 48.75003 | 0.172 |
| 48.76003 | 0.172 |
| 48.77003 | 0.17 |
| 48.78003 | 0.167 |
| 48.79003 | 0.169 |
| 48.80003 | 0.176 |
| 48.81003 | 0.191 |
| 48.82003 | 0.214 |
| 48.83002 | 0.244 |
| 48.84003 | 0.276 |
| 48.85003 | 0.31 |
| 48.86003 | 0.34 |
| 48.87003 | 0.367 |
| 48.88003 | 0.389 |
| 48.89003 | 0.408 |
| 48.90002 | 0.424 |
| 48.91003 | 0.437 |
| 48.92002 | 0.449 |
| 48.93003 | 0.458 |
| 48.94003 | 0.463 |
| 48.95003 | 0.464 |
| 48.96003 | 0.46 |
| 48.97003 | 0.452 |
| 48.98003 | 0.441 |
| 48.99002 | 0.43 |
| 49.00003 | 0.42 |
| 49.01003 | 0.412 |
| 49.02003 | 0.407 |
| 49.03003 | 0.404 |
| 49.04003 | 0.4 |
| 49.05003 | 0.394 |
| 49.06003 | 0.382 |
| 49.07003 | 0.365 |
| 49.08002 | 0.34 |
| 49.09003 | 0.311 |
| 49.10003 | 0.28 |
| 49.11003 | 0.248 |
| 49.12003 | 0.222 |
| 49.13003 | 0.202 |
| 49.14003 | 0.192 |
| 49.15003 | 0.193 |
| 49.16003 | 0.204 |
| 49.17002 | 0.223 |
| 49.18003 | 0.248 |
| 49.19003 | 0.274 |
| 49.20003 | 0.3 |
| 49.21003 | 0.323 |
| 49.22003 | 0.341 |
| 49.23003 | 0.354 |
| 49.24002 | 0.363 |
| 49.25003 | 0.368 |
| 49.26003 | 0.372 |
| 49.27003 | 0.376 |
| 49.28003 | 0.381 |
| 49.29003 | 0.388 |
| 49.30003 | 0.397 |
| 49.31003 | 0.406 |
| 49.32003 | 0.417 |
| 49.33002 | 0.426 |
| 49.34003 | 0.431 |
| 49.35003 | 0.431 |
| 49.36003 | 0.424 |
| 49.37003 | 0.411 |
| 49.38003 | 0.391 |
| 49.39003 | 0.368 |
| 49.40003 | 0.343 |
| 49.41003 | 0.321 |
| 49.42002 | 0.301 |
| 49.43003 | 0.286 |
| 49.44003 | 0.274 |
| 49.45003 | 0.262 |
| 49.46003 | 0.25 |
| 49.47003 | 0.236 |
| 49.48003 | 0.219 |
| 49.49003 | 0.201 |
| 49.50003 | 0.182 |
| 49.51003 | 0.166 |
| 49.52003 | 0.153 |
| 49.53003 | 0.144 |
| 49.54003 | 0.139 |
| 49.55003 | 0.137 |
| 49.56003 | 0.138 |
| 49.57003 | 0.141 |
| 49.58002 | 0.146 |
| 49.59003 | 0.155 |
| 49.60003 | 0.167 |
| 49.61003 | 0.182 |
| 49.62003 | 0.199 |
| 49.63003 | 0.216 |
| 49.64003 | 0.232 |
| 49.65003 | 0.245 |
| 49.66003 | 0.255 |
| 49.67002 | 0.262 |
| 49.68003 | 0.266 |
| 49.69003 | 0.268 |
| 49.70003 | 0.269 |
| 49.71003 | 0.27 |
| 49.72003 | 0.272 |
| 49.73003 | 0.275 |
| 49.74003 | 0.278 |
| 49.75003 | 0.282 |
| 49.76003 | 0.287 |
| 49.77003 | 0.292 |
| 49.78003 | 0.299 |
| 49.79003 | 0.306 |
| 49.80003 | 0.315 |
| 49.81003 | 0.325 |
| 49.82003 | 0.339 |
| 49.83003 | 0.356 |
| 49.84003 | 0.375 |
| 49.85003 | 0.395 |
| 49.86003 | 0.413 |
| 49.87003 | 0.428 |
| 49.88003 | 0.437 |
| 49.89003 | 0.438 |
| 49.90003 | 0.432 |
| 49.91003 | 0.422 |
| 49.92003 | 0.411 |
| 49.93003 | 0.402 |
| 49.94003 | 0.399 |
| 49.95003 | 0.401 |
| 49.96003 | 0.408 |
| 49.97003 | 0.417 |
| 49.98003 | 0.425 |
| 49.99003 | 0.428 |
| 50.00003 | 0.424 |
| 50.01003 | 0.413 |
| 50.02003 | 0.395 |
| 50.03003 | 0.372 |
| 50.04003 | 0.346 |
| 50.05003 | 0.319 |
| 50.06003 | 0.293 |
| 50.07003 | 0.27 |
| 50.08003 | 0.251 |
| 50.09003 | 0.237 |
| 50.10003 | 0.229 |
| 50.11003 | 0.226 |
| 50.12003 | 0.226 |
| 50.13003 | 0.229 |
| 50.14003 | 0.23 |
| 50.15003 | 0.228 |
| 50.16003 | 0.22 |
| 50.17003 | 0.206 |
| 50.18003 | 0.187 |
| 50.19003 | 0.163 |
| 50.20003 | 0.137 |
| 50.21003 | 0.113 |
| 50.22003 | 0.092 |
| 50.23003 | 0.076 |
| 50.24003 | 0.066 |
| 50.25003 | 0.062 |
| 50.26003 | 0.065 |
| 50.27003 | 0.072 |
| 50.28003 | 0.082 |
| 50.29003 | 0.095 |
| 50.30003 | 0.108 |
| 50.31003 | 0.121 |
| 50.32003 | 0.134 |
| 50.33003 | 0.146 |
| 50.34003 | 0.157 |
| 50.35003 | 0.167 |
| 50.36003 | 0.177 |
| 50.37003 | 0.185 |
| 50.38003 | 0.193 |
| 50.39003 | 0.2 |
| 50.40003 | 0.207 |
| 50.41003 | 0.214 |
| 50.42003 | 0.22 |
| 50.43003 | 0.226 |
| 50.44003 | 0.23 |
| 50.45003 | 0.233 |
| 50.46003 | 0.232 |
| 50.47003 | 0.227 |
| 50.48003 | 0.22 |
| 50.49003 | 0.211 |
| 50.50003 | 0.204 |
| 50.51003 | 0.2 |
| 50.52003 | 0.202 |
| 50.53003 | 0.209 |
| 50.54003 | 0.221 |
| 50.55003 | 0.234 |
| 50.56003 | 0.246 |
| 50.57003 | 0.256 |
| 50.58003 | 0.262 |
| 50.59003 | 0.265 |
| 50.60003 | 0.268 |
| 50.61003 | 0.272 |
| 50.62003 | 0.277 |
| 50.63003 | 0.285 |
| 50.64003 | 0.293 |
| 50.65003 | 0.3 |
| 50.66003 | 0.305 |
| 50.67003 | 0.307 |
| 50.68003 | 0.309 |
| 50.69003 | 0.311 |
| 50.70003 | 0.317 |
| 50.71003 | 0.326 |
| 50.72003 | 0.339 |
| 50.73003 | 0.352 |
| 50.74003 | 0.36 |
| 50.75003 | 0.36 |
| 50.76003 | 0.351 |
| 50.77003 | 0.33 |
| 50.78003 | 0.303 |
| 50.79003 | 0.272 |
| 50.80003 | 0.246 |
| 50.81003 | 0.227 |
| 50.82003 | 0.222 |
| 50.83003 | 0.229 |
| 50.84003 | 0.249 |
| 50.85003 | 0.279 |
| 50.86003 | 0.315 |
| 50.87003 | 0.352 |
| 50.88003 | 0.389 |
| 50.89003 | 0.422 |
| 50.90003 | 0.45 |
| 50.91003 | 0.471 |
| 50.92003 | 0.486 |
| 50.93003 | 0.492 |
| 50.94003 | 0.491 |
| 50.95003 | 0.482 |
| 50.96003 | 0.467 |
| 50.97003 | 0.448 |
| 50.98003 | 0.428 |
| 50.99003 | 0.409 |
| 51.00003 | 0.395 |
| 51.01003 | 0.386 |
| 51.02003 | 0.381 |
| 51.03003 | 0.379 |
| 51.04003 | 0.378 |
| 51.05003 | 0.376 |
| 51.06003 | 0.372 |
| 51.07003 | 0.366 |
| 51.08003 | 0.36 |
| 51.09003 | 0.356 |
| 51.10003 | 0.356 |
| 51.11003 | 0.362 |
| 51.12003 | 0.372 |
| 51.13003 | 0.386 |
| 51.14003 | 0.4 |
| 51.15003 | 0.41 |
| 51.16003 | 0.414 |
| 51.17003 | 0.41 |
| 51.18003 | 0.401 |
| 51.19003 | 0.386 |
| 51.20003 | 0.369 |
| 51.21003 | 0.35 |
| 51.22003 | 0.331 |
| 51.23003 | 0.312 |
| 51.24003 | 0.291 |
| 51.25003 | 0.268 |
| 51.26003 | 0.242 |
| 51.27003 | 0.214 |
| 51.28003 | 0.188 |
| 51.29003 | 0.164 |
| 51.30003 | 0.147 |
| 51.31003 | 0.138 |
| 51.32003 | 0.139 |
| 51.33003 | 0.148 |
| 51.34003 | 0.165 |
| 51.35003 | 0.188 |
| 51.36003 | 0.214 |
| 51.37003 | 0.241 |
| 51.38003 | 0.268 |
| 51.39003 | 0.294 |
| 51.40003 | 0.318 |
| 51.41003 | 0.339 |
| 51.42003 | 0.357 |
| 51.43003 | 0.371 |
| 51.44003 | 0.382 |
| 51.45003 | 0.39 |
| 51.46003 | 0.396 |
| 51.47003 | 0.401 |
| 51.48003 | 0.408 |
| 51.49003 | 0.417 |
| 51.50003 | 0.43 |
| 51.51003 | 0.445 |
| 51.52003 | 0.462 |
| 51.53003 | 0.479 |
| 51.54003 | 0.493 |
| 51.55003 | 0.501 |
| 51.56003 | 0.503 |
| 51.57003 | 0.498 |
| 51.58003 | 0.485 |
| 51.59003 | 0.467 |
| 51.60003 | 0.443 |
| 51.61003 | 0.416 |
| 51.62003 | 0.386 |
| 51.63003 | 0.354 |
| 51.64003 | 0.322 |
| 51.65003 | 0.291 |
| 51.66003 | 0.263 |
| 51.67003 | 0.239 |
| 51.68003 | 0.223 |
| 51.69003 | 0.214 |
| 51.70003 | 0.212 |
| 51.71003 | 0.218 |
| 51.72003 | 0.228 |
| 51.73003 | 0.24 |
| 51.74003 | 0.253 |
| 51.75003 | 0.265 |
| 51.76003 | 0.276 |
| 51.77003 | 0.287 |
| 51.78003 | 0.298 |
| 51.79003 | 0.31 |
| 51.80003 | 0.323 |
| 51.81003 | 0.336 |
| 51.82003 | 0.346 |
| 51.83003 | 0.355 |
| 51.84003 | 0.359 |
| 51.85003 | 0.361 |
| 51.86003 | 0.36 |
| 51.87003 | 0.357 |
| 51.88003 | 0.355 |
| 51.89003 | 0.353 |
| 51.90003 | 0.352 |
| 51.91003 | 0.351 |
| 51.92003 | 0.348 |
| 51.93003 | 0.342 |
| 51.94003 | 0.332 |
| 51.95003 | 0.319 |
| 51.96003 | 0.303 |
| 51.97003 | 0.286 |
| 51.98003 | 0.269 |
| 51.99003 | 0.253 |
| 52.00003 | 0.24 |
| 52.01003 | 0.228 |
| 52.02003 | 0.218 |
| 52.03003 | 0.208 |
| 52.04003 | 0.199 |
| 52.05003 | 0.19 |
| 52.06003 | 0.183 |
| 52.07003 | 0.179 |
| 52.08003 | 0.179 |
| 52.09003 | 0.185 |
| 52.10003 | 0.196 |
| 52.11003 | 0.213 |
| 52.12003 | 0.233 |
| 52.13003 | 0.254 |
| 52.14003 | 0.273 |
| 52.15003 | 0.287 |
| 52.16003 | 0.294 |
| 52.17003 | 0.293 |
| 52.18003 | 0.285 |
| 52.19003 | 0.271 |
| 52.20003 | 0.255 |
| 52.21003 | 0.238 |
| 52.22003 | 0.223 |
| 52.23003 | 0.212 |
| 52.24003 | 0.206 |
| 52.25003 | 0.204 |
| 52.26003 | 0.204 |
| 52.27003 | 0.206 |
| 52.28003 | 0.208 |
| 52.29003 | 0.21 |
| 52.30003 | 0.212 |
| 52.31003 | 0.214 |
| 52.32003 | 0.216 |
| 52.33003 | 0.218 |
| 52.34003 | 0.221 |
| 52.35003 | 0.225 |
| 52.36003 | 0.228 |
| 52.37003 | 0.23 |
| 52.38003 | 0.232 |
| 52.39003 | 0.232 |
| 52.40003 | 0.233 |
| 52.41003 | 0.232 |
| 52.42003 | 0.23 |
| 52.43003 | 0.226 |
| 52.44003 | 0.222 |
| 52.45003 | 0.218 |
| 52.46003 | 0.215 |
| 52.47003 | 0.214 |
| 52.48003 | 0.216 |
| 52.49003 | 0.223 |
| 52.50003 | 0.234 |
| 52.51003 | 0.248 |
| 52.52003 | 0.262 |
| 52.53003 | 0.274 |
| 52.54003 | 0.283 |
| 52.55003 | 0.287 |
| 52.56003 | 0.288 |
| 52.57003 | 0.287 |
| 52.58003 | 0.285 |
| 52.59003 | 0.284 |
| 52.60003 | 0.286 |
| 52.61003 | 0.29 |
| 52.62003 | 0.295 |
| 52.63003 | 0.301 |
| 52.64003 | 0.304 |
| 52.65003 | 0.305 |
| 52.66003 | 0.302 |
| 52.67003 | 0.296 |
| 52.68003 | 0.286 |
| 52.69003 | 0.274 |
| 52.70003 | 0.26 |
| 52.71003 | 0.244 |
| 52.72003 | 0.229 |
| 52.73003 | 0.213 |
| 52.74003 | 0.199 |
| 52.75003 | 0.187 |
| 52.76003 | 0.179 |
| 52.77003 | 0.174 |
| 52.78003 | 0.175 |
| 52.79003 | 0.179 |
| 52.80003 | 0.187 |
| 52.81003 | 0.194 |
| 52.82003 | 0.201 |
| 52.83003 | 0.205 |
| 52.84003 | 0.205 |
| 52.85003 | 0.203 |
| 52.86003 | 0.201 |
| 52.87003 | 0.2 |
| 52.88003 | 0.201 |
| 52.89003 | 0.207 |
| 52.90003 | 0.217 |
| 52.91003 | 0.23 |
| 52.92003 | 0.245 |
| 52.93003 | 0.26 |
| 52.94003 | 0.275 |
| 52.95003 | 0.29 |
| 52.96003 | 0.305 |
| 52.97003 | 0.32 |
| 52.98003 | 0.334 |
| 52.99003 | 0.347 |
| 53.00003 | 0.356 |
| 53.01003 | 0.361 |
| 53.02003 | 0.361 |
| 53.03003 | 0.356 |
| 53.04003 | 0.346 |
| 53.05003 | 0.336 |
| 53.06003 | 0.325 |
| 53.07003 | 0.317 |
| 53.08003 | 0.311 |
| 53.09003 | 0.307 |
| 53.10003 | 0.302 |
| 53.11003 | 0.296 |
| 53.12003 | 0.287 |
| 53.13003 | 0.276 |
| 53.14003 | 0.263 |
| 53.15003 | 0.25 |
| 53.16003 | 0.239 |
| 53.17003 | 0.231 |
| 53.18003 | 0.228 |
| 53.19003 | 0.228 |
| 53.20003 | 0.233 |
| 53.21003 | 0.24 |
| 53.22003 | 0.251 |
| 53.23003 | 0.265 |
| 53.24003 | 0.28 |
| 53.25003 | 0.296 |
| 53.26003 | 0.312 |
| 53.27003 | 0.327 |
| 53.28003 | 0.339 |
| 53.29003 | 0.347 |
| 53.30003 | 0.351 |
| 53.31003 | 0.352 |
| 53.32003 | 0.352 |
| 53.33003 | 0.353 |
| 53.34003 | 0.356 |
| 53.35003 | 0.363 |
| 53.36003 | 0.373 |
| 53.37003 | 0.385 |
| 53.38003 | 0.397 |
| 53.39003 | 0.406 |
| 53.40003 | 0.412 |
| 53.41003 | 0.411 |
| 53.42003 | 0.405 |
| 53.43003 | 0.394 |
| 53.44003 | 0.381 |
| 53.45003 | 0.366 |
| 53.46003 | 0.351 |
| 53.47003 | 0.336 |
| 53.48003 | 0.323 |
| 53.49003 | 0.31 |
| 53.50003 | 0.3 |
| 53.51003 | 0.292 |
| 53.52003 | 0.289 |
| 53.53003 | 0.29 |
| 53.54003 | 0.296 |
| 53.55003 | 0.305 |
| 53.56003 | 0.315 |
| 53.57003 | 0.324 |
| 53.58003 | 0.33 |
| 53.59003 | 0.331 |
| 53.60003 | 0.327 |
| 53.61003 | 0.32 |
| 53.62003 | 0.31 |
| 53.63003 | 0.3 |
| 53.64003 | 0.29 |
| 53.65003 | 0.281 |
| 53.66003 | 0.272 |
| 53.67003 | 0.261 |
| 53.68003 | 0.25 |
| 53.69003 | 0.238 |
| 53.70003 | 0.227 |
| 53.71003 | 0.218 |
| 53.72003 | 0.211 |
| 53.73003 | 0.209 |
| 53.74003 | 0.21 |
| 53.75003 | 0.214 |
| 53.76003 | 0.219 |
| 53.77003 | 0.223 |
| 53.78003 | 0.227 |
| 53.79003 | 0.228 |
| 53.80003 | 0.228 |
| 53.81003 | 0.228 |
| 53.82003 | 0.228 |
| 53.83003 | 0.229 |
| 53.84003 | 0.232 |
| 53.85003 | 0.239 |
| 53.86003 | 0.248 |
| 53.87003 | 0.261 |
| 53.88003 | 0.275 |
| 53.89003 | 0.289 |
| 53.90003 | 0.302 |
| 53.91003 | 0.311 |
| 53.92003 | 0.315 |
| 53.93003 | 0.314 |
| 53.94003 | 0.308 |
| 53.95003 | 0.298 |
| 53.96003 | 0.289 |
| 53.97003 | 0.281 |
| 53.98003 | 0.276 |
| 53.99003 | 0.277 |
| 54.00003 | 0.284 |
| 54.01003 | 0.295 |
| 54.02003 | 0.311 |
| 54.03003 | 0.33 |
| 54.04003 | 0.35 |
| 54.05003 | 0.372 |
| 54.06003 | 0.394 |
| 54.07003 | 0.415 |
| 54.08003 | 0.432 |
| 54.09003 | 0.445 |
| 54.10003 | 0.452 |
| 54.11003 | 0.452 |
| 54.12003 | 0.446 |
| 54.13003 | 0.434 |
| 54.14003 | 0.42 |
| 54.15003 | 0.405 |
| 54.16003 | 0.391 |
| 54.17003 | 0.379 |
| 54.18003 | 0.369 |
| 54.19003 | 0.36 |
| 54.20003 | 0.352 |
| 54.21003 | 0.343 |
| 54.22003 | 0.334 |
| 54.23003 | 0.324 |
| 54.24003 | 0.315 |
| 54.25003 | 0.309 |
| 54.26003 | 0.304 |
| 54.27003 | 0.302 |
| 54.28003 | 0.302 |
| 54.29003 | 0.302 |
| 54.30003 | 0.302 |
| 54.31003 | 0.302 |
| 54.32003 | 0.301 |
| 54.33003 | 0.301 |
| 54.34003 | 0.302 |
| 54.35003 | 0.304 |
| 54.36003 | 0.306 |
| 54.37003 | 0.309 |
| 54.38003 | 0.312 |
| 54.39003 | 0.313 |
| 54.40003 | 0.313 |
| 54.41003 | 0.312 |
| 54.42003 | 0.312 |
| 54.43003 | 0.313 |
| 54.44003 | 0.317 |
| 54.45003 | 0.324 |
| 54.46003 | 0.332 |
| 54.47003 | 0.342 |
| 54.48003 | 0.351 |
| 54.49003 | 0.359 |
| 54.50003 | 0.364 |
| 54.51003 | 0.366 |
| 54.52003 | 0.365 |
| 54.53003 | 0.36 |
| 54.54003 | 0.351 |
| 54.55003 | 0.34 |
| 54.56003 | 0.327 |
| 54.57003 | 0.314 |
| 54.58003 | 0.302 |
| 54.59003 | 0.293 |
| 54.60003 | 0.288 |
| 54.61003 | 0.289 |
| 54.62003 | 0.293 |
| 54.63003 | 0.3 |
| 54.64003 | 0.306 |
| 54.65003 | 0.309 |
| 54.66003 | 0.308 |
| 54.67003 | 0.301 |
| 54.68003 | 0.288 |
| 54.69003 | 0.271 |
| 54.70003 | 0.252 |
| 54.71003 | 0.233 |
| 54.72003 | 0.217 |
| 54.73003 | 0.203 |
| 54.74003 | 0.193 |
| 54.75003 | 0.187 |
| 54.76003 | 0.185 |
| 54.77003 | 0.186 |
| 54.78003 | 0.192 |
| 54.79003 | 0.2 |
| 54.80003 | 0.212 |
| 54.81003 | 0.226 |
| 54.82003 | 0.24 |
| 54.83003 | 0.252 |
| 54.84003 | 0.261 |
| 54.85003 | 0.264 |
| 54.86003 | 0.262 |
| 54.87003 | 0.256 |
| 54.88003 | 0.247 |
| 54.89003 | 0.238 |
| 54.90003 | 0.23 |
| 54.91003 | 0.226 |
| 54.92003 | 0.224 |
| 54.93003 | 0.224 |
| 54.94003 | 0.225 |
| 54.95003 | 0.225 |
| 54.96003 | 0.224 |
| 54.97003 | 0.225 |
| 54.98003 | 0.228 |
| 54.99003 | 0.235 |
| 55.00003 | 0.246 |
| 55.01003 | 0.262 |
| 55.02003 | 0.281 |
| 55.03003 | 0.299 |
| 55.04003 | 0.317 |
| 55.05003 | 0.331 |
| 55.06003 | 0.342 |
| 55.07003 | 0.352 |
| 55.08003 | 0.36 |
| 55.09003 | 0.368 |
| 55.10003 | 0.378 |
| 55.11003 | 0.39 |
| 55.12003 | 0.401 |
| 55.13003 | 0.412 |
| 55.14003 | 0.421 |
| 55.15003 | 0.425 |
| 55.16003 | 0.425 |
| 55.17003 | 0.419 |
| 55.18003 | 0.408 |
| 55.19003 | 0.392 |
| 55.20003 | 0.373 |
| 55.21003 | 0.353 |
| 55.22003 | 0.333 |
| 55.23003 | 0.314 |
| 55.24003 | 0.299 |
| 55.25003 | 0.288 |
| 55.26003 | 0.281 |
| 55.27003 | 0.277 |
| 55.28003 | 0.274 |
| 55.29003 | 0.272 |
| 55.30003 | 0.269 |
| 55.31003 | 0.265 |
| 55.32003 | 0.26 |
| 55.33003 | 0.254 |
| 55.34003 | 0.246 |
| 55.35003 | 0.237 |
| 55.36003 | 0.228 |
| 55.37003 | 0.217 |
| 55.38003 | 0.205 |
| 55.39003 | 0.193 |
| 55.40003 | 0.183 |
| 55.41003 | 0.176 |
| 55.42003 | 0.175 |
| 55.43003 | 0.18 |
| 55.44003 | 0.191 |
| 55.45003 | 0.208 |
| 55.46003 | 0.227 |
| 55.47003 | 0.246 |
| 55.48003 | 0.265 |
| 55.49003 | 0.28 |
| 55.50003 | 0.293 |
| 55.51003 | 0.302 |
| 55.52003 | 0.309 |
| 55.53003 | 0.313 |
| 55.54003 | 0.314 |
| 55.55003 | 0.313 |
| 55.56003 | 0.308 |
| 55.57003 | 0.301 |
| 55.58003 | 0.292 |
| 55.59003 | 0.283 |
| 55.60003 | 0.274 |
| 55.61003 | 0.268 |
| 55.62003 | 0.265 |
| 55.63003 | 0.263 |
| 55.64003 | 0.262 |
| 55.65003 | 0.26 |
| 55.66003 | 0.256 |
| 55.67003 | 0.25 |
| 55.68003 | 0.243 |
| 55.69003 | 0.235 |
| 55.70003 | 0.229 |
| 55.71003 | 0.225 |
| 55.72003 | 0.223 |
| 55.73003 | 0.224 |
| 55.74003 | 0.225 |
| 55.75003 | 0.228 |
| 55.76003 | 0.23 |
| 55.77003 | 0.232 |
| 55.78003 | 0.234 |
| 55.79003 | 0.238 |
| 55.80003 | 0.244 |
| 55.81003 | 0.252 |
| 55.82003 | 0.261 |
| 55.83003 | 0.272 |
| 55.84003 | 0.282 |
| 55.85003 | 0.292 |
| 55.86003 | 0.302 |
| 55.87003 | 0.312 |
| 55.88003 | 0.321 |
| 55.89003 | 0.33 |
| 55.90003 | 0.338 |
| 55.91003 | 0.344 |
| 55.92003 | 0.346 |
| 55.93003 | 0.342 |
| 55.94003 | 0.334 |
| 55.95003 | 0.322 |
| 55.96003 | 0.308 |
| 55.97003 | 0.295 |
| 55.98003 | 0.286 |
| 55.99003 | 0.283 |
| 56.00003 | 0.286 |
| 56.01003 | 0.295 |
| 56.02003 | 0.308 |
| 56.03003 | 0.322 |
| 56.04003 | 0.334 |
| 56.05003 | 0.344 |
| 56.06003 | 0.348 |
| 56.07003 | 0.35 |
| 56.08003 | 0.347 |
| 56.09003 | 0.344 |
| 56.10003 | 0.339 |
| 56.11003 | 0.334 |
| 56.12003 | 0.33 |
| 56.13003 | 0.325 |
| 56.14003 | 0.32 |
| 56.15003 | 0.315 |
| 56.16003 | 0.31 |
| 56.17003 | 0.304 |
| 56.18003 | 0.299 |
| 56.19003 | 0.295 |
| 56.20003 | 0.291 |
| 56.21003 | 0.286 |
| 56.22003 | 0.282 |
| 56.23003 | 0.277 |
| 56.24003 | 0.272 |
| 56.25003 | 0.269 |
| 56.26003 | 0.268 |
| 56.27003 | 0.27 |
| 56.28003 | 0.275 |
| 56.29003 | 0.281 |
| 56.30003 | 0.288 |
| 56.31003 | 0.293 |
| 56.32003 | 0.294 |
| 56.33003 | 0.291 |
| 56.34003 | 0.284 |
| 56.35003 | 0.274 |
| 56.36003 | 0.263 |
| 56.37003 | 0.252 |
| 56.38003 | 0.244 |
| 56.39003 | 0.239 |
| 56.40003 | 0.238 |
| 56.41003 | 0.241 |
| 56.42003 | 0.245 |
| 56.43003 | 0.249 |
| 56.44003 | 0.253 |
| 56.45003 | 0.256 |
| 56.46003 | 0.258 |
| 56.47003 | 0.258 |
| 56.48003 | 0.258 |
| 56.49003 | 0.258 |
| 56.50003 | 0.26 |
| 56.51003 | 0.264 |
| 56.52003 | 0.27 |
| 56.53003 | 0.279 |
| 56.54003 | 0.29 |
| 56.55003 | 0.303 |
| 56.56003 | 0.317 |
| 56.57003 | 0.33 |
| 56.58003 | 0.341 |
| 56.59003 | 0.349 |
| 56.60003 | 0.355 |
| 56.61003 | 0.358 |
| 56.62003 | 0.359 |
| 56.63003 | 0.359 |
| 56.64003 | 0.358 |
| 56.65003 | 0.358 |
| 56.66003 | 0.359 |
| 56.67003 | 0.362 |
| 56.68003 | 0.366 |
| 56.69003 | 0.372 |
| 56.70003 | 0.378 |
| 56.71003 | 0.386 |
| 56.72003 | 0.392 |
| 56.73003 | 0.397 |
| 56.74003 | 0.398 |
| 56.75003 | 0.396 |
| 56.76003 | 0.389 |
| 56.77003 | 0.378 |
| 56.78003 | 0.365 |
| 56.79003 | 0.35 |
| 56.80003 | 0.336 |
| 56.81003 | 0.322 |
| 56.82003 | 0.31 |
| 56.83003 | 0.301 |
| 56.84003 | 0.294 |
| 56.85003 | 0.29 |
| 56.86003 | 0.288 |
| 56.87003 | 0.287 |
| 56.88003 | 0.288 |
| 56.89003 | 0.29 |
| 56.90003 | 0.293 |
| 56.91003 | 0.297 |
| 56.92003 | 0.3 |
| 56.93003 | 0.302 |
| 56.94003 | 0.303 |
| 56.95003 | 0.302 |
| 56.96003 | 0.301 |
| 56.97003 | 0.3 |
| 56.98003 | 0.301 |
| 56.99003 | 0.304 |
| 57.00003 | 0.31 |
| 57.01003 | 0.316 |
| 57.02003 | 0.323 |
| 57.03003 | 0.328 |
| 57.04003 | 0.331 |
| 57.05003 | 0.33 |
| 57.06003 | 0.325 |
| 57.07003 | 0.317 |
| 57.08003 | 0.308 |
| 57.09003 | 0.298 |
| 57.10003 | 0.291 |
| 57.11003 | 0.285 |
| 57.12003 | 0.283 |
| 57.13003 | 0.283 |
| 57.14003 | 0.286 |
| 57.15003 | 0.291 |
| 57.16003 | 0.297 |
| 57.17003 | 0.302 |
| 57.18003 | 0.304 |
| 57.19003 | 0.303 |
| 57.20003 | 0.298 |
| 57.21003 | 0.29 |
| 57.22003 | 0.278 |
| 57.23003 | 0.266 |
| 57.24003 | 0.255 |
| 57.25003 | 0.246 |
| 57.26003 | 0.241 |
| 57.27003 | 0.239 |
| 57.28003 | 0.239 |
| 57.29003 | 0.241 |
| 57.30003 | 0.243 |
| 57.31003 | 0.244 |
| 57.32003 | 0.244 |
| 57.33003 | 0.243 |
| 57.34003 | 0.242 |
| 57.35003 | 0.241 |
| 57.36003 | 0.24 |
| 57.37003 | 0.24 |
| 57.38003 | 0.239 |
| 57.39003 | 0.239 |
| 57.40003 | 0.24 |
| 57.41003 | 0.241 |
| 57.42003 | 0.243 |
| 57.43003 | 0.247 |
| 57.44003 | 0.254 |
| 57.45003 | 0.262 |
| 57.46003 | 0.271 |
| 57.47003 | 0.28 |
| 57.48003 | 0.287 |
| 57.49003 | 0.292 |
| 57.50003 | 0.294 |
| 57.51003 | 0.295 |
| 57.52003 | 0.294 |
| 57.53003 | 0.293 |
| 57.54003 | 0.293 |
| 57.55003 | 0.294 |
| 57.56003 | 0.295 |
| 57.57003 | 0.296 |
| 57.58003 | 0.297 |
| 57.59003 | 0.297 |
| 57.60003 | 0.296 |
| 57.61003 | 0.294 |
| 57.62003 | 0.294 |
| 57.63003 | 0.295 |
| 57.64003 | 0.299 |
| 57.65003 | 0.306 |
| 57.66003 | 0.316 |
| 57.67003 | 0.327 |
| 57.68003 | 0.338 |
| 57.69003 | 0.346 |
| 57.70003 | 0.35 |
| 57.71003 | 0.35 |
| 57.72003 | 0.346 |
| 57.73003 | 0.338 |
| 57.74003 | 0.328 |
| 57.75003 | 0.319 |
| 57.76003 | 0.31 |
| 57.77003 | 0.304 |
| 57.78003 | 0.299 |
| 57.79003 | 0.297 |
| 57.80003 | 0.295 |
| 57.81003 | 0.294 |
| 57.82003 | 0.293 |
| 57.83003 | 0.29 |
| 57.84003 | 0.286 |
| 57.85003 | 0.28 |
| 57.86003 | 0.272 |
| 57.87003 | 0.261 |
| 57.88003 | 0.247 |
| 57.89003 | 0.232 |
| 57.90003 | 0.217 |
| 57.91003 | 0.202 |
| 57.92003 | 0.189 |
| 57.93003 | 0.179 |
| 57.94003 | 0.175 |
| 57.95003 | 0.175 |
| 57.96003 | 0.179 |
| 57.97003 | 0.187 |
| 57.98003 | 0.196 |
| 57.99003 | 0.206 |
| 58.00003 | 0.216 |
| 58.01003 | 0.226 |
| 58.02003 | 0.234 |
| 58.03003 | 0.242 |
| 58.04003 | 0.25 |
| 58.05003 | 0.259 |
| 58.06003 | 0.267 |
| 58.07003 | 0.276 |
| 58.08003 | 0.284 |
| 58.09003 | 0.291 |
| 58.10003 | 0.297 |
| 58.11003 | 0.303 |
| 58.12003 | 0.307 |
| 58.13003 | 0.31 |
| 58.14003 | 0.312 |
| 58.15003 | 0.313 |
| 58.16003 | 0.313 |
| 58.17003 | 0.312 |
| 58.18003 | 0.311 |
| 58.19003 | 0.309 |
| 58.20003 | 0.306 |
| 58.21003 | 0.303 |
| 58.22003 | 0.299 |
| 58.23003 | 0.296 |
| 58.24003 | 0.292 |
| 58.25003 | 0.289 |
| 58.26003 | 0.286 |
| 58.27003 | 0.282 |
| 58.28003 | 0.279 |
| 58.29003 | 0.275 |
| 58.30003 | 0.272 |
| 58.31003 | 0.269 |
| 58.32003 | 0.265 |
| 58.33003 | 0.262 |
| 58.34003 | 0.26 |
| 58.35003 | 0.258 |
| 58.36003 | 0.258 |
| 58.37003 | 0.259 |
| 58.38003 | 0.263 |
| 58.39003 | 0.27 |
| 58.40003 | 0.279 |
| 58.41003 | 0.29 |
| 58.42003 | 0.301 |
| 58.43003 | 0.311 |
| 58.44003 | 0.318 |
| 58.45003 | 0.323 |
| 58.46003 | 0.323 |
| 58.47003 | 0.319 |
| 58.48003 | 0.313 |
| 58.49003 | 0.306 |
| 58.50003 | 0.299 |
| 58.51003 | 0.295 |
| 58.52003 | 0.295 |
| 58.53003 | 0.298 |
| 58.54003 | 0.305 |
| 58.55003 | 0.314 |
| 58.56003 | 0.322 |
| 58.57003 | 0.329 |
| 58.58003 | 0.334 |
| 58.59003 | 0.336 |
| 58.60003 | 0.337 |
| 58.61003 | 0.336 |
| 58.62003 | 0.335 |
| 58.63003 | 0.335 |
| 58.64003 | 0.334 |
| 58.65003 | 0.333 |
| 58.66003 | 0.331 |
| 58.67003 | 0.329 |
| 58.68003 | 0.326 |
| 58.69003 | 0.325 |
| 58.70003 | 0.325 |
| 58.71003 | 0.327 |
| 58.72003 | 0.331 |
| 58.73003 | 0.337 |
| 58.74003 | 0.343 |
| 58.75003 | 0.35 |
| 58.76003 | 0.355 |
| 58.77003 | 0.359 |
| 58.78003 | 0.362 |
| 58.79003 | 0.364 |
| 58.80003 | 0.366 |
| 58.81003 | 0.367 |
| 58.82003 | 0.367 |
| 58.83003 | 0.367 |
| 58.84003 | 0.364 |
| 58.85003 | 0.359 |
| 58.86003 | 0.352 |
| 58.87003 | 0.344 |
| 58.88003 | 0.334 |
| 58.89003 | 0.324 |
| 58.90003 | 0.316 |
| 58.91003 | 0.308 |
| 58.92003 | 0.303 |
| 58.93003 | 0.298 |
| 58.94003 | 0.294 |
| 58.95003 | 0.288 |
| 58.96003 | 0.282 |
| 58.97003 | 0.274 |
| 58.98003 | 0.265 |
| 58.99003 | 0.254 |
| 59.00003 | 0.245 |
| 59.01003 | 0.237 |
| 59.02003 | 0.232 |
| 59.03003 | 0.231 |
| 59.04003 | 0.235 |
| 59.05003 | 0.242 |
| 59.06003 | 0.251 |
| 59.07003 | 0.261 |
| 59.08003 | 0.27 |
| 59.09003 | 0.278 |
| 59.10003 | 0.283 |
| 59.11003 | 0.287 |
| 59.12003 | 0.29 |
| 59.13003 | 0.293 |
| 59.14003 | 0.295 |
| 59.15003 | 0.298 |
| 59.16003 | 0.301 |
| 59.17003 | 0.304 |
| 59.18003 | 0.306 |
| 59.19003 | 0.31 |
| 59.20003 | 0.315 |
| 59.21003 | 0.322 |
| 59.22003 | 0.331 |
| 59.23003 | 0.341 |
| 59.24003 | 0.352 |
| 59.25003 | 0.36 |
| 59.26003 | 0.365 |
| 59.27003 | 0.366 |
| 59.28003 | 0.362 |
| 59.29003 | 0.354 |
| 59.30003 | 0.343 |
| 59.31003 | 0.332 |
| 59.32003 | 0.321 |
| 59.33003 | 0.312 |
| 59.34003 | 0.304 |
| 59.35003 | 0.298 |
| 59.36003 | 0.293 |
| 59.37003 | 0.289 |
| 59.38003 | 0.286 |
| 59.39003 | 0.283 |
| 59.40003 | 0.282 |
| 59.41003 | 0.282 |
| 59.42003 | 0.283 |
| 59.43003 | 0.285 |
| 59.44003 | 0.286 |
| 59.45003 | 0.286 |
| 59.46003 | 0.286 |
| 59.47003 | 0.285 |
| 59.48003 | 0.285 |
| 59.49003 | 0.285 |
| 59.50003 | 0.287 |
| 59.51003 | 0.29 |
| 59.52003 | 0.294 |
| 59.53003 | 0.3 |
| 59.54003 | 0.304 |
| 59.55003 | 0.309 |
| 59.56003 | 0.312 |
| 59.57003 | 0.314 |
| 59.58003 | 0.314 |
| 59.59003 | 0.314 |
| 59.60003 | 0.313 |
| 59.61003 | 0.312 |
| 59.62003 | 0.31 |
| 59.63003 | 0.308 |
| 59.64003 | 0.306 |
| 59.65003 | 0.304 |
| 59.66003 | 0.302 |
| 59.67003 | 0.3 |
| 59.68003 | 0.297 |
| 59.69003 | 0.293 |
| 59.70003 | 0.288 |
| 59.71003 | 0.282 |
| 59.72003 | 0.276 |
| 59.73003 | 0.268 |
| 59.74003 | 0.261 |
| 59.75003 | 0.255 |
| 59.76003 | 0.251 |
| 59.77003 | 0.251 |
| 59.78003 | 0.254 |
| 59.79003 | 0.26 |
| 59.80003 | 0.268 |
| 59.81003 | 0.277 |
| 59.82003 | 0.285 |
| 59.83003 | 0.291 |
| 59.84003 | 0.293 |
| 59.85003 | 0.292 |
| 59.86003 | 0.288 |
| 59.87003 | 0.282 |
| 59.88003 | 0.276 |
| 59.89003 | 0.272 |
| 59.90003 | 0.27 |
| 59.91003 | 0.27 |
| 59.92003 | 0.27 |
| 59.93003 | 0.272 |
| 59.94003 | 0.273 |
| 59.95003 | 0.274 |
| 59.96003 | 0.274 |
| 59.97003 | 0.274 |
| 59.98003 | 0.274 |
| 59.99003 | 0.276 |
| 60.00003 | 0.279 |
| 60.01003 | 0.284 |
| 60.02003 | 0.289 |
| 60.03003 | 0.293 |
| 60.04003 | 0.297 |
| 60.05003 | 0.3 |
| 60.06003 | 0.302 |
| 60.07003 | 0.303 |
| 60.08003 | 0.303 |
| 60.09003 | 0.303 |
| 60.10003 | 0.302 |
| 60.11003 | 0.3 |
| 60.12003 | 0.297 |
| 60.13003 | 0.292 |
| 60.14003 | 0.287 |
| 60.15003 | 0.281 |
| 60.16003 | 0.276 |
| 60.17003 | 0.274 |
| 60.18003 | 0.273 |
| 60.19003 | 0.275 |
| 60.20003 | 0.279 |
| 60.21003 | 0.284 |
| 60.22003 | 0.288 |
| 60.23003 | 0.292 |
| 60.24003 | 0.294 |
| 60.25003 | 0.294 |
| 60.26003 | 0.293 |
| 60.27003 | 0.292 |
| 60.28003 | 0.291 |
| 60.29003 | 0.292 |
| 60.30003 | 0.295 |
| 60.31003 | 0.301 |
| 60.32003 | 0.309 |
| 60.33003 | 0.318 |
| 60.34003 | 0.326 |
| 60.35003 | 0.331 |
| 60.36003 | 0.334 |
| 60.37003 | 0.332 |
| 60.38003 | 0.327 |
| 60.39003 | 0.319 |
| 60.40003 | 0.31 |
| 60.41003 | 0.3 |
| 60.42003 | 0.291 |
| 60.43003 | 0.284 |
| 60.44003 | 0.278 |
| 60.45003 | 0.273 |
| 60.46003 | 0.269 |
| 60.47003 | 0.266 |
| 60.48003 | 0.264 |
| 60.49003 | 0.262 |
| 60.50003 | 0.26 |
| 60.51003 | 0.258 |
| 60.52003 | 0.256 |
| 60.53003 | 0.252 |
| 60.54003 | 0.247 |
| 60.55003 | 0.24 |
| 60.56003 | 0.233 |
| 60.57003 | 0.225 |
| 60.58003 | 0.219 |
| 60.59003 | 0.216 |
| 60.60003 | 0.215 |
| 60.61003 | 0.218 |
| 60.62003 | 0.224 |
| 60.63003 | 0.232 |
| 60.64003 | 0.241 |
| 60.65003 | 0.249 |
| 60.66003 | 0.256 |
| 60.67003 | 0.263 |
| 60.68003 | 0.268 |
| 60.69003 | 0.272 |
| 60.70003 | 0.276 |
| 60.71003 | 0.279 |
| 60.72003 | 0.281 |
| 60.73003 | 0.283 |
| 60.74003 | 0.284 |
| 60.75003 | 0.284 |
| 60.76003 | 0.284 |
| 60.77003 | 0.283 |
| 60.78003 | 0.283 |
| 60.79003 | 0.283 |
| 60.80003 | 0.284 |
| 60.81003 | 0.285 |
| 60.82003 | 0.285 |
| 60.83003 | 0.283 |
| 60.84003 | 0.279 |
| 60.85003 | 0.274 |
| 60.86003 | 0.268 |
| 60.87003 | 0.262 |
| 60.88003 | 0.257 |
| 60.89003 | 0.254 |
| 60.90003 | 0.254 |
| 60.91003 | 0.256 |
| 60.92003 | 0.261 |
| 60.93003 | 0.266 |
| 60.94003 | 0.271 |
| 60.95003 | 0.274 |
| 60.96003 | 0.275 |
| 60.97003 | 0.274 |
| 60.98003 | 0.272 |
| 60.99003 | 0.268 |
| 61.00003 | 0.265 |
| 61.01003 | 0.263 |
| 61.02003 | 0.263 |
| 61.03003 | 0.265 |
| 61.04003 | 0.27 |
| 61.05003 | 0.278 |
| 61.06003 | 0.287 |
| 61.07003 | 0.297 |
| 61.08003 | 0.307 |
| 61.09003 | 0.315 |
| 61.10003 | 0.322 |
| 61.11003 | 0.326 |
| 61.12003 | 0.329 |
| 61.13003 | 0.33 |
| 61.14003 | 0.33 |
| 61.15003 | 0.329 |
| 61.16003 | 0.329 |
| 61.17003 | 0.328 |
| 61.18003 | 0.328 |
| 61.19003 | 0.328 |
| 61.20003 | 0.328 |
| 61.21003 | 0.328 |
| 61.22003 | 0.328 |
| 61.23003 | 0.328 |
| 61.24003 | 0.328 |
| 61.25003 | 0.33 |
| 61.26003 | 0.331 |
| 61.27003 | 0.333 |
| 61.28003 | 0.334 |
| 61.29003 | 0.335 |
| 61.30003 | 0.334 |
| 61.31003 | 0.331 |
| 61.32003 | 0.326 |
| 61.33003 | 0.321 |
| 61.34003 | 0.316 |
| 61.35003 | 0.31 |
| 61.36003 | 0.306 |
| 61.37003 | 0.302 |
| 61.38003 | 0.299 |
| 61.39003 | 0.296 |
| 61.40003 | 0.293 |
| 61.41003 | 0.29 |
| 61.42003 | 0.288 |
| 61.43003 | 0.285 |
| 61.44003 | 0.283 |
| 61.45003 | 0.281 |
| 61.46003 | 0.281 |
| 61.47003 | 0.28 |
| 61.48003 | 0.279 |
| 61.49003 | 0.276 |
| 61.50003 | 0.271 |
| 61.51003 | 0.265 |
| 61.52003 | 0.257 |
| 61.53003 | 0.249 |
| 61.54003 | 0.242 |
| 61.55003 | 0.238 |
| 61.56003 | 0.238 |
| 61.57003 | 0.241 |
| 61.58003 | 0.247 |
| 61.59003 | 0.255 |
| 61.60003 | 0.264 |
| 61.61003 | 0.271 |
| 61.62003 | 0.276 |
| 61.63003 | 0.279 |
| 61.64003 | 0.279 |
| 61.65003 | 0.278 |
| 61.66003 | 0.277 |
| 61.67003 | 0.276 |
| 61.68003 | 0.277 |
| 61.69003 | 0.281 |
| 61.70003 | 0.286 |
| 61.71003 | 0.294 |
| 61.72003 | 0.302 |
| 61.73003 | 0.311 |
| 61.74003 | 0.32 |
| 61.75003 | 0.327 |
| 61.76003 | 0.334 |
| 61.77003 | 0.339 |
| 61.78003 | 0.342 |
| 61.79003 | 0.343 |
| 61.80003 | 0.343 |
| 61.81003 | 0.341 |
| 61.82003 | 0.337 |
| 61.83003 | 0.333 |
| 61.84003 | 0.329 |
| 61.85003 | 0.325 |
| 61.86003 | 0.322 |
| 61.87003 | 0.321 |
| 61.88003 | 0.321 |
| 61.89003 | 0.322 |
| 61.90003 | 0.323 |
| 61.91003 | 0.324 |
| 61.92003 | 0.325 |
| 61.93003 | 0.324 |
| 61.94003 | 0.322 |
| 61.95004 | 0.319 |
| 61.96003 | 0.315 |
| 61.97003 | 0.312 |
| 61.98003 | 0.309 |
| 61.99003 | 0.307 |
| 62.00003 | 0.304 |
| 62.01003 | 0.303 |
| 62.02003 | 0.301 |
| 62.03003 | 0.3 |
| 62.04003 | 0.299 |
| 62.05003 | 0.299 |
| 62.06003 | 0.299 |
| 62.07003 | 0.301 |
| 62.08003 | 0.303 |
| 62.09003 | 0.306 |
| 62.10003 | 0.31 |
| 62.11003 | 0.313 |
| 62.12003 | 0.315 |
| 62.13003 | 0.318 |
| 62.14003 | 0.319 |
| 62.15003 | 0.321 |
| 62.16003 | 0.322 |
| 62.17003 | 0.324 |
| 62.18003 | 0.326 |
| 62.19003 | 0.328 |
| 62.20004 | 0.328 |
| 62.21003 | 0.327 |
| 62.22003 | 0.324 |
| 62.23003 | 0.319 |
| 62.24003 | 0.312 |
| 62.25003 | 0.304 |
| 62.26003 | 0.296 |
| 62.27003 | 0.289 |
| 62.28003 | 0.284 |
| 62.29004 | 0.282 |
| 62.30003 | 0.283 |
| 62.31003 | 0.286 |
| 62.32003 | 0.29 |
| 62.33003 | 0.295 |
| 62.34003 | 0.3 |
| 62.35003 | 0.303 |
| 62.36003 | 0.304 |
| 62.37003 | 0.303 |
| 62.38003 | 0.299 |
| 62.39003 | 0.294 |
| 62.40003 | 0.287 |
| 62.41003 | 0.279 |
| 62.42003 | 0.272 |
| 62.43003 | 0.267 |
| 62.44003 | 0.263 |
| 62.45004 | 0.26 |
| 62.46003 | 0.26 |
| 62.47003 | 0.26 |
| 62.48003 | 0.26 |
| 62.49003 | 0.261 |
| 62.50003 | 0.261 |
| 62.51003 | 0.262 |
| 62.52003 | 0.262 |
| 62.53003 | 0.262 |
| 62.54004 | 0.263 |
| 62.55003 | 0.263 |
| 62.56003 | 0.264 |
| 62.57003 | 0.264 |
| 62.58003 | 0.264 |
| 62.59003 | 0.264 |
| 62.60003 | 0.264 |
| 62.61003 | 0.264 |
| 62.62003 | 0.265 |
| 62.63004 | 0.266 |
| 62.64003 | 0.268 |
| 62.65003 | 0.27 |
| 62.66003 | 0.272 |
| 62.67003 | 0.275 |
| 62.68003 | 0.277 |
| 62.69003 | 0.28 |
| 62.70004 | 0.282 |
| 62.71003 | 0.285 |
| 62.72003 | 0.288 |
| 62.73003 | 0.291 |
| 62.74003 | 0.295 |
| 62.75003 | 0.299 |
| 62.76003 | 0.302 |
| 62.77003 | 0.305 |
| 62.78003 | 0.307 |
| 62.79004 | 0.309 |
| 62.80003 | 0.31 |
| 62.81003 | 0.311 |
| 62.82003 | 0.313 |
| 62.83003 | 0.316 |
| 62.84003 | 0.32 |
| 62.85003 | 0.325 |
| 62.86003 | 0.329 |
| 62.87003 | 0.333 |
| 62.88004 | 0.334 |
| 62.89003 | 0.333 |
| 62.90003 | 0.329 |
| 62.91003 | 0.324 |
| 62.92003 | 0.317 |
| 62.93003 | 0.311 |
| 62.94003 | 0.306 |
| 62.95004 | 0.302 |
| 62.96003 | 0.301 |
| 62.97004 | 0.3 |
| 62.98003 | 0.3 |
| 62.99003 | 0.299 |
| 63.00003 | 0.298 |
| 63.01003 | 0.295 |
| 63.02003 | 0.291 |
| 63.03003 | 0.286 |
| 63.04004 | 0.281 |
| 63.05003 | 0.275 |
| 63.06004 | 0.268 |
| 63.07003 | 0.262 |
| 63.08003 | 0.254 |
| 63.09003 | 0.247 |
| 63.10003 | 0.24 |
| 63.11003 | 0.235 |
| 63.12003 | 0.233 |
| 63.13004 | 0.233 |
| 63.14003 | 0.236 |
| 63.15003 | 0.242 |
| 63.16003 | 0.249 |
| 63.17003 | 0.257 |
| 63.18003 | 0.264 |
| 63.19003 | 0.271 |
| 63.20004 | 0.275 |
| 63.21003 | 0.279 |
| 63.22004 | 0.281 |
| 63.23003 | 0.282 |
| 63.24003 | 0.283 |
| 63.25003 | 0.284 |
| 63.26003 | 0.286 |
| 63.27003 | 0.287 |
| 63.28003 | 0.289 |
| 63.29004 | 0.291 |
| 63.30003 | 0.293 |
| 63.31004 | 0.295 |
| 63.32003 | 0.296 |
| 63.33003 | 0.298 |
| 63.34003 | 0.298 |
| 63.35003 | 0.298 |
| 63.36003 | 0.297 |
| 63.37003 | 0.296 |
| 63.38004 | 0.294 |
| 63.39003 | 0.292 |
| 63.40004 | 0.29 |
| 63.41003 | 0.288 |
| 63.42003 | 0.287 |
| 63.43003 | 0.286 |
| 63.44003 | 0.285 |
| 63.45004 | 0.285 |
| 63.46003 | 0.284 |
| 63.47004 | 0.283 |
| 63.48003 | 0.282 |
| 63.49003 | 0.28 |
| 63.50003 | 0.277 |
| 63.51003 | 0.274 |
| 63.52003 | 0.272 |
| 63.53003 | 0.271 |
| 63.54004 | 0.272 |
| 63.55003 | 0.275 |
| 63.56004 | 0.28 |
| 63.57003 | 0.287 |
| 63.58003 | 0.295 |
| 63.59003 | 0.302 |
| 63.60003 | 0.308 |
| 63.61003 | 0.311 |
| 63.62003 | 0.312 |
| 63.63004 | 0.31 |
| 63.64003 | 0.306 |
| 63.65004 | 0.302 |
| 63.66003 | 0.297 |
| 63.67003 | 0.294 |
| 63.68003 | 0.292 |
| 63.69003 | 0.292 |
| 63.70004 | 0.294 |
| 63.71003 | 0.298 |
| 63.72004 | 0.303 |
| 63.73003 | 0.307 |
| 63.74004 | 0.312 |
| 63.75003 | 0.315 |
| 63.76003 | 0.316 |
| 63.77003 | 0.316 |
| 63.78003 | 0.315 |
| 63.79004 | 0.313 |
| 63.80003 | 0.31 |
| 63.81004 | 0.307 |
| 63.82003 | 0.304 |
| 63.83003 | 0.3 |
| 63.84003 | 0.297 |
| 63.85003 | 0.293 |
| 63.86003 | 0.289 |
| 63.87003 | 0.285 |
| 63.88004 | 0.282 |
| 63.89003 | 0.279 |
| 63.90004 | 0.277 |
| 63.91003 | 0.277 |
| 63.92003 | 0.278 |
| 63.93003 | 0.28 |
| 63.94003 | 0.284 |
| 63.95004 | 0.288 |
| 63.96003 | 0.292 |
| 63.97004 | 0.295 |
| 63.98003 | 0.298 |
| 63.99004 | 0.301 |
| 64.00003 | 0.302 |
| 64.01003 | 0.302 |
| 64.02003 | 0.301 |
| 64.03004 | 0.299 |
| 64.04003 | 0.297 |
| 64.05003 | 0.293 |
| 64.06004 | 0.29 |
| 64.07004 | 0.288 |
| 64.08003 | 0.286 |
| 64.09003 | 0.284 |
| 64.10004 | 0.284 |
| 64.11003 | 0.285 |
| 64.12003 | 0.286 |
| 64.13004 | 0.286 |
| 64.14004 | 0.285 |
| 64.15003 | 0.283 |
| 64.16003 | 0.279 |
| 64.17004 | 0.275 |
| 64.18003 | 0.271 |
| 64.19003 | 0.267 |
| 64.20004 | 0.265 |
| 64.21004 | 0.265 |
| 64.22003 | 0.268 |
| 64.23003 | 0.274 |
| 64.24004 | 0.281 |
| 64.25004 | 0.289 |
| 64.26003 | 0.297 |
| 64.27003 | 0.303 |
| 64.28004 | 0.307 |
| 64.29003 | 0.31 |
| 64.30003 | 0.311 |
| 64.31004 | 0.312 |
| 64.32004 | 0.312 |
| 64.33003 | 0.314 |
| 64.34003 | 0.316 |
| 64.35004 | 0.318 |
| 64.36003 | 0.32 |
| 64.37003 | 0.323 |
| 64.38004 | 0.325 |
| 64.39004 | 0.328 |
| 64.40003 | 0.33 |
| 64.41003 | 0.332 |
| 64.42004 | 0.334 |
| 64.43003 | 0.334 |
| 64.44003 | 0.334 |
| 64.45004 | 0.332 |
| 64.46004 | 0.328 |
| 64.47003 | 0.323 |
| 64.48003 | 0.315 |
| 64.49004 | 0.307 |
| 64.50004 | 0.3 |
| 64.51003 | 0.293 |
| 64.52003 | 0.288 |
| 64.53004 | 0.285 |
| 64.54003 | 0.283 |
| 64.55003 | 0.282 |
| 64.56004 | 0.281 |
| 64.57004 | 0.281 |
| 64.58003 | 0.28 |
| 64.59003 | 0.28 |
| 64.60004 | 0.279 |
| 64.61003 | 0.28 |
| 64.62003 | 0.28 |
| 64.63004 | 0.282 |
| 64.64004 | 0.283 |
| 64.65003 | 0.284 |
| 64.66003 | 0.285 |
| 64.67004 | 0.286 |
| 64.68004 | 0.287 |
| 64.69003 | 0.29 |
| 64.70004 | 0.293 |
| 64.71004 | 0.297 |
| 64.72003 | 0.301 |
| 64.73003 | 0.305 |
| 64.74004 | 0.308 |
| 64.75004 | 0.31 |
| 64.76003 | 0.31 |
| 64.77003 | 0.309 |
| 64.78004 | 0.307 |
| 64.79003 | 0.304 |
| 64.80003 | 0.302 |
| 64.81004 | 0.301 |
| 64.82004 | 0.301 |
| 64.83003 | 0.302 |
| 64.84003 | 0.304 |
| 64.85004 | 0.305 |
| 64.86003 | 0.306 |
| 64.87003 | 0.305 |
| 64.88004 | 0.303 |
| 64.89004 | 0.299 |
| 64.90003 | 0.295 |
| 64.91003 | 0.29 |
| 64.92004 | 0.285 |
| 64.93004 | 0.281 |
| 64.94003 | 0.278 |
| 64.95004 | 0.277 |
| 64.96004 | 0.277 |
| 64.97003 | 0.277 |
| 64.98003 | 0.278 |
| 64.99004 | 0.279 |
| 65.00004 | 0.28 |
| 65.01003 | 0.28 |
| 65.02003 | 0.279 |
| 65.03004 | 0.279 |
| 65.04003 | 0.278 |
| 65.05003 | 0.276 |
| 65.06004 | 0.275 |
| 65.07004 | 0.274 |
| 65.08003 | 0.272 |
| 65.09003 | 0.27 |
| 65.10004 | 0.268 |
| 65.11003 | 0.266 |
| 65.12003 | 0.264 |
| 65.13004 | 0.261 |
| 65.14004 | 0.26 |
| 65.15003 | 0.259 |
| 65.16003 | 0.26 |
| 65.17004 | 0.261 |
| 65.18004 | 0.264 |
| 65.19003 | 0.268 |
| 65.20004 | 0.272 |
| 65.21004 | 0.277 |
| 65.22003 | 0.281 |
| 65.23003 | 0.284 |
| 65.24004 | 0.287 |
| 65.25004 | 0.288 |
| 65.26003 | 0.289 |
| 65.27003 | 0.288 |
| 65.28004 | 0.287 |
| 65.29003 | 0.285 |
| 65.30003 | 0.284 |
| 65.31004 | 0.284 |
| 65.32004 | 0.284 |
| 65.33003 | 0.286 |
| 65.34003 | 0.288 |
| 65.35004 | 0.292 |
| 65.36004 | 0.297 |
| 65.37003 | 0.303 |
| 65.38004 | 0.308 |
| 65.39004 | 0.313 |
| 65.40003 | 0.316 |
| 65.41003 | 0.319 |
| 65.42004 | 0.32 |
| 65.43004 | 0.319 |
| 65.44003 | 0.317 |
| 65.45004 | 0.315 |
| 65.46004 | 0.313 |
| 65.47003 | 0.312 |
| 65.48003 | 0.311 |
| 65.49004 | 0.311 |
| 65.50004 | 0.311 |
| 65.51003 | 0.312 |
| 65.52003 | 0.311 |
| 65.53004 | 0.309 |
| 65.54003 | 0.306 |
| 65.55003 | 0.301 |
| 65.56004 | 0.294 |
| 65.57004 | 0.287 |
| 65.58003 | 0.281 |
| 65.59003 | 0.275 |
| 65.60004 | 0.27 |
| 65.61004 | 0.268 |
| 65.62003 | 0.267 |
| 65.63004 | 0.267 |
| 65.64004 | 0.268 |
| 65.65003 | 0.27 |
| 65.66003 | 0.272 |
| 65.67004 | 0.273 |
| 65.68004 | 0.275 |
| 65.69003 | 0.276 |
| 65.70004 | 0.277 |
| 65.71004 | 0.277 |
| 65.72003 | 0.277 |
| 65.73003 | 0.276 |
| 65.74004 | 0.275 |
| 65.75004 | 0.273 |
| 65.76003 | 0.271 |
| 65.77003 | 0.27 |
| 65.78004 | 0.269 |
| 65.79004 | 0.269 |
| 65.80003 | 0.27 |
| 65.81004 | 0.273 |
| 65.82004 | 0.276 |
| 65.83003 | 0.279 |
| 65.84003 | 0.283 |
| 65.85004 | 0.286 |
| 65.86004 | 0.289 |
| 65.87003 | 0.291 |
| 65.88004 | 0.292 |
| 65.89004 | 0.294 |
| 65.90003 | 0.295 |
| 65.91003 | 0.295 |
| 65.92004 | 0.295 |
| 65.93004 | 0.295 |
| 65.94003 | 0.294 |
| 65.95004 | 0.294 |
| 65.96004 | 0.293 |
| 65.97003 | 0.291 |
| 65.98003 | 0.29 |
| 65.99004 | 0.288 |
| 66.00004 | 0.286 |
| 66.01003 | 0.283 |
| 66.02003 | 0.281 |
| 66.03004 | 0.279 |
| 66.04004 | 0.278 |
| 66.05003 | 0.277 |
| 66.06004 | 0.278 |
| 66.07004 | 0.28 |
| 66.08003 | 0.283 |
| 66.09003 | 0.287 |
| 66.10004 | 0.291 |
| 66.11004 | 0.294 |
| 66.12003 | 0.297 |
| 66.13004 | 0.299 |
| 66.14004 | 0.3 |
| 66.15003 | 0.299 |
| 66.16003 | 0.296 |
| 66.17004 | 0.293 |
| 66.18004 | 0.289 |
| 66.19003 | 0.285 |
| 66.20004 | 0.282 |
| 66.21004 | 0.28 |
| 66.22003 | 0.28 |
| 66.23003 | 0.282 |
| 66.24004 | 0.285 |
| 66.25004 | 0.288 |
| 66.26003 | 0.292 |
| 66.27003 | 0.295 |
| 66.28004 | 0.297 |
| 66.29004 | 0.299 |
| 66.30003 | 0.3 |
| 66.31004 | 0.3 |
| 66.32004 | 0.302 |
| 66.33003 | 0.304 |
| 66.34003 | 0.306 |
| 66.35004 | 0.309 |
| 66.36004 | 0.311 |
| 66.37003 | 0.312 |
| 66.38004 | 0.312 |
| 66.39004 | 0.311 |
| 66.40003 | 0.31 |
| 66.41003 | 0.308 |
| 66.42004 | 0.307 |
| 66.43004 | 0.307 |
| 66.44003 | 0.307 |
| 66.45004 | 0.308 |
| 66.46004 | 0.308 |
| 66.47004 | 0.308 |
| 66.48003 | 0.308 |
| 66.49004 | 0.307 |
| 66.50004 | 0.305 |
| 66.51003 | 0.304 |
| 66.52003 | 0.302 |
| 66.53004 | 0.302 |
| 66.54004 | 0.301 |
| 66.55003 | 0.301 |
| 66.56004 | 0.301 |
| 66.57004 | 0.301 |
| 66.58003 | 0.301 |
| 66.59003 | 0.301 |
| 66.60004 | 0.301 |
| 66.61004 | 0.301 |
| 66.62003 | 0.301 |
| 66.63004 | 0.301 |
| 66.64004 | 0.301 |
| 66.65003 | 0.3 |
| 66.66003 | 0.298 |
| 66.67004 | 0.295 |
| 66.68004 | 0.29 |
| 66.69003 | 0.285 |
| 66.70004 | 0.279 |
| 66.71004 | 0.273 |
| 66.72004 | 0.268 |
| 66.73003 | 0.264 |
| 66.74004 | 0.262 |
| 66.75004 | 0.261 |
| 66.76003 | 0.262 |
| 66.77003 | 0.264 |
| 66.78004 | 0.266 |
| 66.79004 | 0.268 |
| 66.80003 | 0.27 |
| 66.81004 | 0.271 |
| 66.82004 | 0.272 |
| 66.83003 | 0.273 |
| 66.84003 | 0.274 |
| 66.85004 | 0.277 |
| 66.86004 | 0.279 |
| 66.87003 | 0.283 |
| 66.88004 | 0.287 |
| 66.89004 | 0.292 |
| 66.90004 | 0.298 |
| 66.91003 | 0.303 |
| 66.92004 | 0.308 |
| 66.93004 | 0.313 |
| 66.94003 | 0.317 |
| 66.95004 | 0.32 |
| 66.96004 | 0.323 |
| 66.97004 | 0.324 |
| 66.98003 | 0.325 |
| 66.99004 | 0.326 |
| 67.00004 | 0.325 |
| 67.01003 | 0.325 |
| 67.02003 | 0.325 |
| 67.03004 | 0.324 |
| 67.04004 | 0.324 |
| 67.05003 | 0.323 |
| 67.06004 | 0.322 |
| 67.07004 | 0.321 |
| 67.08003 | 0.321 |
| 67.09003 | 0.32 |
| 67.10004 | 0.319 |
| 67.11004 | 0.318 |
| 67.12003 | 0.317 |
| 67.13004 | 0.315 |
| 67.14004 | 0.313 |
| 67.15004 | 0.311 |
| 67.16003 | 0.308 |
| 67.17004 | 0.305 |
| 67.18004 | 0.303 |
| 67.19003 | 0.302 |
| 67.20004 | 0.301 |
| 67.21004 | 0.302 |
| 67.22004 | 0.302 |
| 67.23003 | 0.303 |
| 67.24004 | 0.303 |
| 67.25004 | 0.303 |
| 67.26003 | 0.302 |
| 67.27003 | 0.301 |
| 67.28004 | 0.3 |
| 67.29004 | 0.299 |
| 67.30003 | 0.298 |
| 67.31004 | 0.299 |
| 67.32004 | 0.3 |
| 67.33003 | 0.302 |
| 67.34003 | 0.304 |
| 67.35004 | 0.306 |
| 67.36004 | 0.308 |
| 67.37003 | 0.31 |
| 67.38004 | 0.311 |
| 67.39004 | 0.312 |
| 67.40004 | 0.311 |
| 67.41003 | 0.31 |
| 67.42004 | 0.307 |
| 67.43004 | 0.304 |
| 67.44003 | 0.3 |
| 67.45004 | 0.296 |
| 67.46004 | 0.293 |
| 67.47004 | 0.29 |
| 67.48003 | 0.289 |
| 67.49004 | 0.289 |
| 67.50004 | 0.289 |
| 67.51003 | 0.29 |
| 67.52003 | 0.291 |
| 67.53004 | 0.292 |
| 67.54004 | 0.292 |
| 67.55003 | 0.29 |
| 67.56004 | 0.289 |
| 67.57004 | 0.287 |
| 67.58004 | 0.285 |
| 67.59003 | 0.283 |
| 67.60004 | 0.281 |
| 67.61004 | 0.279 |
| 67.62003 | 0.278 |
| 67.63004 | 0.276 |
| 67.64004 | 0.275 |
| 67.65004 | 0.274 |
| 67.66003 | 0.273 |
| 67.67004 | 0.273 |
| 67.68004 | 0.274 |
| 67.69003 | 0.275 |
| 67.70004 | 0.277 |
| 67.71004 | 0.279 |
| 67.72004 | 0.281 |
| 67.73003 | 0.283 |
| 67.74004 | 0.284 |
| 67.75004 | 0.285 |
| 67.76003 | 0.286 |
| 67.77003 | 0.286 |
| 67.78004 | 0.287 |
| 67.79004 | 0.287 |
| 67.80003 | 0.288 |
| 67.81004 | 0.288 |
| 67.82004 | 0.288 |
| 67.83004 | 0.288 |
| 67.84003 | 0.288 |
| 67.85004 | 0.289 |
| 67.86004 | 0.29 |
| 67.87003 | 0.292 |
| 67.88004 | 0.294 |
| 67.89004 | 0.296 |
| 67.90004 | 0.297 |
| 67.91003 | 0.299 |
| 67.92004 | 0.3 |
| 67.93004 | 0.3 |
| 67.94003 | 0.3 |
| 67.95004 | 0.299 |
| 67.96004 | 0.299 |
| 67.97004 | 0.298 |
| 67.98003 | 0.297 |
| 67.99004 | 0.297 |
| 68.00004 | 0.297 |
| 68.01004 | 0.298 |
| 68.02003 | 0.3 |
| 68.03004 | 0.302 |
| 68.04004 | 0.304 |
| 68.05003 | 0.306 |
| 68.06004 | 0.307 |
| 68.07004 | 0.307 |
| 68.08004 | 0.306 |
| 68.09003 | 0.304 |
| 68.10004 | 0.301 |
| 68.11004 | 0.298 |
| 68.12003 | 0.295 |
| 68.13004 | 0.293 |
| 68.14004 | 0.291 |
| 68.15004 | 0.289 |
| 68.16003 | 0.288 |
| 68.17004 | 0.286 |
| 68.18004 | 0.285 |
| 68.19003 | 0.284 |
| 68.20004 | 0.282 |
| 68.21004 | 0.28 |
| 68.22004 | 0.278 |
| 68.23003 | 0.275 |
| 68.24004 | 0.272 |
| 68.25004 | 0.27 |
| 68.26004 | 0.267 |
| 68.27003 | 0.265 |
| 68.28004 | 0.263 |
| 68.29004 | 0.262 |
| 68.30003 | 0.262 |
| 68.31004 | 0.263 |
| 68.32004 | 0.264 |
| 68.33004 | 0.266 |
| 68.34003 | 0.268 |
| 68.35004 | 0.27 |
| 68.36004 | 0.272 |
| 68.37003 | 0.274 |
| 68.38004 | 0.276 |
| 68.39004 | 0.277 |
| 68.40004 | 0.278 |
| 68.41003 | 0.279 |
| 68.42004 | 0.279 |
| 68.43004 | 0.28 |
| 68.44003 | 0.281 |
| 68.45004 | 0.281 |
| 68.46004 | 0.282 |
| 68.47004 | 0.284 |
| 68.48003 | 0.285 |
| 68.49004 | 0.286 |
| 68.50004 | 0.287 |
| 68.51004 | 0.288 |
| 68.52003 | 0.287 |
| 68.53004 | 0.287 |
| 68.54004 | 0.285 |
| 68.55003 | 0.284 |
| 68.56004 | 0.282 |
| 68.57004 | 0.281 |
| 68.58004 | 0.28 |
| 68.59003 | 0.279 |
| 68.60004 | 0.279 |
| 68.61004 | 0.279 |
| 68.62003 | 0.279 |
| 68.63004 | 0.279 |
| 68.64004 | 0.279 |
| 68.65004 | 0.278 |
| 68.66003 | 0.278 |
| 68.67004 | 0.278 |
| 68.68004 | 0.277 |
| 68.69004 | 0.277 |
| 68.70004 | 0.277 |
| 68.71004 | 0.277 |
| 68.72004 | 0.279 |
| 68.73003 | 0.281 |
| 68.74004 | 0.284 |
| 68.75004 | 0.287 |
| 68.76004 | 0.291 |
| 68.77003 | 0.295 |
| 68.78004 | 0.298 |
| 68.79004 | 0.3 |
| 68.80003 | 0.301 |
| 68.81004 | 0.301 |
| 68.82004 | 0.301 |
| 68.83004 | 0.301 |
| 68.84003 | 0.301 |
| 68.85004 | 0.301 |
| 68.86004 | 0.302 |
| 68.87003 | 0.304 |
| 68.88004 | 0.305 |
| 68.89004 | 0.307 |
| 68.90004 | 0.308 |
| 68.91003 | 0.309 |
| 68.92004 | 0.311 |
| 68.93004 | 0.312 |
| 68.94004 | 0.314 |
| 68.95004 | 0.316 |
| 68.96004 | 0.318 |
| 68.97004 | 0.319 |
| 68.98003 | 0.32 |
| 68.99004 | 0.32 |
| 69.00004 | 0.319 |
| 69.01004 | 0.317 |
| 69.02003 | 0.314 |
| 69.03004 | 0.312 |
| 69.04004 | 0.309 |
| 69.05003 | 0.306 |
| 69.06004 | 0.303 |
| 69.07004 | 0.301 |
| 69.08004 | 0.299 |
| 69.09003 | 0.297 |
| 69.10004 | 0.296 |
| 69.11004 | 0.295 |
| 69.12004 | 0.294 |
| 69.13004 | 0.294 |
| 69.14004 | 0.294 |
| 69.15004 | 0.294 |
| 69.16003 | 0.293 |
| 69.17004 | 0.292 |
| 69.18004 | 0.29 |
| 69.19004 | 0.288 |
| 69.20004 | 0.286 |
| 69.21004 | 0.283 |
| 69.22004 | 0.281 |
| 69.23003 | 0.279 |
| 69.24004 | 0.278 |
| 69.25004 | 0.277 |
| 69.26004 | 0.277 |
| 69.27003 | 0.277 |
| 69.28004 | 0.276 |
| 69.29004 | 0.276 |
| 69.30003 | 0.276 |
| 69.31004 | 0.276 |
| 69.32004 | 0.276 |
| 69.33004 | 0.277 |
| 69.34003 | 0.277 |
| 69.35004 | 0.278 |
| 69.36004 | 0.278 |
| 69.37004 | 0.279 |
| 69.38004 | 0.279 |
| 69.39004 | 0.28 |
| 69.40004 | 0.281 |
| 69.41003 | 0.283 |
| 69.42004 | 0.285 |
| 69.43004 | 0.288 |
| 69.44004 | 0.292 |
| 69.45004 | 0.295 |
| 69.46004 | 0.298 |
| 69.47004 | 0.301 |
| 69.48003 | 0.303 |
| 69.49004 | 0.305 |
| 69.50004 | 0.307 |
| 69.51004 | 0.308 |
| 69.52003 | 0.31 |
| 69.53004 | 0.311 |
| 69.54004 | 0.312 |
| 69.55003 | 0.312 |
| 69.56004 | 0.312 |
| 69.57004 | 0.311 |
| 69.58004 | 0.309 |
| 69.59003 | 0.308 |
| 69.60004 | 0.307 |
| 69.61004 | 0.306 |
| 69.62004 | 0.305 |
| 69.63004 | 0.304 |
| 69.64004 | 0.302 |
| 69.65004 | 0.301 |
| 69.66003 | 0.299 |
| 69.67004 | 0.297 |
| 69.68004 | 0.295 |
| 69.69004 | 0.293 |
| 69.70004 | 0.291 |
| 69.71004 | 0.29 |
| 69.72004 | 0.29 |
| 69.73003 | 0.29 |
| 69.74004 | 0.29 |
| 69.75004 | 0.29 |
| 69.76004 | 0.29 |
| 69.77003 | 0.29 |
| 69.78004 | 0.29 |
| 69.79004 | 0.289 |
| 69.80004 | 0.289 |
| 69.81004 | 0.288 |
| 69.82004 | 0.288 |
| 69.83004 | 0.288 |
| 69.84003 | 0.288 |
| 69.85004 | 0.289 |
| 69.86004 | 0.29 |
| 69.87004 | 0.291 |
| 69.88004 | 0.293 |
| 69.89004 | 0.295 |
| 69.90004 | 0.296 |
| 69.91003 | 0.297 |
| 69.92004 | 0.298 |
| 69.93004 | 0.298 |
| 69.94004 | 0.297 |
| 69.95004 | 0.296 |
| 69.96004 | 0.295 |
| 69.97004 | 0.294 |
| 69.98003 | 0.293 |
| 69.99004 | 0.293 |
| 70.00004 | 0.294 |
| 70.01004 | 0.296 |
| 70.02003 | 0.298 |
| 70.03004 | 0.3 |
| 70.04004 | 0.302 |
| 70.05004 | 0.302 |
| 70.06004 | 0.302 |
| 70.07004 | 0.3 |
| 70.08004 | 0.298 |
| 70.09003 | 0.295 |
| 70.10004 | 0.292 |
| 70.11004 | 0.29 |
| 70.12004 | 0.288 |
| 70.13004 | 0.287 |
| 70.14004 | 0.287 |
| 70.15004 | 0.287 |
| 70.16003 | 0.287 |
| 70.17004 | 0.287 |
| 70.18004 | 0.286 |
| 70.19004 | 0.286 |
| 70.20004 | 0.286 |
| 70.21004 | 0.286 |
| 70.22004 | 0.287 |
| 70.23003 | 0.288 |
| 70.24004 | 0.289 |
| 70.25004 | 0.289 |
| 70.26004 | 0.289 |
| 70.27003 | 0.288 |
| 70.28004 | 0.287 |
| 70.29004 | 0.286 |
| 70.30004 | 0.284 |
| 70.31004 | 0.283 |
| 70.32004 | 0.282 |
| 70.33004 | 0.281 |
| 70.34003 | 0.281 |
| 70.35004 | 0.281 |
| 70.36004 | 0.281 |
| 70.37004 | 0.282 |
| 70.38004 | 0.283 |
| 70.39004 | 0.285 |
| 70.40004 | 0.287 |
| 70.41003 | 0.289 |
| 70.42004 | 0.292 |
| 70.43004 | 0.293 |
| 70.44004 | 0.294 |
| 70.45004 | 0.294 |
| 70.46004 | 0.293 |
| 70.47004 | 0.292 |
| 70.48004 | 0.291 |
| 70.49004 | 0.29 |
| 70.50004 | 0.29 |
| 70.51004 | 0.29 |
| 70.52003 | 0.291 |
| 70.53004 | 0.293 |
| 70.54004 | 0.295 |
| 70.55004 | 0.297 |
| 70.56004 | 0.3 |
| 70.57004 | 0.302 |
| 70.58004 | 0.304 |
| 70.59003 | 0.305 |
| 70.60004 | 0.307 |
| 70.61004 | 0.308 |
| 70.62004 | 0.308 |
| 70.63004 | 0.309 |
| 70.64004 | 0.309 |
| 70.65004 | 0.309 |
| 70.66003 | 0.309 |
| 70.67004 | 0.308 |
| 70.68004 | 0.307 |
| 70.69004 | 0.305 |
| 70.70004 | 0.303 |
| 70.71004 | 0.3 |
| 70.72004 | 0.297 |
| 70.73004 | 0.294 |
| 70.74004 | 0.29 |
| 70.75004 | 0.286 |
| 70.76004 | 0.283 |
| 70.77003 | 0.28 |
| 70.78004 | 0.277 |
| 70.79004 | 0.275 |
| 70.80004 | 0.274 |
| 70.81004 | 0.274 |
| 70.82004 | 0.275 |
| 70.83004 | 0.277 |
| 70.84003 | 0.279 |
| 70.85004 | 0.281 |
| 70.86004 | 0.283 |
| 70.87004 | 0.285 |
| 70.88004 | 0.286 |
| 70.89004 | 0.286 |
| 70.90004 | 0.287 |
| 70.91004 | 0.287 |
| 70.92004 | 0.288 |
| 70.93004 | 0.289 |
| 70.94004 | 0.29 |
| 70.95004 | 0.291 |
| 70.96004 | 0.292 |
| 70.97004 | 0.292 |
| 70.98004 | 0.292 |
| 70.99004 | 0.292 |
| 71.00004 | 0.292 |
| 71.01004 | 0.292 |
| 71.02003 | 0.292 |
| 71.03004 | 0.292 |
| 71.04004 | 0.293 |
| 71.05004 | 0.294 |
| 71.06004 | 0.295 |
| 71.07004 | 0.296 |
| 71.08004 | 0.298 |
| 71.09003 | 0.299 |
| 71.10004 | 0.3 |
| 71.11004 | 0.3 |
| 71.12004 | 0.299 |
| 71.13004 | 0.298 |
| 71.14004 | 0.296 |
| 71.15004 | 0.294 |
| 71.16004 | 0.291 |
| 71.17004 | 0.288 |
| 71.18004 | 0.286 |
| 71.19004 | 0.284 |
| 71.20004 | 0.282 |
| 71.21004 | 0.281 |
| 71.22004 | 0.281 |
| 71.23004 | 0.281 |
| 71.24004 | 0.282 |
| 71.25004 | 0.283 |
| 71.26004 | 0.285 |
| 71.27003 | 0.287 |
| 71.28004 | 0.29 |
| 71.29004 | 0.292 |
| 71.30004 | 0.293 |
| 71.31004 | 0.293 |
| 71.32004 | 0.293 |
| 71.33004 | 0.292 |
| 71.34003 | 0.29 |
| 71.35004 | 0.288 |
| 71.36004 | 0.287 |
| 71.37004 | 0.285 |
| 71.38004 | 0.284 |
| 71.39004 | 0.284 |
| 71.40004 | 0.284 |
| 71.41004 | 0.286 |
| 71.42004 | 0.288 |
| 71.43004 | 0.29 |
| 71.44004 | 0.292 |
| 71.45004 | 0.294 |
| 71.46004 | 0.295 |
| 71.47004 | 0.297 |
| 71.48004 | 0.298 |
| 71.49004 | 0.299 |
| 71.50004 | 0.3 |
| 71.51004 | 0.301 |
| 71.52003 | 0.302 |
| 71.53004 | 0.302 |
| 71.54004 | 0.302 |
| 71.55004 | 0.302 |
| 71.56004 | 0.302 |
| 71.57004 | 0.301 |
| 71.58004 | 0.3 |
| 71.59004 | 0.299 |
| 71.60004 | 0.299 |
| 71.61004 | 0.299 |
| 71.62004 | 0.299 |
| 71.63004 | 0.299 |
| 71.64004 | 0.299 |
| 71.65004 | 0.299 |
| 71.66004 | 0.299 |
| 71.67004 | 0.298 |
| 71.68004 | 0.297 |
| 71.69004 | 0.296 |
| 71.70004 | 0.295 |
| 71.71004 | 0.294 |
| 71.72004 | 0.294 |
| 71.73004 | 0.293 |
| 71.74004 | 0.292 |
| 71.75004 | 0.291 |
| 71.76004 | 0.29 |
| 71.77003 | 0.289 |
| 71.78004 | 0.288 |
| 71.79004 | 0.288 |
| 71.80004 | 0.287 |
| 71.81004 | 0.287 |
| 71.82004 | 0.287 |
| 71.83004 | 0.287 |
| 71.84004 | 0.287 |
| 71.85004 | 0.286 |
| 71.86004 | 0.286 |
| 71.87004 | 0.285 |
| 71.88004 | 0.284 |
| 71.89004 | 0.283 |
| 71.90004 | 0.283 |
| 71.91004 | 0.284 |
| 71.92004 | 0.285 |
| 71.93004 | 0.286 |
| 71.94004 | 0.287 |
| 71.95004 | 0.288 |
| 71.96004 | 0.288 |
| 71.97004 | 0.289 |
| 71.98004 | 0.289 |
| 71.99004 | 0.289 |
| 72.00004 | 0.29 |
| 72.01004 | 0.291 |
| 72.02004 | 0.292 |
| 72.03004 | 0.293 |
| 72.04004 | 0.294 |
| 72.05004 | 0.295 |
| 72.06004 | 0.296 |
| 72.07004 | 0.297 |
| 72.08004 | 0.298 |
| 72.09004 | 0.299 |
| 72.10004 | 0.301 |
| 72.11004 | 0.303 |
| 72.12004 | 0.305 |
| 72.13004 | 0.307 |
| 72.14004 | 0.307 |
| 72.15004 | 0.307 |
| 72.16004 | 0.306 |
| 72.17004 | 0.305 |
| 72.18004 | 0.303 |
| 72.19004 | 0.302 |
| 72.20004 | 0.301 |
| 72.21004 | 0.3 |
| 72.22004 | 0.299 |
| 72.23004 | 0.298 |
| 72.24004 | 0.298 |
| 72.25004 | 0.297 |
| 72.26004 | 0.296 |
| 72.27004 | 0.296 |
| 72.28004 | 0.296 |
| 72.29004 | 0.296 |
| 72.30004 | 0.296 |
| 72.31004 | 0.297 |
| 72.32004 | 0.297 |
| 72.33004 | 0.296 |
| 72.34004 | 0.296 |
| 72.35004 | 0.294 |
| 72.36004 | 0.294 |
| 72.37004 | 0.293 |
| 72.38004 | 0.292 |
| 72.39004 | 0.292 |
| 72.40004 | 0.293 |
| 72.41004 | 0.293 |
| 72.42004 | 0.293 |
| 72.43004 | 0.293 |
| 72.44004 | 0.293 |
| 72.45004 | 0.293 |
| 72.46004 | 0.293 |
| 72.47004 | 0.293 |
| 72.48004 | 0.293 |
| 72.49004 | 0.293 |
| 72.50004 | 0.294 |
| 72.51004 | 0.295 |
| 72.52004 | 0.296 |
| 72.53004 | 0.298 |
| 72.54004 | 0.3 |
| 72.55004 | 0.301 |
| 72.56004 | 0.302 |
| 72.57004 | 0.303 |
| 72.58004 | 0.302 |
| 72.59004 | 0.301 |
| 72.60004 | 0.3 |
| 72.61004 | 0.298 |
| 72.62004 | 0.296 |
| 72.63004 | 0.294 |
| 72.64004 | 0.293 |
| 72.65004 | 0.293 |
| 72.66004 | 0.294 |
| 72.67004 | 0.295 |
| 72.68004 | 0.296 |
| 72.69004 | 0.296 |
| 72.70004 | 0.296 |
| 72.71004 | 0.295 |
| 72.72004 | 0.293 |
| 72.73004 | 0.291 |
| 72.74004 | 0.288 |
| 72.75004 | 0.286 |
| 72.76004 | 0.284 |
| 72.77004 | 0.282 |
| 72.78004 | 0.281 |
| 72.79004 | 0.281 |
| 72.80004 | 0.281 |
| 72.81004 | 0.28 |
| 72.82004 | 0.28 |
| 72.83004 | 0.28 |
| 72.84004 | 0.279 |
| 72.85004 | 0.278 |
| 72.86004 | 0.278 |
| 72.87004 | 0.278 |
| 72.88004 | 0.279 |
| 72.89004 | 0.28 |
| 72.90004 | 0.281 |
| 72.91004 | 0.282 |
| 72.92004 | 0.283 |
| 72.93004 | 0.284 |
| 72.94004 | 0.285 |
| 72.95004 | 0.285 |
| 72.96004 | 0.285 |
| 72.97004 | 0.285 |
| 72.98004 | 0.285 |
| 72.99004 | 0.285 |
| 73.00004 | 0.285 |
| 73.01004 | 0.285 |
| 73.02004 | 0.285 |
| 73.03004 | 0.286 |
| 73.04004 | 0.287 |
| 73.05004 | 0.288 |
| 73.06004 | 0.29 |
| 73.07004 | 0.292 |
| 73.08004 | 0.294 |
| 73.09004 | 0.296 |
| 73.10004 | 0.298 |
| 73.11004 | 0.3 |
| 73.12004 | 0.302 |
| 73.13004 | 0.303 |
| 73.14004 | 0.304 |
| 73.15004 | 0.305 |
| 73.16004 | 0.306 |
| 73.17004 | 0.306 |
| 73.18004 | 0.307 |
| 73.19004 | 0.308 |
| 73.20004 | 0.308 |
| 73.21004 | 0.309 |
| 73.22004 | 0.309 |
| 73.23004 | 0.308 |
| 73.24004 | 0.307 |
| 73.25004 | 0.305 |
| 73.26004 | 0.302 |
| 73.27004 | 0.3 |
| 73.28004 | 0.298 |
| 73.29004 | 0.296 |
| 73.30004 | 0.294 |
| 73.31004 | 0.292 |
| 73.32004 | 0.29 |
| 73.33004 | 0.288 |
| 73.34004 | 0.286 |
| 73.35004 | 0.284 |
| 73.36004 | 0.282 |
| 73.37004 | 0.281 |
| 73.38004 | 0.28 |
| 73.39004 | 0.279 |
| 73.40004 | 0.278 |
| 73.41004 | 0.277 |
| 73.42004 | 0.275 |
| 73.43004 | 0.274 |
| 73.44004 | 0.272 |
| 73.45004 | 0.271 |
| 73.46004 | 0.27 |
| 73.47004 | 0.27 |
| 73.48004 | 0.271 |
| 73.49004 | 0.272 |
| 73.50004 | 0.274 |
| 73.51004 | 0.275 |
| 73.52004 | 0.276 |
| 73.53004 | 0.277 |
| 73.54004 | 0.278 |
| 73.55004 | 0.278 |
| 73.56004 | 0.279 |
| 73.57004 | 0.28 |
| 73.58004 | 0.281 |
| 73.59004 | 0.282 |
| 73.60004 | 0.282 |
| 73.61004 | 0.283 |
| 73.62004 | 0.283 |
| 73.63004 | 0.284 |
| 73.64004 | 0.286 |
| 73.65004 | 0.288 |
| 73.66004 | 0.29 |
| 73.67004 | 0.292 |
| 73.68004 | 0.293 |
| 73.69004 | 0.294 |
| 73.70004 | 0.294 |
| 73.71004 | 0.294 |
| 73.72004 | 0.293 |
| 73.73004 | 0.291 |
| 73.74004 | 0.289 |
| 73.75004 | 0.287 |
| 73.76004 | 0.286 |
| 73.77004 | 0.284 |
| 73.78004 | 0.284 |
| 73.79004 | 0.284 |
| 73.80004 | 0.284 |
| 73.81004 | 0.285 |
| 73.82004 | 0.286 |
| 73.83004 | 0.287 |
| 73.84004 | 0.288 |
| 73.85004 | 0.289 |
| 73.86004 | 0.289 |
| 73.87004 | 0.288 |
| 73.88004 | 0.288 |
| 73.89004 | 0.287 |
| 73.90004 | 0.286 |
| 73.91004 | 0.286 |
| 73.92004 | 0.286 |
| 73.93004 | 0.287 |
| 73.94004 | 0.288 |
| 73.95004 | 0.289 |
| 73.96004 | 0.29 |
| 73.97004 | 0.29 |
| 73.98004 | 0.291 |
| 73.99004 | 0.291 |
| 74.00004 | 0.292 |
| 74.01004 | 0.292 |
| 74.02004 | 0.292 |
| 74.03004 | 0.293 |
| 74.04004 | 0.294 |
| 74.05004 | 0.295 |
| 74.06004 | 0.296 |
| 74.07004 | 0.298 |
| 74.08004 | 0.299 |
| 74.09004 | 0.3 |
| 74.10004 | 0.3 |
| 74.11004 | 0.3 |
| 74.12004 | 0.3 |
| 74.13004 | 0.3 |
| 74.14004 | 0.301 |
| 74.15004 | 0.301 |
| 74.16004 | 0.302 |
| 74.17004 | 0.302 |
| 74.18004 | 0.302 |
| 74.19004 | 0.302 |
| 74.20004 | 0.301 |
| 74.21004 | 0.3 |
| 74.22004 | 0.298 |
| 74.23004 | 0.297 |
| 74.24004 | 0.296 |
| 74.25004 | 0.296 |
| 74.26004 | 0.295 |
| 74.27004 | 0.295 |
| 74.28004 | 0.295 |
| 74.29004 | 0.295 |
| 74.30004 | 0.295 |
| 74.31004 | 0.295 |
| 74.32004 | 0.295 |
| 74.33004 | 0.295 |
| 74.34004 | 0.295 |
| 74.35004 | 0.295 |
| 74.36004 | 0.295 |
| 74.37004 | 0.295 |
| 74.38004 | 0.294 |
| 74.39004 | 0.293 |
| 74.40004 | 0.291 |
| 74.41004 | 0.289 |
| 74.42004 | 0.288 |
| 74.43004 | 0.286 |
| 74.44004 | 0.285 |
| 74.45004 | 0.284 |
| 74.46004 | 0.284 |
| 74.47004 | 0.283 |
| 74.48004 | 0.283 |
| 74.49004 | 0.282 |
| 74.50004 | 0.282 |
| 74.51004 | 0.282 |
| 74.52004 | 0.282 |
| 74.53004 | 0.282 |
| 74.54004 | 0.283 |
| 74.55004 | 0.284 |
| 74.56004 | 0.286 |
| 74.57004 | 0.287 |
| 74.58004 | 0.288 |
| 74.59004 | 0.29 |
| 74.60004 | 0.291 |
| 74.61004 | 0.292 |
| 74.62004 | 0.293 |
| 74.63004 | 0.295 |
| 74.64004 | 0.297 |
| 74.65004 | 0.299 |
| 74.66004 | 0.301 |
| 74.67004 | 0.303 |
| 74.68004 | 0.305 |
| 74.69004 | 0.306 |
| 74.70004 | 0.307 |
| 74.71004 | 0.308 |
| 74.72004 | 0.309 |
| 74.73004 | 0.309 |
| 74.74004 | 0.309 |
| 74.75004 | 0.309 |
| 74.76004 | 0.309 |
| 74.77004 | 0.308 |
| 74.78004 | 0.307 |
| 74.79004 | 0.306 |
| 74.80004 | 0.305 |
| 74.81004 | 0.305 |
| 74.82004 | 0.304 |
| 74.83004 | 0.304 |
| 74.84004 | 0.303 |
| 74.85004 | 0.302 |
| 74.86004 | 0.302 |
| 74.87004 | 0.301 |
| 74.88004 | 0.3 |
| 74.89004 | 0.3 |
| 74.90004 | 0.299 |
| 74.91004 | 0.299 |
| 74.92004 | 0.299 |
| 74.93004 | 0.299 |
| 74.94004 | 0.299 |
| 74.95004 | 0.298 |
| 74.96004 | 0.298 |
| 74.97004 | 0.297 |
| 74.98004 | 0.296 |
| 74.99004 | 0.295 |
| 75.00004 | 0.294 |
| 75.01004 | 0.294 |
| 75.02004 | 0.294 |
| 75.03004 | 0.295 |
| 75.04004 | 0.296 |
| 75.05004 | 0.296 |
| 75.06004 | 0.297 |
| 75.07004 | 0.298 |
| 75.08004 | 0.299 |
| 75.09004 | 0.3 |
| 75.10004 | 0.3 |
| 75.11004 | 0.299 |
| 75.12004 | 0.298 |
| 75.13004 | 0.298 |
| 75.14004 | 0.296 |
| 75.15004 | 0.295 |
| 75.16004 | 0.294 |
| 75.17004 | 0.293 |
| 75.18004 | 0.293 |
| 75.19004 | 0.292 |
| 75.20004 | 0.292 |
| 75.21004 | 0.292 |
| 75.22004 | 0.292 |
| 75.23004 | 0.292 |
| 75.24004 | 0.291 |
| 75.25004 | 0.291 |
| 75.26004 | 0.29 |
| 75.27004 | 0.29 |
| 75.28004 | 0.289 |
| 75.29004 | 0.288 |
| 75.30004 | 0.288 |
| 75.31004 | 0.287 |
| 75.32004 | 0.286 |
| 75.33004 | 0.285 |
| 75.34004 | 0.284 |
| 75.35004 | 0.284 |
| 75.36004 | 0.283 |
| 75.37004 | 0.282 |
| 75.38004 | 0.282 |
| 75.39004 | 0.282 |
| 75.40004 | 0.282 |
| 75.41004 | 0.282 |
| 75.42004 | 0.283 |
| 75.43004 | 0.284 |
| 75.44004 | 0.285 |
| 75.45004 | 0.285 |
| 75.46004 | 0.286 |
| 75.47004 | 0.286 |
| 75.48004 | 0.286 |
| 75.49004 | 0.287 |
| 75.50004 | 0.287 |
| 75.51004 | 0.288 |
| 75.52004 | 0.288 |
| 75.53004 | 0.289 |
| 75.54004 | 0.29 |
| 75.55004 | 0.291 |
| 75.56004 | 0.292 |
| 75.57004 | 0.294 |
| 75.58004 | 0.295 |
| 75.59004 | 0.296 |
| 75.60004 | 0.297 |
| 75.61004 | 0.297 |
| 75.62004 | 0.298 |
| 75.63004 | 0.298 |
| 75.64004 | 0.298 |
| 75.65004 | 0.297 |
| 75.66004 | 0.296 |
| 75.67004 | 0.296 |
| 75.68004 | 0.295 |
| 75.69004 | 0.295 |
| 75.70004 | 0.295 |
| 75.71004 | 0.296 |
| 75.72004 | 0.296 |
| 75.73004 | 0.297 |
| 75.74004 | 0.297 |
| 75.75004 | 0.297 |
| 75.76004 | 0.297 |
| 75.77004 | 0.297 |
| 75.78004 | 0.296 |
| 75.79004 | 0.296 |
| 75.80004 | 0.296 |
| 75.81004 | 0.296 |
| 75.82004 | 0.296 |
| 75.83004 | 0.296 |
| 75.84004 | 0.296 |
| 75.85004 | 0.296 |
| 75.86004 | 0.296 |
| 75.87004 | 0.295 |
| 75.88004 | 0.294 |
| 75.89004 | 0.294 |
| 75.90004 | 0.293 |
| 75.91004 | 0.292 |
| 75.92004 | 0.291 |
| 75.93004 | 0.29 |
| 75.94004 | 0.29 |
| 75.95004 | 0.289 |
| 75.96004 | 0.288 |
| 75.97004 | 0.287 |
| 75.98004 | 0.286 |
| 75.99004 | 0.284 |
| 76.00004 | 0.283 |
| 76.01004 | 0.282 |
| 76.02004 | 0.281 |
| 76.03004 | 0.281 |
| 76.04004 | 0.281 |
| 76.05004 | 0.281 |
| 76.06004 | 0.282 |
| 76.07004 | 0.283 |
| 76.08004 | 0.284 |
| 76.09004 | 0.286 |
| 76.10004 | 0.287 |
| 76.11004 | 0.289 |
| 76.12004 | 0.291 |
| 76.13004 | 0.292 |
| 76.14004 | 0.293 |
| 76.15004 | 0.294 |
| 76.16004 | 0.294 |
| 76.17004 | 0.294 |
| 76.18004 | 0.294 |
| 76.19004 | 0.294 |
| 76.20004 | 0.293 |
| 76.21004 | 0.292 |
| 76.22004 | 0.291 |
| 76.23004 | 0.29 |
| 76.24004 | 0.289 |
| 76.25004 | 0.288 |
| 76.26004 | 0.288 |
| 76.27004 | 0.288 |
| 76.28004 | 0.287 |
| 76.29004 | 0.288 |
| 76.30004 | 0.289 |
| 76.31004 | 0.29 |
| 76.32004 | 0.291 |
| 76.33004 | 0.292 |
| 76.34004 | 0.293 |
| 76.35004 | 0.294 |
| 76.36004 | 0.294 |
| 76.37004 | 0.294 |
| 76.38004 | 0.293 |
| 76.39004 | 0.292 |
| 76.40004 | 0.291 |
| 76.41004 | 0.29 |
| 76.42004 | 0.288 |
| 76.43004 | 0.288 |
| 76.44004 | 0.287 |
| 76.45004 | 0.287 |
| 76.46004 | 0.287 |
| 76.47004 | 0.287 |
| 76.48004 | 0.287 |
| 76.49004 | 0.287 |
| 76.50004 | 0.287 |
| 76.51004 | 0.288 |
| 76.52004 | 0.288 |
| 76.53004 | 0.289 |
| 76.54004 | 0.291 |
| 76.55004 | 0.292 |
| 76.56004 | 0.294 |
| 76.57004 | 0.295 |
| 76.58004 | 0.297 |
| 76.59004 | 0.297 |
| 76.60004 | 0.298 |
| 76.61004 | 0.298 |
| 76.62004 | 0.297 |
| 76.63004 | 0.297 |
| 76.64004 | 0.296 |
| 76.65004 | 0.296 |
| 76.66004 | 0.296 |
| 76.67004 | 0.296 |
| 76.68004 | 0.297 |
| 76.69004 | 0.297 |
| 76.70004 | 0.297 |
| 76.71004 | 0.298 |
| 76.72004 | 0.298 |
| 76.73004 | 0.299 |
| 76.74004 | 0.299 |
| 76.75004 | 0.299 |
| 76.76004 | 0.299 |
| 76.77004 | 0.299 |
| 76.78004 | 0.299 |
| 76.79004 | 0.298 |
| 76.80004 | 0.297 |
| 76.81004 | 0.296 |
| 76.82004 | 0.294 |
| 76.83004 | 0.294 |
| 76.84004 | 0.293 |
| 76.85004 | 0.293 |
| 76.86004 | 0.293 |
| 76.87004 | 0.293 |
| 76.88004 | 0.292 |
| 76.89004 | 0.292 |
| 76.90004 | 0.291 |
| 76.91004 | 0.29 |
| 76.92004 | 0.289 |
| 76.93004 | 0.288 |
| 76.94004 | 0.286 |
| 76.95004 | 0.286 |
| 76.96004 | 0.285 |
| 76.97004 | 0.285 |
| 76.98004 | 0.285 |
| 76.99004 | 0.285 |
| 77.00004 | 0.285 |
| 77.01004 | 0.284 |
| 77.02004 | 0.284 |
| 77.03004 | 0.283 |
| 77.04004 | 0.282 |
| 77.05004 | 0.281 |
| 77.06004 | 0.28 |
| 77.07004 | 0.28 |
| 77.08004 | 0.281 |
| 77.09004 | 0.282 |
| 77.10004 | 0.283 |
| 77.11004 | 0.284 |
| 77.12004 | 0.286 |
| 77.13004 | 0.287 |
| 77.14005 | 0.289 |
| 77.15004 | 0.29 |
| 77.16004 | 0.291 |
| 77.17004 | 0.292 |
| 77.18004 | 0.294 |
| 77.19004 | 0.294 |
| 77.20004 | 0.295 |
| 77.21004 | 0.295 |
| 77.22004 | 0.295 |
| 77.23004 | 0.295 |
| 77.24004 | 0.295 |
| 77.25004 | 0.295 |
| 77.26004 | 0.295 |
| 77.27004 | 0.295 |
| 77.28004 | 0.295 |
| 77.29004 | 0.296 |
| 77.30004 | 0.297 |
| 77.31004 | 0.297 |
| 77.32004 | 0.297 |
| 77.33004 | 0.297 |
| 77.34004 | 0.297 |
| 77.35004 | 0.297 |
| 77.36004 | 0.296 |
| 77.37004 | 0.296 |
| 77.38004 | 0.296 |
| 77.39005 | 0.296 |
| 77.40004 | 0.296 |
| 77.41004 | 0.296 |
| 77.42004 | 0.296 |
| 77.43004 | 0.295 |
| 77.44004 | 0.294 |
| 77.45004 | 0.292 |
| 77.46004 | 0.291 |
| 77.47004 | 0.29 |
| 77.48004 | 0.289 |
| 77.49004 | 0.288 |
| 77.50004 | 0.288 |
| 77.51004 | 0.289 |
| 77.52004 | 0.29 |
| 77.53004 | 0.29 |
| 77.54004 | 0.291 |
| 77.55004 | 0.292 |
| 77.56004 | 0.293 |
| 77.57004 | 0.294 |
| 77.58004 | 0.295 |
| 77.59004 | 0.296 |
| 77.60004 | 0.296 |
| 77.61004 | 0.296 |
| 77.62004 | 0.296 |
| 77.63004 | 0.295 |
| 77.64005 | 0.294 |
| 77.65004 | 0.293 |
| 77.66004 | 0.292 |
| 77.67004 | 0.291 |
| 77.68004 | 0.29 |
| 77.69004 | 0.29 |
| 77.70004 | 0.29 |
| 77.71004 | 0.29 |
| 77.72004 | 0.291 |
| 77.73004 | 0.292 |
| 77.74004 | 0.294 |
| 77.75004 | 0.295 |
| 77.76004 | 0.297 |
| 77.77004 | 0.299 |
| 77.78004 | 0.3 |
| 77.79004 | 0.302 |
| 77.80004 | 0.304 |
| 77.81004 | 0.304 |
| 77.82005 | 0.305 |
| 77.83004 | 0.305 |
| 77.84004 | 0.304 |
| 77.85004 | 0.302 |
| 77.86004 | 0.3 |
| 77.87004 | 0.297 |
| 77.88004 | 0.294 |
| 77.89005 | 0.292 |
| 77.90004 | 0.29 |
| 77.91004 | 0.289 |
| 77.92004 | 0.288 |
| 77.93004 | 0.288 |
| 77.94004 | 0.288 |
| 77.95004 | 0.288 |
| 77.96004 | 0.288 |
| 77.97004 | 0.288 |
| 77.98004 | 0.287 |
| 77.99004 | 0.287 |
| 78.00004 | 0.286 |
| 78.01004 | 0.286 |
| 78.02004 | 0.287 |
| 78.03004 | 0.287 |
| 78.04004 | 0.288 |
| 78.05004 | 0.288 |
| 78.06004 | 0.289 |
| 78.07005 | 0.289 |
| 78.08004 | 0.289 |
| 78.09004 | 0.289 |
| 78.10004 | 0.288 |
| 78.11004 | 0.288 |
| 78.12004 | 0.287 |
| 78.13004 | 0.287 |
| 78.14005 | 0.287 |
| 78.15004 | 0.288 |
| 78.16004 | 0.288 |
| 78.17004 | 0.289 |
| 78.18004 | 0.29 |
| 78.19004 | 0.291 |
| 78.20004 | 0.292 |
| 78.21004 | 0.293 |
| 78.22004 | 0.294 |
| 78.23004 | 0.296 |
| 78.24004 | 0.296 |
| 78.25005 | 0.297 |
| 78.26004 | 0.296 |
| 78.27004 | 0.296 |
| 78.28004 | 0.295 |
| 78.29004 | 0.294 |
| 78.30004 | 0.294 |
| 78.31004 | 0.294 |
| 78.32005 | 0.294 |
| 78.33004 | 0.295 |
| 78.34004 | 0.296 |
| 78.35004 | 0.297 |
| 78.36004 | 0.298 |
| 78.37004 | 0.299 |
| 78.38004 | 0.299 |
| 78.39005 | 0.3 |
| 78.40004 | 0.3 |
| 78.41004 | 0.299 |
| 78.42004 | 0.299 |
| 78.43004 | 0.299 |
| 78.44004 | 0.298 |
| 78.45004 | 0.298 |
| 78.46004 | 0.297 |
| 78.47004 | 0.296 |
| 78.48004 | 0.294 |
| 78.49004 | 0.293 |
| 78.50005 | 0.292 |
| 78.51004 | 0.291 |
| 78.52004 | 0.29 |
| 78.53004 | 0.288 |
| 78.54004 | 0.287 |
| 78.55004 | 0.286 |
| 78.56004 | 0.285 |
| 78.57005 | 0.284 |
| 78.58004 | 0.283 |
| 78.59004 | 0.282 |
| 78.60004 | 0.28 |
| 78.61004 | 0.279 |
| 78.62004 | 0.278 |
| 78.63004 | 0.278 |
| 78.64005 | 0.278 |
| 78.65004 | 0.279 |
| 78.66004 | 0.28 |
| 78.67004 | 0.282 |
| 78.68004 | 0.284 |
| 78.69004 | 0.286 |
| 78.70004 | 0.287 |
| 78.71004 | 0.287 |
| 78.72004 | 0.287 |
| 78.73004 | 0.286 |
| 78.74004 | 0.284 |
| 78.75005 | 0.283 |
| 78.76004 | 0.282 |
| 78.77004 | 0.282 |
| 78.78004 | 0.283 |
| 78.79004 | 0.284 |
| 78.80004 | 0.287 |
| 78.81004 | 0.29 |
| 78.82005 | 0.293 |
| 78.83004 | 0.295 |
| 78.84004 | 0.295 |
| 78.85004 | 0.295 |
| 78.86004 | 0.293 |
| 78.87004 | 0.292 |
| 78.88004 | 0.29 |
| 78.89005 | 0.29 |
| 78.90004 | 0.291 |
| 78.91004 | 0.293 |
| 78.92004 | 0.296 |
| 78.93005 | 0.299 |
| 78.94004 | 0.303 |
| 78.95004 | 0.306 |
| 78.96004 | 0.308 |
| 78.97004 | 0.312 |
| 78.98004 | 0.315 |
| 78.99004 | 0.32 |
| 79.00005 | 0.326 |
| 79.01004 | 0.332 |
| 79.02004 | 0.338 |
| 79.03004 | 0.343 |
| 79.04004 | 0.344 |
| 79.05004 | 0.341 |
| 79.06004 | 0.333 |
| 79.07005 | 0.322 |
| 79.08004 | 0.307 |
| 79.09004 | 0.29 |
| 79.10004 | 0.275 |
| 79.11004 | 0.263 |
| 79.12004 | 0.256 |
| 79.13004 | 0.253 |
| 79.14005 | 0.255 |
| 79.15004 | 0.26 |
| 79.16004 | 0.267 |
| 79.17004 | 0.273 |
| 79.18005 | 0.278 |
| 79.19004 | 0.28 |
| 79.20004 | 0.28 |
| 79.21004 | 0.277 |
| 79.22004 | 0.273 |
| 79.23004 | 0.269 |
| 79.24004 | 0.264 |
| 79.25005 | 0.26 |
| 79.26004 | 0.257 |
| 79.27004 | 0.255 |
| 79.28004 | 0.255 |
| 79.29004 | 0.256 |
| 79.30004 | 0.259 |
| 79.31004 | 0.262 |
| 79.32005 | 0.266 |
| 79.33004 | 0.268 |
| 79.34004 | 0.267 |
| 79.35004 | 0.264 |
| 79.36005 | 0.258 |
| 79.37004 | 0.25 |
| 79.38004 | 0.243 |
| 79.39005 | 0.238 |
| 79.40004 | 0.236 |
| 79.41004 | 0.24 |
| 79.42004 | 0.25 |
| 79.43005 | 0.265 |
| 79.44004 | 0.285 |
| 79.45004 | 0.308 |
| 79.46004 | 0.332 |
| 79.47004 | 0.358 |
| 79.48004 | 0.382 |
| 79.49004 | 0.404 |
| 79.50005 | 0.422 |
| 79.51004 | 0.434 |
| 79.52004 | 0.441 |
| 79.53004 | 0.441 |
| 79.54004 | 0.434 |
| 79.55004 | 0.422 |
| 79.56004 | 0.405 |
| 79.57005 | 0.386 |
| 79.58004 | 0.367 |
| 79.59004 | 0.349 |
| 79.60004 | 0.333 |
| 79.61005 | 0.319 |
| 79.62004 | 0.306 |
| 79.63004 | 0.294 |
| 79.64005 | 0.282 |
| 79.65004 | 0.27 |
| 79.66004 | 0.258 |
| 79.67004 | 0.248 |
| 79.68005 | 0.239 |
| 79.69004 | 0.234 |
| 79.70004 | 0.231 |
| 79.71004 | 0.232 |
| 79.72004 | 0.234 |
| 79.73004 | 0.239 |
| 79.74004 | 0.244 |
| 79.75005 | 0.249 |
| 79.76004 | 0.254 |
| 79.77004 | 0.258 |
| 79.78004 | 0.261 |
| 79.79004 | 0.261 |
| 79.80004 | 0.258 |
| 79.81004 | 0.252 |
| 79.82005 | 0.241 |
| 79.83004 | 0.228 |
| 79.84004 | 0.213 |
| 79.85004 | 0.2 |
| 79.86005 | 0.19 |
| 79.87004 | 0.184 |
| 79.88004 | 0.184 |
| 79.89005 | 0.188 |
| 79.90004 | 0.197 |
| 79.91004 | 0.21 |
| 79.92004 | 0.227 |
| 79.93005 | 0.249 |
| 79.94004 | 0.275 |
| 79.95004 | 0.307 |
| 79.96004 | 0.343 |
| 79.97004 | 0.38 |
| 79.98004 | 0.415 |
| 79.99004 | 0.442 |
| 80.00005 | 0.458 |
| 80.01004 | 0.461 |
| 80.02004 | 0.451 |
| 80.03004 | 0.43 |
| 80.04005 | 0.402 |
| 80.05004 | 0.372 |
| 80.06004 | 0.344 |
| 80.07005 | 0.321 |
| 80.08004 | 0.303 |
| 80.09004 | 0.29 |
| 80.10004 | 0.28 |
| 80.11005 | 0.273 |
| 80.12004 | 0.265 |
| 80.13004 | 0.259 |
| 80.14005 | 0.254 |
| 80.15004 | 0.252 |
| 80.16004 | 0.253 |
| 80.17004 | 0.257 |
| 80.18005 | 0.263 |
| 80.19004 | 0.27 |
| 80.20004 | 0.274 |
| 80.21004 | 0.275 |
| 80.22004 | 0.272 |
| 80.23004 | 0.265 |
| 80.24004 | 0.254 |
| 80.25005 | 0.243 |
| 80.26004 | 0.23 |
| 80.27004 | 0.218 |
| 80.28004 | 0.206 |
| 80.29005 | 0.193 |
| 80.30004 | 0.18 |
| 80.31004 | 0.167 |
| 80.32005 | 0.159 |
| 80.33004 | 0.158 |
| 80.34004 | 0.168 |
| 80.35004 | 0.191 |
| 80.36005 | 0.229 |
| 80.37004 | 0.28 |
| 80.38004 | 0.34 |
| 80.39005 | 0.404 |
| 80.40004 | 0.465 |
| 80.41004 | 0.518 |
| 80.42004 | 0.56 |
| 80.43005 | 0.588 |
| 80.44004 | 0.603 |
| 80.45004 | 0.603 |
| 80.46004 | 0.59 |
| 80.47004 | 0.563 |
| 80.48004 | 0.524 |
| 80.49004 | 0.475 |
| 80.50005 | 0.42 |
| 80.51004 | 0.363 |
| 80.52004 | 0.309 |
| 80.53004 | 0.266 |
| 80.54005 | 0.237 |
| 80.55004 | 0.223 |
| 80.56004 | 0.223 |
| 80.57005 | 0.234 |
| 80.58004 | 0.249 |
| 80.59004 | 0.263 |
| 80.60004 | 0.272 |
| 80.61005 | 0.271 |
| 80.62004 | 0.262 |
| 80.63004 | 0.246 |
| 80.64005 | 0.226 |
| 80.65004 | 0.206 |
| 80.66004 | 0.189 |
| 80.67004 | 0.177 |
| 80.68005 | 0.169 |
| 80.69004 | 0.163 |
| 80.70004 | 0.157 |
| 80.71004 | 0.148 |
| 80.72005 | 0.135 |
| 80.73004 | 0.118 |
| 80.74004 | 0.099 |
| 80.75005 | 0.084 |
| 80.76004 | 0.076 |
| 80.77004 | 0.081 |
| 80.78004 | 0.101 |
| 80.79005 | 0.135 |
| 80.80004 | 0.181 |
| 80.81004 | 0.234 |
| 80.82005 | 0.289 |
| 80.83004 | 0.34 |
| 80.84004 | 0.381 |
| 80.85004 | 0.412 |
| 80.86005 | 0.429 |
| 80.87004 | 0.433 |
| 80.88004 | 0.425 |
| 80.89005 | 0.409 |
| 80.90004 | 0.386 |
| 80.91004 | 0.362 |
| 80.92004 | 0.34 |
| 80.93005 | 0.322 |
| 80.94004 | 0.31 |
| 80.95004 | 0.305 |
| 80.96004 | 0.304 |
| 80.97005 | 0.305 |
| 80.98004 | 0.306 |
| 80.99004 | 0.306 |
| 81.00005 | 0.306 |
| 81.01004 | 0.307 |
| 81.02004 | 0.308 |
| 81.03004 | 0.311 |
| 81.04005 | 0.313 |
| 81.05004 | 0.311 |
| 81.06004 | 0.302 |
| 81.07005 | 0.285 |
| 81.08004 | 0.26 |
| 81.09004 | 0.234 |
| 81.10004 | 0.211 |
| 81.11005 | 0.198 |
| 81.12004 | 0.199 |
| 81.13004 | 0.214 |
| 81.14005 | 0.238 |
| 81.15005 | 0.266 |
| 81.16004 | 0.289 |
| 81.17004 | 0.306 |
| 81.18005 | 0.313 |
| 81.19004 | 0.317 |
| 81.20004 | 0.322 |
| 81.21004 | 0.334 |
| 81.22005 | 0.356 |
| 81.23004 | 0.388 |
| 81.24004 | 0.423 |
| 81.25005 | 0.456 |
| 81.26004 | 0.478 |
| 81.27004 | 0.488 |
| 81.28004 | 0.484 |
| 81.29005 | 0.471 |
| 81.30004 | 0.454 |
| 81.31004 | 0.438 |
| 81.32005 | 0.425 |
| 81.33004 | 0.414 |
| 81.34004 | 0.402 |
| 81.35004 | 0.383 |
| 81.36005 | 0.354 |
| 81.37004 | 0.316 |
| 81.38004 | 0.273 |
| 81.39005 | 0.232 |
| 81.40005 | 0.198 |
| 81.41004 | 0.179 |
| 81.42004 | 0.175 |
| 81.43005 | 0.185 |
| 81.44004 | 0.203 |
| 81.45004 | 0.222 |
| 81.46004 | 0.233 |
| 81.47005 | 0.234 |
| 81.48004 | 0.221 |
| 81.49004 | 0.198 |
| 81.50005 | 0.169 |
| 81.51004 | 0.139 |
| 81.52004 | 0.113 |
| 81.53004 | 0.093 |
| 81.54005 | 0.079 |
| 81.55004 | 0.07 |
| 81.56004 | 0.064 |
| 81.57005 | 0.061 |
| 81.58004 | 0.064 |
| 81.59004 | 0.076 |
| 81.60004 | 0.102 |
| 81.61005 | 0.145 |
| 81.62004 | 0.205 |
| 81.63004 | 0.281 |
| 81.64005 | 0.363 |
| 81.65005 | 0.442 |
| 81.66004 | 0.508 |
| 81.67004 | 0.551 |
| 81.68005 | 0.568 |
| 81.69004 | 0.557 |
| 81.70004 | 0.524 |
| 81.71004 | 0.474 |
| 81.72005 | 0.416 |
| 81.73004 | 0.359 |
| 81.74004 | 0.306 |
| 81.75005 | 0.264 |
| 81.76004 | 0.236 |
| 81.77004 | 0.221 |
| 81.78004 | 0.223 |
| 81.79005 | 0.242 |
| 81.80004 | 0.276 |
| 81.81004 | 0.321 |
| 81.82005 | 0.37 |
| 81.83005 | 0.416 |
| 81.84004 | 0.446 |
| 81.85004 | 0.453 |
| 81.86005 | 0.431 |
| 81.87004 | 0.379 |
| 81.88004 | 0.303 |
| 81.89005 | 0.213 |
| 81.90005 | 0.124 |
| 81.91004 | 0.049 |